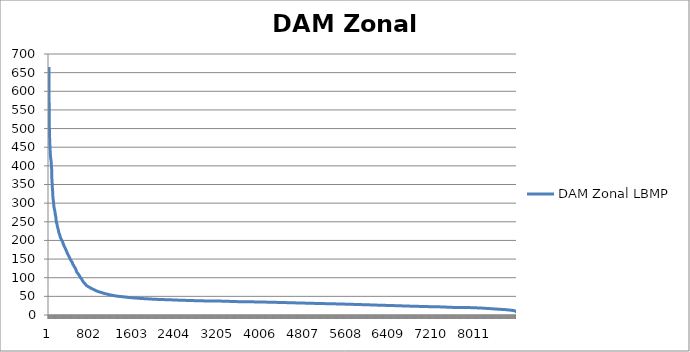
| Category | DAM Zonal LBMP |
|---|---|
| 0 | 665.35 |
| 1 | 580.62 |
| 2 | 568.12 |
| 3 | 553.7 |
| 4 | 545.89 |
| 5 | 512.96 |
| 6 | 510.96 |
| 7 | 499.26 |
| 8 | 496.6 |
| 9 | 488.15 |
| 10 | 484.15 |
| 11 | 476.56 |
| 12 | 470.48 |
| 13 | 469.7 |
| 14 | 469.51 |
| 15 | 469.26 |
| 16 | 456 |
| 17 | 455.35 |
| 18 | 454.32 |
| 19 | 451.83 |
| 20 | 444.58 |
| 21 | 442.92 |
| 22 | 436.74 |
| 23 | 436.43 |
| 24 | 432.55 |
| 25 | 429.77 |
| 26 | 428.51 |
| 27 | 428.31 |
| 28 | 427.46 |
| 29 | 424.09 |
| 30 | 424.05 |
| 31 | 420.36 |
| 32 | 419.94 |
| 33 | 419.63 |
| 34 | 418.89 |
| 35 | 417.69 |
| 36 | 415.25 |
| 37 | 415.15 |
| 38 | 412.58 |
| 39 | 411.76 |
| 40 | 410.02 |
| 41 | 408.96 |
| 42 | 407.86 |
| 43 | 403.65 |
| 44 | 403.42 |
| 45 | 400.76 |
| 46 | 400.01 |
| 47 | 399.33 |
| 48 | 395.94 |
| 49 | 395.76 |
| 50 | 385.12 |
| 51 | 379.65 |
| 52 | 378.15 |
| 53 | 366.16 |
| 54 | 363.54 |
| 55 | 362.32 |
| 56 | 360.92 |
| 57 | 357.07 |
| 58 | 354.54 |
| 59 | 351.6 |
| 60 | 349.87 |
| 61 | 347.77 |
| 62 | 343.25 |
| 63 | 339.69 |
| 64 | 339.37 |
| 65 | 337.61 |
| 66 | 334.68 |
| 67 | 333.67 |
| 68 | 331.34 |
| 69 | 330.41 |
| 70 | 329.14 |
| 71 | 326.86 |
| 72 | 318.92 |
| 73 | 316.81 |
| 74 | 311.57 |
| 75 | 311.02 |
| 76 | 311.01 |
| 77 | 310.96 |
| 78 | 310.32 |
| 79 | 309.67 |
| 80 | 308.73 |
| 81 | 306.71 |
| 82 | 304.13 |
| 83 | 302.86 |
| 84 | 301.21 |
| 85 | 300.62 |
| 86 | 298.93 |
| 87 | 298.48 |
| 88 | 298.3 |
| 89 | 297.45 |
| 90 | 293.29 |
| 91 | 292.78 |
| 92 | 291.14 |
| 93 | 289.45 |
| 94 | 289.05 |
| 95 | 287.3 |
| 96 | 287.07 |
| 97 | 286.2 |
| 98 | 285.13 |
| 99 | 284.58 |
| 100 | 283.75 |
| 101 | 283.4 |
| 102 | 283.07 |
| 103 | 282.37 |
| 104 | 282 |
| 105 | 281.5 |
| 106 | 281.09 |
| 107 | 279.94 |
| 108 | 278.68 |
| 109 | 278.52 |
| 110 | 277.72 |
| 111 | 277.33 |
| 112 | 275.64 |
| 113 | 275.32 |
| 114 | 274.28 |
| 115 | 272.55 |
| 116 | 272.09 |
| 117 | 271.33 |
| 118 | 271.12 |
| 119 | 268.73 |
| 120 | 268.51 |
| 121 | 268.48 |
| 122 | 266.72 |
| 123 | 266.6 |
| 124 | 266.44 |
| 125 | 264 |
| 126 | 262.85 |
| 127 | 262.77 |
| 128 | 262.18 |
| 129 | 261.53 |
| 130 | 260.36 |
| 131 | 258.55 |
| 132 | 258.51 |
| 133 | 253.5 |
| 134 | 251.85 |
| 135 | 249.62 |
| 136 | 249.53 |
| 137 | 249.08 |
| 138 | 248.22 |
| 139 | 248 |
| 140 | 247.15 |
| 141 | 247.06 |
| 142 | 247 |
| 143 | 246.88 |
| 144 | 246.64 |
| 145 | 245.53 |
| 146 | 245.09 |
| 147 | 244.69 |
| 148 | 244.17 |
| 149 | 242.4 |
| 150 | 242.17 |
| 151 | 241.96 |
| 152 | 241.79 |
| 153 | 240.59 |
| 154 | 239.48 |
| 155 | 239.36 |
| 156 | 238.17 |
| 157 | 237.41 |
| 158 | 236.95 |
| 159 | 236.7 |
| 160 | 236.33 |
| 161 | 235.99 |
| 162 | 234.31 |
| 163 | 234.3 |
| 164 | 232.98 |
| 165 | 232.9 |
| 166 | 232.33 |
| 167 | 231.44 |
| 168 | 231.11 |
| 169 | 230.97 |
| 170 | 230.01 |
| 171 | 229.63 |
| 172 | 229.58 |
| 173 | 229.51 |
| 174 | 228.38 |
| 175 | 226.42 |
| 176 | 226.26 |
| 177 | 226.19 |
| 178 | 225 |
| 179 | 224.56 |
| 180 | 223.85 |
| 181 | 222.18 |
| 182 | 221.73 |
| 183 | 220.83 |
| 184 | 220.6 |
| 185 | 220.38 |
| 186 | 220.2 |
| 187 | 219.83 |
| 188 | 219.8 |
| 189 | 219.76 |
| 190 | 218.7 |
| 191 | 218.39 |
| 192 | 218.16 |
| 193 | 217.97 |
| 194 | 217.66 |
| 195 | 217.36 |
| 196 | 215.95 |
| 197 | 215.92 |
| 198 | 215.72 |
| 199 | 215.2 |
| 200 | 214.83 |
| 201 | 214.58 |
| 202 | 214.32 |
| 203 | 213.27 |
| 204 | 213.25 |
| 205 | 213.02 |
| 206 | 210.9 |
| 207 | 210.83 |
| 208 | 209.74 |
| 209 | 209.39 |
| 210 | 209.34 |
| 211 | 209.13 |
| 212 | 208.88 |
| 213 | 208.8 |
| 214 | 208.64 |
| 215 | 208.41 |
| 216 | 207.47 |
| 217 | 206.36 |
| 218 | 206.25 |
| 219 | 206.23 |
| 220 | 206.17 |
| 221 | 206.06 |
| 222 | 205.9 |
| 223 | 205.64 |
| 224 | 205.37 |
| 225 | 205.34 |
| 226 | 205.17 |
| 227 | 204.56 |
| 228 | 204.25 |
| 229 | 203.61 |
| 230 | 203.3 |
| 231 | 203.11 |
| 232 | 202.7 |
| 233 | 202.28 |
| 234 | 201.8 |
| 235 | 201.67 |
| 236 | 201.57 |
| 237 | 201.26 |
| 238 | 200.04 |
| 239 | 199.91 |
| 240 | 199.86 |
| 241 | 199.64 |
| 242 | 198.75 |
| 243 | 198.73 |
| 244 | 198.48 |
| 245 | 198.35 |
| 246 | 198.17 |
| 247 | 198.08 |
| 248 | 197.7 |
| 249 | 197.55 |
| 250 | 197.24 |
| 251 | 197.11 |
| 252 | 197.1 |
| 253 | 196.43 |
| 254 | 195.7 |
| 255 | 195.61 |
| 256 | 195.61 |
| 257 | 195 |
| 258 | 194.77 |
| 259 | 194.41 |
| 260 | 194.3 |
| 261 | 193.99 |
| 262 | 192.54 |
| 263 | 192.19 |
| 264 | 191.29 |
| 265 | 191.2 |
| 266 | 191.03 |
| 267 | 190.75 |
| 268 | 189.97 |
| 269 | 189.88 |
| 270 | 189.79 |
| 271 | 189.69 |
| 272 | 189.2 |
| 273 | 188.55 |
| 274 | 188.21 |
| 275 | 188.09 |
| 276 | 187.88 |
| 277 | 187.34 |
| 278 | 187.3 |
| 279 | 186.15 |
| 280 | 185.68 |
| 281 | 185.16 |
| 282 | 185.12 |
| 283 | 184.86 |
| 284 | 184.83 |
| 285 | 184.71 |
| 286 | 184.16 |
| 287 | 183.75 |
| 288 | 183.39 |
| 289 | 183.26 |
| 290 | 182.99 |
| 291 | 182.4 |
| 292 | 181.33 |
| 293 | 181.15 |
| 294 | 181.03 |
| 295 | 180.87 |
| 296 | 180.72 |
| 297 | 180.6 |
| 298 | 180.54 |
| 299 | 180.34 |
| 300 | 180.1 |
| 301 | 179.39 |
| 302 | 178.2 |
| 303 | 178.04 |
| 304 | 178 |
| 305 | 177.98 |
| 306 | 177.89 |
| 307 | 177.51 |
| 308 | 177.29 |
| 309 | 177.07 |
| 310 | 176.97 |
| 311 | 176.56 |
| 312 | 176.44 |
| 313 | 175.9 |
| 314 | 175.14 |
| 315 | 175.12 |
| 316 | 174.78 |
| 317 | 174.33 |
| 318 | 174.24 |
| 319 | 174.12 |
| 320 | 174.12 |
| 321 | 173.89 |
| 322 | 173.33 |
| 323 | 173.11 |
| 324 | 172.91 |
| 325 | 172.42 |
| 326 | 172.3 |
| 327 | 171.95 |
| 328 | 171.3 |
| 329 | 171.13 |
| 330 | 170.32 |
| 331 | 170.21 |
| 332 | 169.04 |
| 333 | 168.88 |
| 334 | 168.88 |
| 335 | 168.62 |
| 336 | 168.45 |
| 337 | 168.21 |
| 338 | 167.56 |
| 339 | 167.48 |
| 340 | 167.22 |
| 341 | 166.13 |
| 342 | 165.25 |
| 343 | 165.18 |
| 344 | 165.15 |
| 345 | 164.66 |
| 346 | 164.41 |
| 347 | 163.8 |
| 348 | 163.72 |
| 349 | 163.53 |
| 350 | 163.06 |
| 351 | 163.03 |
| 352 | 162.88 |
| 353 | 162.79 |
| 354 | 162.58 |
| 355 | 162.32 |
| 356 | 162.31 |
| 357 | 162.05 |
| 358 | 161.85 |
| 359 | 161.33 |
| 360 | 160.7 |
| 361 | 160.52 |
| 362 | 160 |
| 363 | 159.7 |
| 364 | 159.58 |
| 365 | 159.52 |
| 366 | 159.35 |
| 367 | 159.33 |
| 368 | 158.91 |
| 369 | 158.45 |
| 370 | 158.35 |
| 371 | 158.24 |
| 372 | 158.12 |
| 373 | 157.7 |
| 374 | 157.22 |
| 375 | 157.19 |
| 376 | 156.4 |
| 377 | 156.28 |
| 378 | 156.25 |
| 379 | 155.78 |
| 380 | 155.19 |
| 381 | 154.25 |
| 382 | 154.21 |
| 383 | 154.15 |
| 384 | 154.09 |
| 385 | 153.25 |
| 386 | 152.77 |
| 387 | 152.76 |
| 388 | 152.76 |
| 389 | 152.44 |
| 390 | 152.38 |
| 391 | 152.01 |
| 392 | 151.75 |
| 393 | 151.58 |
| 394 | 150.44 |
| 395 | 150 |
| 396 | 149.78 |
| 397 | 149.4 |
| 398 | 149 |
| 399 | 148.92 |
| 400 | 148.72 |
| 401 | 148.15 |
| 402 | 148.07 |
| 403 | 147.92 |
| 404 | 147.73 |
| 405 | 147.62 |
| 406 | 147.54 |
| 407 | 147.51 |
| 408 | 147.47 |
| 409 | 147.03 |
| 410 | 145.99 |
| 411 | 145.72 |
| 412 | 145.68 |
| 413 | 145.63 |
| 414 | 145.32 |
| 415 | 145.25 |
| 416 | 144.98 |
| 417 | 144.88 |
| 418 | 144.76 |
| 419 | 144.45 |
| 420 | 143.89 |
| 421 | 143.77 |
| 422 | 143.63 |
| 423 | 143.58 |
| 424 | 143.44 |
| 425 | 143.31 |
| 426 | 143.07 |
| 427 | 142.99 |
| 428 | 142.78 |
| 429 | 142.43 |
| 430 | 142.21 |
| 431 | 141.75 |
| 432 | 141.67 |
| 433 | 141.34 |
| 434 | 140.16 |
| 435 | 140.04 |
| 436 | 139.99 |
| 437 | 139.88 |
| 438 | 139.49 |
| 439 | 139.31 |
| 440 | 138.92 |
| 441 | 138.32 |
| 442 | 137.85 |
| 443 | 137.58 |
| 444 | 136.36 |
| 445 | 136.06 |
| 446 | 135.91 |
| 447 | 135.74 |
| 448 | 135.68 |
| 449 | 135.68 |
| 450 | 135.33 |
| 451 | 135.18 |
| 452 | 135.01 |
| 453 | 134.7 |
| 454 | 134.54 |
| 455 | 134.53 |
| 456 | 134.3 |
| 457 | 134.2 |
| 458 | 133.73 |
| 459 | 133.59 |
| 460 | 133.53 |
| 461 | 133.49 |
| 462 | 133.1 |
| 463 | 132.77 |
| 464 | 132.47 |
| 465 | 132.32 |
| 466 | 131.88 |
| 467 | 131.49 |
| 468 | 131.14 |
| 469 | 131.12 |
| 470 | 131.04 |
| 471 | 130.96 |
| 472 | 129.62 |
| 473 | 129.61 |
| 474 | 129.58 |
| 475 | 128.76 |
| 476 | 128.59 |
| 477 | 128.53 |
| 478 | 128.26 |
| 479 | 127.99 |
| 480 | 127.9 |
| 481 | 127.7 |
| 482 | 127.64 |
| 483 | 127.08 |
| 484 | 127.03 |
| 485 | 126.86 |
| 486 | 126.59 |
| 487 | 126.53 |
| 488 | 126.48 |
| 489 | 126.2 |
| 490 | 126.13 |
| 491 | 125.93 |
| 492 | 125.63 |
| 493 | 125.17 |
| 494 | 124.48 |
| 495 | 124.34 |
| 496 | 124.14 |
| 497 | 123.43 |
| 498 | 122.81 |
| 499 | 122.57 |
| 500 | 122.54 |
| 501 | 122.52 |
| 502 | 122.48 |
| 503 | 122.24 |
| 504 | 122.07 |
| 505 | 120.87 |
| 506 | 120.2 |
| 507 | 119.87 |
| 508 | 119.44 |
| 509 | 119.28 |
| 510 | 118.93 |
| 511 | 118.09 |
| 512 | 117.88 |
| 513 | 117.83 |
| 514 | 117.48 |
| 515 | 117.36 |
| 516 | 116.48 |
| 517 | 116.1 |
| 518 | 115.67 |
| 519 | 115 |
| 520 | 114.56 |
| 521 | 114.55 |
| 522 | 114.27 |
| 523 | 114.21 |
| 524 | 113.76 |
| 525 | 113.7 |
| 526 | 113.65 |
| 527 | 113.52 |
| 528 | 113.5 |
| 529 | 113.45 |
| 530 | 113.35 |
| 531 | 113.07 |
| 532 | 112.94 |
| 533 | 112.71 |
| 534 | 112.56 |
| 535 | 112.2 |
| 536 | 111.62 |
| 537 | 111.35 |
| 538 | 111.22 |
| 539 | 111.18 |
| 540 | 111.14 |
| 541 | 110.91 |
| 542 | 110.68 |
| 543 | 110.65 |
| 544 | 110.54 |
| 545 | 110.51 |
| 546 | 110.23 |
| 547 | 109.87 |
| 548 | 109.63 |
| 549 | 109.51 |
| 550 | 109.06 |
| 551 | 108.71 |
| 552 | 108.36 |
| 553 | 108.11 |
| 554 | 108.08 |
| 555 | 107.83 |
| 556 | 107.69 |
| 557 | 107.58 |
| 558 | 107.58 |
| 559 | 107.55 |
| 560 | 107.45 |
| 561 | 107.31 |
| 562 | 106.95 |
| 563 | 106.7 |
| 564 | 106.55 |
| 565 | 106.38 |
| 566 | 106.25 |
| 567 | 105.48 |
| 568 | 105.22 |
| 569 | 105 |
| 570 | 104.88 |
| 571 | 104.86 |
| 572 | 104.76 |
| 573 | 104.37 |
| 574 | 103.98 |
| 575 | 103.9 |
| 576 | 103.77 |
| 577 | 103.68 |
| 578 | 103.26 |
| 579 | 103.02 |
| 580 | 102.55 |
| 581 | 102.04 |
| 582 | 101.7 |
| 583 | 101.45 |
| 584 | 101.2 |
| 585 | 100.79 |
| 586 | 100.76 |
| 587 | 100.59 |
| 588 | 100.45 |
| 589 | 100.26 |
| 590 | 99.94 |
| 591 | 99.86 |
| 592 | 99.71 |
| 593 | 99.68 |
| 594 | 99.51 |
| 595 | 99.2 |
| 596 | 99.1 |
| 597 | 98.97 |
| 598 | 98.9 |
| 599 | 98.75 |
| 600 | 98.43 |
| 601 | 98.41 |
| 602 | 98.37 |
| 603 | 97.71 |
| 604 | 97.5 |
| 605 | 97.14 |
| 606 | 96.63 |
| 607 | 96.6 |
| 608 | 96.42 |
| 609 | 96.14 |
| 610 | 96.13 |
| 611 | 95.84 |
| 612 | 95.81 |
| 613 | 95.8 |
| 614 | 95.7 |
| 615 | 95.23 |
| 616 | 94.61 |
| 617 | 94.55 |
| 618 | 94.4 |
| 619 | 94.23 |
| 620 | 93.51 |
| 621 | 93.2 |
| 622 | 93.2 |
| 623 | 92.85 |
| 624 | 92.83 |
| 625 | 92.79 |
| 626 | 91.94 |
| 627 | 91.83 |
| 628 | 91.81 |
| 629 | 91.63 |
| 630 | 91.57 |
| 631 | 90.82 |
| 632 | 90.31 |
| 633 | 90.29 |
| 634 | 90.29 |
| 635 | 90.25 |
| 636 | 90.14 |
| 637 | 90.04 |
| 638 | 89.94 |
| 639 | 89.77 |
| 640 | 89.7 |
| 641 | 89.15 |
| 642 | 89.04 |
| 643 | 88.73 |
| 644 | 88.17 |
| 645 | 88.13 |
| 646 | 88.09 |
| 647 | 88.07 |
| 648 | 87.81 |
| 649 | 87.8 |
| 650 | 87.34 |
| 651 | 87.03 |
| 652 | 86.94 |
| 653 | 86.93 |
| 654 | 86.92 |
| 655 | 86.8 |
| 656 | 86.43 |
| 657 | 86.04 |
| 658 | 85.95 |
| 659 | 85.72 |
| 660 | 85.67 |
| 661 | 85.56 |
| 662 | 85.38 |
| 663 | 85.29 |
| 664 | 85.16 |
| 665 | 85.14 |
| 666 | 85.01 |
| 667 | 85.01 |
| 668 | 84.54 |
| 669 | 84.32 |
| 670 | 84.13 |
| 671 | 84.11 |
| 672 | 83.93 |
| 673 | 83.88 |
| 674 | 83.67 |
| 675 | 83.64 |
| 676 | 83.45 |
| 677 | 83.29 |
| 678 | 83.04 |
| 679 | 82.97 |
| 680 | 82.73 |
| 681 | 82.51 |
| 682 | 82.32 |
| 683 | 82.25 |
| 684 | 82.12 |
| 685 | 81.81 |
| 686 | 81.7 |
| 687 | 81.66 |
| 688 | 81.66 |
| 689 | 81.48 |
| 690 | 81.43 |
| 691 | 81.36 |
| 692 | 81.21 |
| 693 | 80.64 |
| 694 | 80.5 |
| 695 | 80.26 |
| 696 | 79.79 |
| 697 | 79.48 |
| 698 | 79.34 |
| 699 | 79.31 |
| 700 | 79.28 |
| 701 | 79.08 |
| 702 | 79.04 |
| 703 | 78.95 |
| 704 | 78.87 |
| 705 | 78.69 |
| 706 | 78.59 |
| 707 | 78.48 |
| 708 | 78.47 |
| 709 | 78.47 |
| 710 | 78.32 |
| 711 | 78.3 |
| 712 | 78.27 |
| 713 | 78.18 |
| 714 | 78.1 |
| 715 | 78.08 |
| 716 | 77.54 |
| 717 | 77.52 |
| 718 | 77.34 |
| 719 | 77.32 |
| 720 | 77.27 |
| 721 | 77.24 |
| 722 | 77.21 |
| 723 | 77.19 |
| 724 | 77.15 |
| 725 | 77.06 |
| 726 | 77.04 |
| 727 | 76.99 |
| 728 | 76.93 |
| 729 | 76.78 |
| 730 | 76.68 |
| 731 | 76.6 |
| 732 | 76.58 |
| 733 | 76.35 |
| 734 | 76.24 |
| 735 | 76.19 |
| 736 | 76.1 |
| 737 | 76.02 |
| 738 | 75.97 |
| 739 | 75.55 |
| 740 | 75.46 |
| 741 | 75.26 |
| 742 | 75.24 |
| 743 | 75.18 |
| 744 | 75.18 |
| 745 | 75.16 |
| 746 | 75.12 |
| 747 | 75.11 |
| 748 | 75.09 |
| 749 | 74.97 |
| 750 | 74.88 |
| 751 | 74.86 |
| 752 | 74.69 |
| 753 | 74.64 |
| 754 | 74.62 |
| 755 | 74.49 |
| 756 | 74.47 |
| 757 | 74.47 |
| 758 | 74.41 |
| 759 | 74.29 |
| 760 | 74.28 |
| 761 | 73.94 |
| 762 | 73.9 |
| 763 | 73.88 |
| 764 | 73.86 |
| 765 | 73.86 |
| 766 | 73.77 |
| 767 | 73.59 |
| 768 | 73.44 |
| 769 | 73.17 |
| 770 | 72.88 |
| 771 | 72.74 |
| 772 | 72.73 |
| 773 | 72.68 |
| 774 | 72.63 |
| 775 | 72.63 |
| 776 | 72.6 |
| 777 | 72.49 |
| 778 | 72.41 |
| 779 | 72.36 |
| 780 | 72.35 |
| 781 | 72.28 |
| 782 | 72.28 |
| 783 | 72.15 |
| 784 | 72.1 |
| 785 | 71.96 |
| 786 | 71.8 |
| 787 | 71.79 |
| 788 | 71.75 |
| 789 | 71.46 |
| 790 | 71.44 |
| 791 | 71.17 |
| 792 | 71.15 |
| 793 | 71.09 |
| 794 | 71.08 |
| 795 | 71.08 |
| 796 | 70.89 |
| 797 | 70.87 |
| 798 | 70.71 |
| 799 | 70.68 |
| 800 | 70.68 |
| 801 | 70.67 |
| 802 | 70.63 |
| 803 | 70.55 |
| 804 | 70.5 |
| 805 | 70.46 |
| 806 | 70.33 |
| 807 | 70.33 |
| 808 | 70.31 |
| 809 | 70.07 |
| 810 | 69.97 |
| 811 | 69.97 |
| 812 | 69.93 |
| 813 | 69.92 |
| 814 | 69.91 |
| 815 | 69.84 |
| 816 | 69.84 |
| 817 | 69.72 |
| 818 | 69.71 |
| 819 | 69.51 |
| 820 | 69.51 |
| 821 | 69.51 |
| 822 | 69.49 |
| 823 | 69.46 |
| 824 | 69.46 |
| 825 | 69.17 |
| 826 | 69.14 |
| 827 | 69 |
| 828 | 68.98 |
| 829 | 68.79 |
| 830 | 68.78 |
| 831 | 68.61 |
| 832 | 68.47 |
| 833 | 68.39 |
| 834 | 68.35 |
| 835 | 68.32 |
| 836 | 68.29 |
| 837 | 68.19 |
| 838 | 68.07 |
| 839 | 68.04 |
| 840 | 68.02 |
| 841 | 67.93 |
| 842 | 67.9 |
| 843 | 67.73 |
| 844 | 67.64 |
| 845 | 67.43 |
| 846 | 67.41 |
| 847 | 67.27 |
| 848 | 67.26 |
| 849 | 67.25 |
| 850 | 67.16 |
| 851 | 67.11 |
| 852 | 67.1 |
| 853 | 67.1 |
| 854 | 67.09 |
| 855 | 67.04 |
| 856 | 66.91 |
| 857 | 66.85 |
| 858 | 66.78 |
| 859 | 66.63 |
| 860 | 66.45 |
| 861 | 66.38 |
| 862 | 66.32 |
| 863 | 66.27 |
| 864 | 66.09 |
| 865 | 66.03 |
| 866 | 66.02 |
| 867 | 65.82 |
| 868 | 65.81 |
| 869 | 65.72 |
| 870 | 65.71 |
| 871 | 65.56 |
| 872 | 65.55 |
| 873 | 65.49 |
| 874 | 65.48 |
| 875 | 65.39 |
| 876 | 65.25 |
| 877 | 65.24 |
| 878 | 65.23 |
| 879 | 65.09 |
| 880 | 64.99 |
| 881 | 64.93 |
| 882 | 64.91 |
| 883 | 64.91 |
| 884 | 64.87 |
| 885 | 64.87 |
| 886 | 64.79 |
| 887 | 64.74 |
| 888 | 64.66 |
| 889 | 64.65 |
| 890 | 64.64 |
| 891 | 64.6 |
| 892 | 64.52 |
| 893 | 64.52 |
| 894 | 64.48 |
| 895 | 64.48 |
| 896 | 64.48 |
| 897 | 64.34 |
| 898 | 64.22 |
| 899 | 64.22 |
| 900 | 64.17 |
| 901 | 64.11 |
| 902 | 63.97 |
| 903 | 63.96 |
| 904 | 63.81 |
| 905 | 63.8 |
| 906 | 63.69 |
| 907 | 63.45 |
| 908 | 63.45 |
| 909 | 63.45 |
| 910 | 63.42 |
| 911 | 63.4 |
| 912 | 63.37 |
| 913 | 63.24 |
| 914 | 63.22 |
| 915 | 63.2 |
| 916 | 63.17 |
| 917 | 63.14 |
| 918 | 63.11 |
| 919 | 63.1 |
| 920 | 63.07 |
| 921 | 63.03 |
| 922 | 62.95 |
| 923 | 62.94 |
| 924 | 62.81 |
| 925 | 62.8 |
| 926 | 62.72 |
| 927 | 62.71 |
| 928 | 62.49 |
| 929 | 62.43 |
| 930 | 62.33 |
| 931 | 62.3 |
| 932 | 62.28 |
| 933 | 62.25 |
| 934 | 62.24 |
| 935 | 62.2 |
| 936 | 62.18 |
| 937 | 62.11 |
| 938 | 62.08 |
| 939 | 62.05 |
| 940 | 61.97 |
| 941 | 61.96 |
| 942 | 61.76 |
| 943 | 61.75 |
| 944 | 61.71 |
| 945 | 61.7 |
| 946 | 61.64 |
| 947 | 61.56 |
| 948 | 61.56 |
| 949 | 61.56 |
| 950 | 61.48 |
| 951 | 61.48 |
| 952 | 61.48 |
| 953 | 61.46 |
| 954 | 61.37 |
| 955 | 61.32 |
| 956 | 61.18 |
| 957 | 61.17 |
| 958 | 61.11 |
| 959 | 61.1 |
| 960 | 61.07 |
| 961 | 61.05 |
| 962 | 61.04 |
| 963 | 61.03 |
| 964 | 60.94 |
| 965 | 60.93 |
| 966 | 60.92 |
| 967 | 60.91 |
| 968 | 60.82 |
| 969 | 60.79 |
| 970 | 60.78 |
| 971 | 60.78 |
| 972 | 60.76 |
| 973 | 60.76 |
| 974 | 60.75 |
| 975 | 60.72 |
| 976 | 60.72 |
| 977 | 60.5 |
| 978 | 60.49 |
| 979 | 60.46 |
| 980 | 60.42 |
| 981 | 60.27 |
| 982 | 60.22 |
| 983 | 60.07 |
| 984 | 60.07 |
| 985 | 60.07 |
| 986 | 60.04 |
| 987 | 60.04 |
| 988 | 59.95 |
| 989 | 59.93 |
| 990 | 59.92 |
| 991 | 59.91 |
| 992 | 59.86 |
| 993 | 59.69 |
| 994 | 59.68 |
| 995 | 59.67 |
| 996 | 59.64 |
| 997 | 59.53 |
| 998 | 59.43 |
| 999 | 59.43 |
| 1000 | 59.26 |
| 1001 | 59.22 |
| 1002 | 59.2 |
| 1003 | 59.19 |
| 1004 | 59.17 |
| 1005 | 59.11 |
| 1006 | 59.08 |
| 1007 | 59.08 |
| 1008 | 59.06 |
| 1009 | 59 |
| 1010 | 58.97 |
| 1011 | 58.93 |
| 1012 | 58.85 |
| 1013 | 58.78 |
| 1014 | 58.78 |
| 1015 | 58.76 |
| 1016 | 58.63 |
| 1017 | 58.59 |
| 1018 | 58.55 |
| 1019 | 58.49 |
| 1020 | 58.48 |
| 1021 | 58.36 |
| 1022 | 58.29 |
| 1023 | 58.28 |
| 1024 | 58.28 |
| 1025 | 58.19 |
| 1026 | 58.17 |
| 1027 | 58.1 |
| 1028 | 58.05 |
| 1029 | 58.04 |
| 1030 | 57.92 |
| 1031 | 57.92 |
| 1032 | 57.92 |
| 1033 | 57.91 |
| 1034 | 57.89 |
| 1035 | 57.82 |
| 1036 | 57.81 |
| 1037 | 57.58 |
| 1038 | 57.55 |
| 1039 | 57.54 |
| 1040 | 57.53 |
| 1041 | 57.52 |
| 1042 | 57.51 |
| 1043 | 57.44 |
| 1044 | 57.44 |
| 1045 | 57.37 |
| 1046 | 57.36 |
| 1047 | 57.32 |
| 1048 | 57.31 |
| 1049 | 57.29 |
| 1050 | 57.25 |
| 1051 | 57.1 |
| 1052 | 57.1 |
| 1053 | 57.09 |
| 1054 | 57.07 |
| 1055 | 57.06 |
| 1056 | 57.04 |
| 1057 | 57.03 |
| 1058 | 57 |
| 1059 | 56.96 |
| 1060 | 56.89 |
| 1061 | 56.86 |
| 1062 | 56.78 |
| 1063 | 56.73 |
| 1064 | 56.7 |
| 1065 | 56.63 |
| 1066 | 56.61 |
| 1067 | 56.59 |
| 1068 | 56.57 |
| 1069 | 56.55 |
| 1070 | 56.54 |
| 1071 | 56.48 |
| 1072 | 56.47 |
| 1073 | 56.47 |
| 1074 | 56.45 |
| 1075 | 56.44 |
| 1076 | 56.43 |
| 1077 | 56.41 |
| 1078 | 56.4 |
| 1079 | 56.4 |
| 1080 | 56.37 |
| 1081 | 56.36 |
| 1082 | 56.35 |
| 1083 | 56.34 |
| 1084 | 56.27 |
| 1085 | 56.19 |
| 1086 | 56.18 |
| 1087 | 56.15 |
| 1088 | 56.12 |
| 1089 | 55.99 |
| 1090 | 55.91 |
| 1091 | 55.85 |
| 1092 | 55.83 |
| 1093 | 55.81 |
| 1094 | 55.73 |
| 1095 | 55.71 |
| 1096 | 55.69 |
| 1097 | 55.68 |
| 1098 | 55.64 |
| 1099 | 55.62 |
| 1100 | 55.52 |
| 1101 | 55.48 |
| 1102 | 55.47 |
| 1103 | 55.43 |
| 1104 | 55.38 |
| 1105 | 55.34 |
| 1106 | 55.34 |
| 1107 | 55.3 |
| 1108 | 55.19 |
| 1109 | 55.18 |
| 1110 | 55.16 |
| 1111 | 55.15 |
| 1112 | 55.13 |
| 1113 | 55.04 |
| 1114 | 54.98 |
| 1115 | 54.97 |
| 1116 | 54.95 |
| 1117 | 54.79 |
| 1118 | 54.73 |
| 1119 | 54.72 |
| 1120 | 54.66 |
| 1121 | 54.64 |
| 1122 | 54.62 |
| 1123 | 54.54 |
| 1124 | 54.52 |
| 1125 | 54.47 |
| 1126 | 54.44 |
| 1127 | 54.43 |
| 1128 | 54.42 |
| 1129 | 54.4 |
| 1130 | 54.39 |
| 1131 | 54.35 |
| 1132 | 54.34 |
| 1133 | 54.33 |
| 1134 | 54.33 |
| 1135 | 54.31 |
| 1136 | 54.29 |
| 1137 | 54.26 |
| 1138 | 54.21 |
| 1139 | 54.18 |
| 1140 | 54.18 |
| 1141 | 54.14 |
| 1142 | 54.07 |
| 1143 | 53.98 |
| 1144 | 53.98 |
| 1145 | 53.97 |
| 1146 | 53.9 |
| 1147 | 53.88 |
| 1148 | 53.86 |
| 1149 | 53.84 |
| 1150 | 53.81 |
| 1151 | 53.7 |
| 1152 | 53.66 |
| 1153 | 53.66 |
| 1154 | 53.64 |
| 1155 | 53.63 |
| 1156 | 53.62 |
| 1157 | 53.6 |
| 1158 | 53.59 |
| 1159 | 53.55 |
| 1160 | 53.52 |
| 1161 | 53.5 |
| 1162 | 53.47 |
| 1163 | 53.45 |
| 1164 | 53.45 |
| 1165 | 53.45 |
| 1166 | 53.42 |
| 1167 | 53.4 |
| 1168 | 53.36 |
| 1169 | 53.34 |
| 1170 | 53.32 |
| 1171 | 53.22 |
| 1172 | 53.2 |
| 1173 | 53.2 |
| 1174 | 53.11 |
| 1175 | 53.1 |
| 1176 | 53.07 |
| 1177 | 53.03 |
| 1178 | 53.01 |
| 1179 | 52.99 |
| 1180 | 52.9 |
| 1181 | 52.89 |
| 1182 | 52.87 |
| 1183 | 52.84 |
| 1184 | 52.8 |
| 1185 | 52.79 |
| 1186 | 52.78 |
| 1187 | 52.67 |
| 1188 | 52.65 |
| 1189 | 52.64 |
| 1190 | 52.57 |
| 1191 | 52.55 |
| 1192 | 52.54 |
| 1193 | 52.53 |
| 1194 | 52.49 |
| 1195 | 52.44 |
| 1196 | 52.44 |
| 1197 | 52.43 |
| 1198 | 52.41 |
| 1199 | 52.36 |
| 1200 | 52.36 |
| 1201 | 52.35 |
| 1202 | 52.33 |
| 1203 | 52.33 |
| 1204 | 52.3 |
| 1205 | 52.27 |
| 1206 | 52.26 |
| 1207 | 52.25 |
| 1208 | 52.22 |
| 1209 | 52.21 |
| 1210 | 52.2 |
| 1211 | 52.19 |
| 1212 | 52.13 |
| 1213 | 52.13 |
| 1214 | 52.12 |
| 1215 | 52.1 |
| 1216 | 52.07 |
| 1217 | 52.07 |
| 1218 | 52.02 |
| 1219 | 52.01 |
| 1220 | 51.99 |
| 1221 | 51.97 |
| 1222 | 51.94 |
| 1223 | 51.94 |
| 1224 | 51.81 |
| 1225 | 51.78 |
| 1226 | 51.77 |
| 1227 | 51.71 |
| 1228 | 51.63 |
| 1229 | 51.6 |
| 1230 | 51.47 |
| 1231 | 51.43 |
| 1232 | 51.42 |
| 1233 | 51.42 |
| 1234 | 51.39 |
| 1235 | 51.39 |
| 1236 | 51.39 |
| 1237 | 51.39 |
| 1238 | 51.39 |
| 1239 | 51.36 |
| 1240 | 51.34 |
| 1241 | 51.31 |
| 1242 | 51.27 |
| 1243 | 51.25 |
| 1244 | 51.23 |
| 1245 | 51.2 |
| 1246 | 51.18 |
| 1247 | 51.15 |
| 1248 | 51.12 |
| 1249 | 51.12 |
| 1250 | 51.07 |
| 1251 | 51.07 |
| 1252 | 51.05 |
| 1253 | 51.02 |
| 1254 | 50.99 |
| 1255 | 50.99 |
| 1256 | 50.98 |
| 1257 | 50.93 |
| 1258 | 50.92 |
| 1259 | 50.92 |
| 1260 | 50.91 |
| 1261 | 50.87 |
| 1262 | 50.81 |
| 1263 | 50.79 |
| 1264 | 50.77 |
| 1265 | 50.75 |
| 1266 | 50.72 |
| 1267 | 50.71 |
| 1268 | 50.69 |
| 1269 | 50.67 |
| 1270 | 50.66 |
| 1271 | 50.62 |
| 1272 | 50.62 |
| 1273 | 50.62 |
| 1274 | 50.54 |
| 1275 | 50.53 |
| 1276 | 50.51 |
| 1277 | 50.5 |
| 1278 | 50.5 |
| 1279 | 50.48 |
| 1280 | 50.44 |
| 1281 | 50.43 |
| 1282 | 50.42 |
| 1283 | 50.41 |
| 1284 | 50.4 |
| 1285 | 50.39 |
| 1286 | 50.35 |
| 1287 | 50.34 |
| 1288 | 50.3 |
| 1289 | 50.26 |
| 1290 | 50.26 |
| 1291 | 50.25 |
| 1292 | 50.18 |
| 1293 | 50.18 |
| 1294 | 50.18 |
| 1295 | 50.12 |
| 1296 | 50.12 |
| 1297 | 50.11 |
| 1298 | 50.09 |
| 1299 | 50.08 |
| 1300 | 50.05 |
| 1301 | 50.04 |
| 1302 | 50.03 |
| 1303 | 50.03 |
| 1304 | 50 |
| 1305 | 49.99 |
| 1306 | 49.95 |
| 1307 | 49.94 |
| 1308 | 49.94 |
| 1309 | 49.94 |
| 1310 | 49.89 |
| 1311 | 49.88 |
| 1312 | 49.87 |
| 1313 | 49.87 |
| 1314 | 49.86 |
| 1315 | 49.83 |
| 1316 | 49.83 |
| 1317 | 49.82 |
| 1318 | 49.78 |
| 1319 | 49.74 |
| 1320 | 49.73 |
| 1321 | 49.72 |
| 1322 | 49.71 |
| 1323 | 49.71 |
| 1324 | 49.69 |
| 1325 | 49.69 |
| 1326 | 49.64 |
| 1327 | 49.61 |
| 1328 | 49.61 |
| 1329 | 49.6 |
| 1330 | 49.59 |
| 1331 | 49.59 |
| 1332 | 49.58 |
| 1333 | 49.56 |
| 1334 | 49.56 |
| 1335 | 49.55 |
| 1336 | 49.54 |
| 1337 | 49.54 |
| 1338 | 49.53 |
| 1339 | 49.52 |
| 1340 | 49.51 |
| 1341 | 49.51 |
| 1342 | 49.51 |
| 1343 | 49.49 |
| 1344 | 49.48 |
| 1345 | 49.47 |
| 1346 | 49.46 |
| 1347 | 49.46 |
| 1348 | 49.45 |
| 1349 | 49.45 |
| 1350 | 49.42 |
| 1351 | 49.4 |
| 1352 | 49.39 |
| 1353 | 49.38 |
| 1354 | 49.36 |
| 1355 | 49.36 |
| 1356 | 49.35 |
| 1357 | 49.34 |
| 1358 | 49.31 |
| 1359 | 49.3 |
| 1360 | 49.28 |
| 1361 | 49.26 |
| 1362 | 49.25 |
| 1363 | 49.24 |
| 1364 | 49.23 |
| 1365 | 49.21 |
| 1366 | 49.19 |
| 1367 | 49.16 |
| 1368 | 49.15 |
| 1369 | 49.15 |
| 1370 | 49.13 |
| 1371 | 49.13 |
| 1372 | 49.08 |
| 1373 | 49.06 |
| 1374 | 49.04 |
| 1375 | 48.99 |
| 1376 | 48.99 |
| 1377 | 48.98 |
| 1378 | 48.97 |
| 1379 | 48.96 |
| 1380 | 48.96 |
| 1381 | 48.96 |
| 1382 | 48.92 |
| 1383 | 48.91 |
| 1384 | 48.81 |
| 1385 | 48.81 |
| 1386 | 48.8 |
| 1387 | 48.77 |
| 1388 | 48.76 |
| 1389 | 48.76 |
| 1390 | 48.72 |
| 1391 | 48.72 |
| 1392 | 48.71 |
| 1393 | 48.71 |
| 1394 | 48.69 |
| 1395 | 48.69 |
| 1396 | 48.65 |
| 1397 | 48.64 |
| 1398 | 48.62 |
| 1399 | 48.58 |
| 1400 | 48.57 |
| 1401 | 48.56 |
| 1402 | 48.53 |
| 1403 | 48.48 |
| 1404 | 48.48 |
| 1405 | 48.47 |
| 1406 | 48.4 |
| 1407 | 48.39 |
| 1408 | 48.38 |
| 1409 | 48.36 |
| 1410 | 48.35 |
| 1411 | 48.35 |
| 1412 | 48.34 |
| 1413 | 48.33 |
| 1414 | 48.31 |
| 1415 | 48.3 |
| 1416 | 48.29 |
| 1417 | 48.27 |
| 1418 | 48.23 |
| 1419 | 48.2 |
| 1420 | 48.2 |
| 1421 | 48.17 |
| 1422 | 48.15 |
| 1423 | 48.15 |
| 1424 | 48.15 |
| 1425 | 48.13 |
| 1426 | 48.13 |
| 1427 | 48.1 |
| 1428 | 48.06 |
| 1429 | 48.05 |
| 1430 | 48.05 |
| 1431 | 48.03 |
| 1432 | 48.01 |
| 1433 | 48.01 |
| 1434 | 48.01 |
| 1435 | 47.99 |
| 1436 | 47.99 |
| 1437 | 47.99 |
| 1438 | 47.98 |
| 1439 | 47.97 |
| 1440 | 47.97 |
| 1441 | 47.96 |
| 1442 | 47.89 |
| 1443 | 47.87 |
| 1444 | 47.86 |
| 1445 | 47.81 |
| 1446 | 47.8 |
| 1447 | 47.76 |
| 1448 | 47.74 |
| 1449 | 47.72 |
| 1450 | 47.67 |
| 1451 | 47.64 |
| 1452 | 47.63 |
| 1453 | 47.62 |
| 1454 | 47.6 |
| 1455 | 47.53 |
| 1456 | 47.53 |
| 1457 | 47.52 |
| 1458 | 47.51 |
| 1459 | 47.48 |
| 1460 | 47.48 |
| 1461 | 47.47 |
| 1462 | 47.47 |
| 1463 | 47.46 |
| 1464 | 47.46 |
| 1465 | 47.45 |
| 1466 | 47.42 |
| 1467 | 47.4 |
| 1468 | 47.38 |
| 1469 | 47.38 |
| 1470 | 47.37 |
| 1471 | 47.36 |
| 1472 | 47.33 |
| 1473 | 47.29 |
| 1474 | 47.28 |
| 1475 | 47.27 |
| 1476 | 47.23 |
| 1477 | 47.22 |
| 1478 | 47.22 |
| 1479 | 47.21 |
| 1480 | 47.21 |
| 1481 | 47.2 |
| 1482 | 47.16 |
| 1483 | 47.16 |
| 1484 | 47.15 |
| 1485 | 47.14 |
| 1486 | 47.13 |
| 1487 | 47.13 |
| 1488 | 47.11 |
| 1489 | 47.1 |
| 1490 | 47.1 |
| 1491 | 47.08 |
| 1492 | 47.03 |
| 1493 | 47.02 |
| 1494 | 47.01 |
| 1495 | 47 |
| 1496 | 47 |
| 1497 | 46.99 |
| 1498 | 46.99 |
| 1499 | 46.97 |
| 1500 | 46.97 |
| 1501 | 46.97 |
| 1502 | 46.96 |
| 1503 | 46.92 |
| 1504 | 46.91 |
| 1505 | 46.9 |
| 1506 | 46.87 |
| 1507 | 46.87 |
| 1508 | 46.86 |
| 1509 | 46.85 |
| 1510 | 46.85 |
| 1511 | 46.83 |
| 1512 | 46.8 |
| 1513 | 46.79 |
| 1514 | 46.78 |
| 1515 | 46.78 |
| 1516 | 46.75 |
| 1517 | 46.7 |
| 1518 | 46.7 |
| 1519 | 46.68 |
| 1520 | 46.68 |
| 1521 | 46.67 |
| 1522 | 46.65 |
| 1523 | 46.63 |
| 1524 | 46.63 |
| 1525 | 46.62 |
| 1526 | 46.6 |
| 1527 | 46.58 |
| 1528 | 46.57 |
| 1529 | 46.56 |
| 1530 | 46.56 |
| 1531 | 46.55 |
| 1532 | 46.54 |
| 1533 | 46.52 |
| 1534 | 46.52 |
| 1535 | 46.51 |
| 1536 | 46.5 |
| 1537 | 46.48 |
| 1538 | 46.48 |
| 1539 | 46.47 |
| 1540 | 46.46 |
| 1541 | 46.46 |
| 1542 | 46.45 |
| 1543 | 46.45 |
| 1544 | 46.44 |
| 1545 | 46.41 |
| 1546 | 46.39 |
| 1547 | 46.38 |
| 1548 | 46.38 |
| 1549 | 46.37 |
| 1550 | 46.36 |
| 1551 | 46.33 |
| 1552 | 46.33 |
| 1553 | 46.31 |
| 1554 | 46.23 |
| 1555 | 46.23 |
| 1556 | 46.21 |
| 1557 | 46.21 |
| 1558 | 46.19 |
| 1559 | 46.18 |
| 1560 | 46.18 |
| 1561 | 46.16 |
| 1562 | 46.15 |
| 1563 | 46.12 |
| 1564 | 46.1 |
| 1565 | 46.1 |
| 1566 | 46.07 |
| 1567 | 46.07 |
| 1568 | 46.05 |
| 1569 | 46.01 |
| 1570 | 45.99 |
| 1571 | 45.98 |
| 1572 | 45.98 |
| 1573 | 45.97 |
| 1574 | 45.96 |
| 1575 | 45.95 |
| 1576 | 45.95 |
| 1577 | 45.91 |
| 1578 | 45.91 |
| 1579 | 45.9 |
| 1580 | 45.88 |
| 1581 | 45.88 |
| 1582 | 45.84 |
| 1583 | 45.83 |
| 1584 | 45.82 |
| 1585 | 45.82 |
| 1586 | 45.81 |
| 1587 | 45.81 |
| 1588 | 45.79 |
| 1589 | 45.78 |
| 1590 | 45.76 |
| 1591 | 45.75 |
| 1592 | 45.75 |
| 1593 | 45.75 |
| 1594 | 45.75 |
| 1595 | 45.72 |
| 1596 | 45.7 |
| 1597 | 45.69 |
| 1598 | 45.65 |
| 1599 | 45.65 |
| 1600 | 45.65 |
| 1601 | 45.64 |
| 1602 | 45.63 |
| 1603 | 45.61 |
| 1604 | 45.61 |
| 1605 | 45.59 |
| 1606 | 45.57 |
| 1607 | 45.56 |
| 1608 | 45.56 |
| 1609 | 45.56 |
| 1610 | 45.56 |
| 1611 | 45.55 |
| 1612 | 45.55 |
| 1613 | 45.55 |
| 1614 | 45.55 |
| 1615 | 45.55 |
| 1616 | 45.55 |
| 1617 | 45.55 |
| 1618 | 45.55 |
| 1619 | 45.55 |
| 1620 | 45.53 |
| 1621 | 45.52 |
| 1622 | 45.51 |
| 1623 | 45.5 |
| 1624 | 45.49 |
| 1625 | 45.48 |
| 1626 | 45.48 |
| 1627 | 45.48 |
| 1628 | 45.46 |
| 1629 | 45.46 |
| 1630 | 45.4 |
| 1631 | 45.39 |
| 1632 | 45.38 |
| 1633 | 45.36 |
| 1634 | 45.36 |
| 1635 | 45.35 |
| 1636 | 45.33 |
| 1637 | 45.32 |
| 1638 | 45.32 |
| 1639 | 45.32 |
| 1640 | 45.31 |
| 1641 | 45.3 |
| 1642 | 45.3 |
| 1643 | 45.29 |
| 1644 | 45.28 |
| 1645 | 45.27 |
| 1646 | 45.27 |
| 1647 | 45.26 |
| 1648 | 45.26 |
| 1649 | 45.24 |
| 1650 | 45.24 |
| 1651 | 45.24 |
| 1652 | 45.24 |
| 1653 | 45.23 |
| 1654 | 45.22 |
| 1655 | 45.2 |
| 1656 | 45.2 |
| 1657 | 45.2 |
| 1658 | 45.18 |
| 1659 | 45.18 |
| 1660 | 45.16 |
| 1661 | 45.14 |
| 1662 | 45.14 |
| 1663 | 45.13 |
| 1664 | 45.13 |
| 1665 | 45.1 |
| 1666 | 45.07 |
| 1667 | 45.07 |
| 1668 | 45.07 |
| 1669 | 45.06 |
| 1670 | 45.05 |
| 1671 | 45.04 |
| 1672 | 45.04 |
| 1673 | 45.03 |
| 1674 | 45.03 |
| 1675 | 45.02 |
| 1676 | 44.98 |
| 1677 | 44.98 |
| 1678 | 44.97 |
| 1679 | 44.97 |
| 1680 | 44.94 |
| 1681 | 44.94 |
| 1682 | 44.92 |
| 1683 | 44.89 |
| 1684 | 44.86 |
| 1685 | 44.81 |
| 1686 | 44.81 |
| 1687 | 44.8 |
| 1688 | 44.8 |
| 1689 | 44.75 |
| 1690 | 44.74 |
| 1691 | 44.73 |
| 1692 | 44.72 |
| 1693 | 44.72 |
| 1694 | 44.69 |
| 1695 | 44.67 |
| 1696 | 44.66 |
| 1697 | 44.65 |
| 1698 | 44.65 |
| 1699 | 44.65 |
| 1700 | 44.64 |
| 1701 | 44.64 |
| 1702 | 44.63 |
| 1703 | 44.61 |
| 1704 | 44.55 |
| 1705 | 44.55 |
| 1706 | 44.55 |
| 1707 | 44.54 |
| 1708 | 44.52 |
| 1709 | 44.52 |
| 1710 | 44.5 |
| 1711 | 44.5 |
| 1712 | 44.49 |
| 1713 | 44.48 |
| 1714 | 44.44 |
| 1715 | 44.42 |
| 1716 | 44.41 |
| 1717 | 44.41 |
| 1718 | 44.4 |
| 1719 | 44.39 |
| 1720 | 44.37 |
| 1721 | 44.36 |
| 1722 | 44.34 |
| 1723 | 44.32 |
| 1724 | 44.31 |
| 1725 | 44.29 |
| 1726 | 44.29 |
| 1727 | 44.29 |
| 1728 | 44.27 |
| 1729 | 44.27 |
| 1730 | 44.26 |
| 1731 | 44.26 |
| 1732 | 44.26 |
| 1733 | 44.23 |
| 1734 | 44.23 |
| 1735 | 44.22 |
| 1736 | 44.19 |
| 1737 | 44.16 |
| 1738 | 44.14 |
| 1739 | 44.14 |
| 1740 | 44.14 |
| 1741 | 44.14 |
| 1742 | 44.14 |
| 1743 | 44.12 |
| 1744 | 44.11 |
| 1745 | 44.1 |
| 1746 | 44.1 |
| 1747 | 44.08 |
| 1748 | 44.08 |
| 1749 | 44.07 |
| 1750 | 44.07 |
| 1751 | 44.07 |
| 1752 | 44.06 |
| 1753 | 44.06 |
| 1754 | 44.06 |
| 1755 | 44.05 |
| 1756 | 44.05 |
| 1757 | 44.03 |
| 1758 | 44.01 |
| 1759 | 44 |
| 1760 | 44 |
| 1761 | 44 |
| 1762 | 44 |
| 1763 | 44 |
| 1764 | 43.99 |
| 1765 | 43.98 |
| 1766 | 43.96 |
| 1767 | 43.95 |
| 1768 | 43.94 |
| 1769 | 43.94 |
| 1770 | 43.94 |
| 1771 | 43.93 |
| 1772 | 43.93 |
| 1773 | 43.91 |
| 1774 | 43.91 |
| 1775 | 43.89 |
| 1776 | 43.89 |
| 1777 | 43.89 |
| 1778 | 43.86 |
| 1779 | 43.85 |
| 1780 | 43.82 |
| 1781 | 43.82 |
| 1782 | 43.81 |
| 1783 | 43.8 |
| 1784 | 43.76 |
| 1785 | 43.75 |
| 1786 | 43.74 |
| 1787 | 43.72 |
| 1788 | 43.71 |
| 1789 | 43.7 |
| 1790 | 43.7 |
| 1791 | 43.68 |
| 1792 | 43.68 |
| 1793 | 43.68 |
| 1794 | 43.67 |
| 1795 | 43.66 |
| 1796 | 43.66 |
| 1797 | 43.65 |
| 1798 | 43.65 |
| 1799 | 43.63 |
| 1800 | 43.61 |
| 1801 | 43.61 |
| 1802 | 43.6 |
| 1803 | 43.6 |
| 1804 | 43.59 |
| 1805 | 43.59 |
| 1806 | 43.58 |
| 1807 | 43.58 |
| 1808 | 43.57 |
| 1809 | 43.57 |
| 1810 | 43.56 |
| 1811 | 43.56 |
| 1812 | 43.56 |
| 1813 | 43.55 |
| 1814 | 43.55 |
| 1815 | 43.55 |
| 1816 | 43.54 |
| 1817 | 43.53 |
| 1818 | 43.53 |
| 1819 | 43.53 |
| 1820 | 43.53 |
| 1821 | 43.53 |
| 1822 | 43.5 |
| 1823 | 43.5 |
| 1824 | 43.5 |
| 1825 | 43.5 |
| 1826 | 43.5 |
| 1827 | 43.5 |
| 1828 | 43.5 |
| 1829 | 43.5 |
| 1830 | 43.5 |
| 1831 | 43.49 |
| 1832 | 43.49 |
| 1833 | 43.49 |
| 1834 | 43.49 |
| 1835 | 43.48 |
| 1836 | 43.48 |
| 1837 | 43.46 |
| 1838 | 43.46 |
| 1839 | 43.44 |
| 1840 | 43.44 |
| 1841 | 43.42 |
| 1842 | 43.42 |
| 1843 | 43.42 |
| 1844 | 43.39 |
| 1845 | 43.38 |
| 1846 | 43.36 |
| 1847 | 43.36 |
| 1848 | 43.36 |
| 1849 | 43.34 |
| 1850 | 43.34 |
| 1851 | 43.33 |
| 1852 | 43.33 |
| 1853 | 43.32 |
| 1854 | 43.3 |
| 1855 | 43.3 |
| 1856 | 43.29 |
| 1857 | 43.28 |
| 1858 | 43.26 |
| 1859 | 43.26 |
| 1860 | 43.24 |
| 1861 | 43.23 |
| 1862 | 43.22 |
| 1863 | 43.21 |
| 1864 | 43.21 |
| 1865 | 43.2 |
| 1866 | 43.19 |
| 1867 | 43.19 |
| 1868 | 43.18 |
| 1869 | 43.17 |
| 1870 | 43.16 |
| 1871 | 43.16 |
| 1872 | 43.15 |
| 1873 | 43.12 |
| 1874 | 43.12 |
| 1875 | 43.12 |
| 1876 | 43.1 |
| 1877 | 43.09 |
| 1878 | 43.09 |
| 1879 | 43.08 |
| 1880 | 43.08 |
| 1881 | 43.04 |
| 1882 | 43.03 |
| 1883 | 43.01 |
| 1884 | 43 |
| 1885 | 42.99 |
| 1886 | 42.99 |
| 1887 | 42.98 |
| 1888 | 42.95 |
| 1889 | 42.95 |
| 1890 | 42.94 |
| 1891 | 42.94 |
| 1892 | 42.94 |
| 1893 | 42.93 |
| 1894 | 42.92 |
| 1895 | 42.9 |
| 1896 | 42.9 |
| 1897 | 42.89 |
| 1898 | 42.87 |
| 1899 | 42.87 |
| 1900 | 42.87 |
| 1901 | 42.86 |
| 1902 | 42.86 |
| 1903 | 42.84 |
| 1904 | 42.83 |
| 1905 | 42.8 |
| 1906 | 42.77 |
| 1907 | 42.75 |
| 1908 | 42.75 |
| 1909 | 42.75 |
| 1910 | 42.74 |
| 1911 | 42.72 |
| 1912 | 42.71 |
| 1913 | 42.71 |
| 1914 | 42.7 |
| 1915 | 42.7 |
| 1916 | 42.69 |
| 1917 | 42.68 |
| 1918 | 42.67 |
| 1919 | 42.66 |
| 1920 | 42.65 |
| 1921 | 42.64 |
| 1922 | 42.64 |
| 1923 | 42.63 |
| 1924 | 42.62 |
| 1925 | 42.62 |
| 1926 | 42.62 |
| 1927 | 42.62 |
| 1928 | 42.62 |
| 1929 | 42.61 |
| 1930 | 42.6 |
| 1931 | 42.58 |
| 1932 | 42.56 |
| 1933 | 42.56 |
| 1934 | 42.56 |
| 1935 | 42.55 |
| 1936 | 42.55 |
| 1937 | 42.55 |
| 1938 | 42.55 |
| 1939 | 42.55 |
| 1940 | 42.54 |
| 1941 | 42.52 |
| 1942 | 42.52 |
| 1943 | 42.51 |
| 1944 | 42.51 |
| 1945 | 42.5 |
| 1946 | 42.5 |
| 1947 | 42.48 |
| 1948 | 42.48 |
| 1949 | 42.48 |
| 1950 | 42.47 |
| 1951 | 42.46 |
| 1952 | 42.45 |
| 1953 | 42.44 |
| 1954 | 42.41 |
| 1955 | 42.41 |
| 1956 | 42.4 |
| 1957 | 42.4 |
| 1958 | 42.4 |
| 1959 | 42.4 |
| 1960 | 42.36 |
| 1961 | 42.36 |
| 1962 | 42.33 |
| 1963 | 42.33 |
| 1964 | 42.33 |
| 1965 | 42.32 |
| 1966 | 42.32 |
| 1967 | 42.32 |
| 1968 | 42.31 |
| 1969 | 42.31 |
| 1970 | 42.3 |
| 1971 | 42.3 |
| 1972 | 42.29 |
| 1973 | 42.29 |
| 1974 | 42.28 |
| 1975 | 42.28 |
| 1976 | 42.27 |
| 1977 | 42.27 |
| 1978 | 42.24 |
| 1979 | 42.23 |
| 1980 | 42.23 |
| 1981 | 42.23 |
| 1982 | 42.23 |
| 1983 | 42.22 |
| 1984 | 42.22 |
| 1985 | 42.21 |
| 1986 | 42.2 |
| 1987 | 42.19 |
| 1988 | 42.19 |
| 1989 | 42.18 |
| 1990 | 42.18 |
| 1991 | 42.18 |
| 1992 | 42.16 |
| 1993 | 42.15 |
| 1994 | 42.14 |
| 1995 | 42.14 |
| 1996 | 42.11 |
| 1997 | 42.09 |
| 1998 | 42.08 |
| 1999 | 42.08 |
| 2000 | 42.07 |
| 2001 | 42.07 |
| 2002 | 42.07 |
| 2003 | 42.05 |
| 2004 | 42.04 |
| 2005 | 42.03 |
| 2006 | 42.03 |
| 2007 | 42.02 |
| 2008 | 42.02 |
| 2009 | 42.01 |
| 2010 | 42 |
| 2011 | 42 |
| 2012 | 42 |
| 2013 | 41.99 |
| 2014 | 41.98 |
| 2015 | 41.98 |
| 2016 | 41.98 |
| 2017 | 41.97 |
| 2018 | 41.97 |
| 2019 | 41.96 |
| 2020 | 41.96 |
| 2021 | 41.96 |
| 2022 | 41.94 |
| 2023 | 41.94 |
| 2024 | 41.94 |
| 2025 | 41.93 |
| 2026 | 41.92 |
| 2027 | 41.91 |
| 2028 | 41.91 |
| 2029 | 41.9 |
| 2030 | 41.9 |
| 2031 | 41.88 |
| 2032 | 41.87 |
| 2033 | 41.86 |
| 2034 | 41.85 |
| 2035 | 41.85 |
| 2036 | 41.84 |
| 2037 | 41.83 |
| 2038 | 41.83 |
| 2039 | 41.83 |
| 2040 | 41.82 |
| 2041 | 41.82 |
| 2042 | 41.81 |
| 2043 | 41.81 |
| 2044 | 41.8 |
| 2045 | 41.8 |
| 2046 | 41.79 |
| 2047 | 41.77 |
| 2048 | 41.77 |
| 2049 | 41.77 |
| 2050 | 41.77 |
| 2051 | 41.77 |
| 2052 | 41.76 |
| 2053 | 41.76 |
| 2054 | 41.76 |
| 2055 | 41.75 |
| 2056 | 41.75 |
| 2057 | 41.75 |
| 2058 | 41.74 |
| 2059 | 41.74 |
| 2060 | 41.74 |
| 2061 | 41.73 |
| 2062 | 41.73 |
| 2063 | 41.73 |
| 2064 | 41.72 |
| 2065 | 41.71 |
| 2066 | 41.69 |
| 2067 | 41.68 |
| 2068 | 41.68 |
| 2069 | 41.68 |
| 2070 | 41.67 |
| 2071 | 41.67 |
| 2072 | 41.66 |
| 2073 | 41.66 |
| 2074 | 41.65 |
| 2075 | 41.65 |
| 2076 | 41.64 |
| 2077 | 41.64 |
| 2078 | 41.64 |
| 2079 | 41.63 |
| 2080 | 41.63 |
| 2081 | 41.62 |
| 2082 | 41.61 |
| 2083 | 41.61 |
| 2084 | 41.61 |
| 2085 | 41.6 |
| 2086 | 41.6 |
| 2087 | 41.58 |
| 2088 | 41.57 |
| 2089 | 41.57 |
| 2090 | 41.56 |
| 2091 | 41.55 |
| 2092 | 41.55 |
| 2093 | 41.54 |
| 2094 | 41.54 |
| 2095 | 41.53 |
| 2096 | 41.53 |
| 2097 | 41.53 |
| 2098 | 41.52 |
| 2099 | 41.52 |
| 2100 | 41.52 |
| 2101 | 41.52 |
| 2102 | 41.5 |
| 2103 | 41.49 |
| 2104 | 41.48 |
| 2105 | 41.48 |
| 2106 | 41.48 |
| 2107 | 41.47 |
| 2108 | 41.46 |
| 2109 | 41.46 |
| 2110 | 41.46 |
| 2111 | 41.45 |
| 2112 | 41.45 |
| 2113 | 41.44 |
| 2114 | 41.44 |
| 2115 | 41.44 |
| 2116 | 41.44 |
| 2117 | 41.43 |
| 2118 | 41.43 |
| 2119 | 41.42 |
| 2120 | 41.42 |
| 2121 | 41.41 |
| 2122 | 41.41 |
| 2123 | 41.4 |
| 2124 | 41.39 |
| 2125 | 41.38 |
| 2126 | 41.38 |
| 2127 | 41.37 |
| 2128 | 41.37 |
| 2129 | 41.37 |
| 2130 | 41.36 |
| 2131 | 41.36 |
| 2132 | 41.36 |
| 2133 | 41.36 |
| 2134 | 41.35 |
| 2135 | 41.35 |
| 2136 | 41.34 |
| 2137 | 41.34 |
| 2138 | 41.34 |
| 2139 | 41.33 |
| 2140 | 41.32 |
| 2141 | 41.31 |
| 2142 | 41.31 |
| 2143 | 41.31 |
| 2144 | 41.3 |
| 2145 | 41.3 |
| 2146 | 41.29 |
| 2147 | 41.29 |
| 2148 | 41.29 |
| 2149 | 41.29 |
| 2150 | 41.29 |
| 2151 | 41.28 |
| 2152 | 41.28 |
| 2153 | 41.27 |
| 2154 | 41.27 |
| 2155 | 41.26 |
| 2156 | 41.25 |
| 2157 | 41.25 |
| 2158 | 41.25 |
| 2159 | 41.25 |
| 2160 | 41.24 |
| 2161 | 41.23 |
| 2162 | 41.23 |
| 2163 | 41.23 |
| 2164 | 41.22 |
| 2165 | 41.22 |
| 2166 | 41.22 |
| 2167 | 41.21 |
| 2168 | 41.21 |
| 2169 | 41.2 |
| 2170 | 41.2 |
| 2171 | 41.19 |
| 2172 | 41.18 |
| 2173 | 41.18 |
| 2174 | 41.17 |
| 2175 | 41.17 |
| 2176 | 41.17 |
| 2177 | 41.17 |
| 2178 | 41.15 |
| 2179 | 41.15 |
| 2180 | 41.15 |
| 2181 | 41.14 |
| 2182 | 41.14 |
| 2183 | 41.14 |
| 2184 | 41.11 |
| 2185 | 41.11 |
| 2186 | 41.1 |
| 2187 | 41.09 |
| 2188 | 41.09 |
| 2189 | 41.09 |
| 2190 | 41.08 |
| 2191 | 41.08 |
| 2192 | 41.08 |
| 2193 | 41.07 |
| 2194 | 41.07 |
| 2195 | 41.06 |
| 2196 | 41.06 |
| 2197 | 41.06 |
| 2198 | 41.06 |
| 2199 | 41.03 |
| 2200 | 41.03 |
| 2201 | 41.03 |
| 2202 | 41.02 |
| 2203 | 41.02 |
| 2204 | 41.02 |
| 2205 | 41.02 |
| 2206 | 41.02 |
| 2207 | 41.01 |
| 2208 | 41.01 |
| 2209 | 41 |
| 2210 | 41 |
| 2211 | 40.99 |
| 2212 | 40.99 |
| 2213 | 40.99 |
| 2214 | 40.98 |
| 2215 | 40.98 |
| 2216 | 40.98 |
| 2217 | 40.98 |
| 2218 | 40.97 |
| 2219 | 40.97 |
| 2220 | 40.96 |
| 2221 | 40.96 |
| 2222 | 40.95 |
| 2223 | 40.95 |
| 2224 | 40.93 |
| 2225 | 40.93 |
| 2226 | 40.93 |
| 2227 | 40.93 |
| 2228 | 40.93 |
| 2229 | 40.91 |
| 2230 | 40.91 |
| 2231 | 40.9 |
| 2232 | 40.9 |
| 2233 | 40.9 |
| 2234 | 40.89 |
| 2235 | 40.89 |
| 2236 | 40.89 |
| 2237 | 40.89 |
| 2238 | 40.88 |
| 2239 | 40.88 |
| 2240 | 40.88 |
| 2241 | 40.87 |
| 2242 | 40.86 |
| 2243 | 40.84 |
| 2244 | 40.84 |
| 2245 | 40.84 |
| 2246 | 40.83 |
| 2247 | 40.83 |
| 2248 | 40.83 |
| 2249 | 40.83 |
| 2250 | 40.82 |
| 2251 | 40.82 |
| 2252 | 40.82 |
| 2253 | 40.81 |
| 2254 | 40.81 |
| 2255 | 40.81 |
| 2256 | 40.8 |
| 2257 | 40.79 |
| 2258 | 40.78 |
| 2259 | 40.78 |
| 2260 | 40.77 |
| 2261 | 40.77 |
| 2262 | 40.76 |
| 2263 | 40.76 |
| 2264 | 40.76 |
| 2265 | 40.75 |
| 2266 | 40.75 |
| 2267 | 40.75 |
| 2268 | 40.73 |
| 2269 | 40.73 |
| 2270 | 40.73 |
| 2271 | 40.72 |
| 2272 | 40.71 |
| 2273 | 40.7 |
| 2274 | 40.7 |
| 2275 | 40.69 |
| 2276 | 40.69 |
| 2277 | 40.68 |
| 2278 | 40.68 |
| 2279 | 40.67 |
| 2280 | 40.65 |
| 2281 | 40.64 |
| 2282 | 40.64 |
| 2283 | 40.64 |
| 2284 | 40.64 |
| 2285 | 40.63 |
| 2286 | 40.63 |
| 2287 | 40.62 |
| 2288 | 40.61 |
| 2289 | 40.6 |
| 2290 | 40.6 |
| 2291 | 40.6 |
| 2292 | 40.6 |
| 2293 | 40.59 |
| 2294 | 40.59 |
| 2295 | 40.58 |
| 2296 | 40.58 |
| 2297 | 40.57 |
| 2298 | 40.56 |
| 2299 | 40.55 |
| 2300 | 40.55 |
| 2301 | 40.54 |
| 2302 | 40.54 |
| 2303 | 40.54 |
| 2304 | 40.54 |
| 2305 | 40.53 |
| 2306 | 40.53 |
| 2307 | 40.52 |
| 2308 | 40.52 |
| 2309 | 40.52 |
| 2310 | 40.51 |
| 2311 | 40.5 |
| 2312 | 40.5 |
| 2313 | 40.49 |
| 2314 | 40.49 |
| 2315 | 40.49 |
| 2316 | 40.48 |
| 2317 | 40.47 |
| 2318 | 40.47 |
| 2319 | 40.47 |
| 2320 | 40.46 |
| 2321 | 40.46 |
| 2322 | 40.45 |
| 2323 | 40.43 |
| 2324 | 40.42 |
| 2325 | 40.42 |
| 2326 | 40.42 |
| 2327 | 40.41 |
| 2328 | 40.41 |
| 2329 | 40.41 |
| 2330 | 40.4 |
| 2331 | 40.38 |
| 2332 | 40.38 |
| 2333 | 40.38 |
| 2334 | 40.36 |
| 2335 | 40.36 |
| 2336 | 40.35 |
| 2337 | 40.33 |
| 2338 | 40.32 |
| 2339 | 40.32 |
| 2340 | 40.31 |
| 2341 | 40.31 |
| 2342 | 40.31 |
| 2343 | 40.31 |
| 2344 | 40.29 |
| 2345 | 40.29 |
| 2346 | 40.29 |
| 2347 | 40.29 |
| 2348 | 40.28 |
| 2349 | 40.26 |
| 2350 | 40.26 |
| 2351 | 40.26 |
| 2352 | 40.25 |
| 2353 | 40.25 |
| 2354 | 40.25 |
| 2355 | 40.25 |
| 2356 | 40.25 |
| 2357 | 40.25 |
| 2358 | 40.25 |
| 2359 | 40.25 |
| 2360 | 40.23 |
| 2361 | 40.2 |
| 2362 | 40.17 |
| 2363 | 40.17 |
| 2364 | 40.15 |
| 2365 | 40.15 |
| 2366 | 40.14 |
| 2367 | 40.14 |
| 2368 | 40.13 |
| 2369 | 40.13 |
| 2370 | 40.13 |
| 2371 | 40.12 |
| 2372 | 40.12 |
| 2373 | 40.12 |
| 2374 | 40.12 |
| 2375 | 40.11 |
| 2376 | 40.09 |
| 2377 | 40.09 |
| 2378 | 40.09 |
| 2379 | 40.09 |
| 2380 | 40.08 |
| 2381 | 40.08 |
| 2382 | 40.07 |
| 2383 | 40.07 |
| 2384 | 40.07 |
| 2385 | 40.06 |
| 2386 | 40.05 |
| 2387 | 40.04 |
| 2388 | 40.04 |
| 2389 | 40.03 |
| 2390 | 40.02 |
| 2391 | 40.01 |
| 2392 | 40 |
| 2393 | 40 |
| 2394 | 39.99 |
| 2395 | 39.99 |
| 2396 | 39.98 |
| 2397 | 39.98 |
| 2398 | 39.96 |
| 2399 | 39.96 |
| 2400 | 39.95 |
| 2401 | 39.95 |
| 2402 | 39.95 |
| 2403 | 39.93 |
| 2404 | 39.92 |
| 2405 | 39.92 |
| 2406 | 39.92 |
| 2407 | 39.91 |
| 2408 | 39.91 |
| 2409 | 39.91 |
| 2410 | 39.91 |
| 2411 | 39.9 |
| 2412 | 39.9 |
| 2413 | 39.9 |
| 2414 | 39.89 |
| 2415 | 39.89 |
| 2416 | 39.88 |
| 2417 | 39.88 |
| 2418 | 39.87 |
| 2419 | 39.87 |
| 2420 | 39.86 |
| 2421 | 39.86 |
| 2422 | 39.86 |
| 2423 | 39.86 |
| 2424 | 39.86 |
| 2425 | 39.85 |
| 2426 | 39.85 |
| 2427 | 39.84 |
| 2428 | 39.84 |
| 2429 | 39.84 |
| 2430 | 39.84 |
| 2431 | 39.83 |
| 2432 | 39.82 |
| 2433 | 39.82 |
| 2434 | 39.82 |
| 2435 | 39.82 |
| 2436 | 39.82 |
| 2437 | 39.82 |
| 2438 | 39.81 |
| 2439 | 39.81 |
| 2440 | 39.8 |
| 2441 | 39.8 |
| 2442 | 39.79 |
| 2443 | 39.78 |
| 2444 | 39.78 |
| 2445 | 39.78 |
| 2446 | 39.78 |
| 2447 | 39.78 |
| 2448 | 39.77 |
| 2449 | 39.75 |
| 2450 | 39.75 |
| 2451 | 39.75 |
| 2452 | 39.75 |
| 2453 | 39.75 |
| 2454 | 39.74 |
| 2455 | 39.73 |
| 2456 | 39.73 |
| 2457 | 39.72 |
| 2458 | 39.72 |
| 2459 | 39.72 |
| 2460 | 39.72 |
| 2461 | 39.71 |
| 2462 | 39.71 |
| 2463 | 39.71 |
| 2464 | 39.7 |
| 2465 | 39.7 |
| 2466 | 39.68 |
| 2467 | 39.68 |
| 2468 | 39.67 |
| 2469 | 39.67 |
| 2470 | 39.66 |
| 2471 | 39.66 |
| 2472 | 39.65 |
| 2473 | 39.65 |
| 2474 | 39.64 |
| 2475 | 39.64 |
| 2476 | 39.63 |
| 2477 | 39.63 |
| 2478 | 39.63 |
| 2479 | 39.63 |
| 2480 | 39.61 |
| 2481 | 39.6 |
| 2482 | 39.59 |
| 2483 | 39.59 |
| 2484 | 39.58 |
| 2485 | 39.58 |
| 2486 | 39.58 |
| 2487 | 39.58 |
| 2488 | 39.57 |
| 2489 | 39.57 |
| 2490 | 39.55 |
| 2491 | 39.54 |
| 2492 | 39.53 |
| 2493 | 39.52 |
| 2494 | 39.52 |
| 2495 | 39.51 |
| 2496 | 39.5 |
| 2497 | 39.5 |
| 2498 | 39.5 |
| 2499 | 39.5 |
| 2500 | 39.5 |
| 2501 | 39.5 |
| 2502 | 39.5 |
| 2503 | 39.5 |
| 2504 | 39.5 |
| 2505 | 39.5 |
| 2506 | 39.5 |
| 2507 | 39.5 |
| 2508 | 39.5 |
| 2509 | 39.5 |
| 2510 | 39.5 |
| 2511 | 39.5 |
| 2512 | 39.5 |
| 2513 | 39.5 |
| 2514 | 39.5 |
| 2515 | 39.5 |
| 2516 | 39.49 |
| 2517 | 39.49 |
| 2518 | 39.49 |
| 2519 | 39.49 |
| 2520 | 39.48 |
| 2521 | 39.47 |
| 2522 | 39.46 |
| 2523 | 39.46 |
| 2524 | 39.45 |
| 2525 | 39.45 |
| 2526 | 39.45 |
| 2527 | 39.44 |
| 2528 | 39.44 |
| 2529 | 39.43 |
| 2530 | 39.42 |
| 2531 | 39.42 |
| 2532 | 39.41 |
| 2533 | 39.4 |
| 2534 | 39.4 |
| 2535 | 39.39 |
| 2536 | 39.35 |
| 2537 | 39.34 |
| 2538 | 39.34 |
| 2539 | 39.33 |
| 2540 | 39.33 |
| 2541 | 39.32 |
| 2542 | 39.3 |
| 2543 | 39.3 |
| 2544 | 39.3 |
| 2545 | 39.29 |
| 2546 | 39.28 |
| 2547 | 39.27 |
| 2548 | 39.27 |
| 2549 | 39.27 |
| 2550 | 39.25 |
| 2551 | 39.25 |
| 2552 | 39.25 |
| 2553 | 39.25 |
| 2554 | 39.25 |
| 2555 | 39.25 |
| 2556 | 39.25 |
| 2557 | 39.25 |
| 2558 | 39.25 |
| 2559 | 39.24 |
| 2560 | 39.24 |
| 2561 | 39.24 |
| 2562 | 39.23 |
| 2563 | 39.23 |
| 2564 | 39.23 |
| 2565 | 39.22 |
| 2566 | 39.22 |
| 2567 | 39.22 |
| 2568 | 39.21 |
| 2569 | 39.2 |
| 2570 | 39.2 |
| 2571 | 39.2 |
| 2572 | 39.2 |
| 2573 | 39.2 |
| 2574 | 39.19 |
| 2575 | 39.18 |
| 2576 | 39.18 |
| 2577 | 39.17 |
| 2578 | 39.17 |
| 2579 | 39.16 |
| 2580 | 39.16 |
| 2581 | 39.16 |
| 2582 | 39.15 |
| 2583 | 39.15 |
| 2584 | 39.14 |
| 2585 | 39.13 |
| 2586 | 39.12 |
| 2587 | 39.12 |
| 2588 | 39.12 |
| 2589 | 39.11 |
| 2590 | 39.11 |
| 2591 | 39.11 |
| 2592 | 39.11 |
| 2593 | 39.1 |
| 2594 | 39.1 |
| 2595 | 39.1 |
| 2596 | 39.1 |
| 2597 | 39.09 |
| 2598 | 39.09 |
| 2599 | 39.08 |
| 2600 | 39.07 |
| 2601 | 39.06 |
| 2602 | 39.06 |
| 2603 | 39.04 |
| 2604 | 39.03 |
| 2605 | 39.03 |
| 2606 | 39.03 |
| 2607 | 39.03 |
| 2608 | 39.01 |
| 2609 | 39.01 |
| 2610 | 39.01 |
| 2611 | 39.01 |
| 2612 | 39 |
| 2613 | 39 |
| 2614 | 39 |
| 2615 | 39 |
| 2616 | 39 |
| 2617 | 38.99 |
| 2618 | 38.99 |
| 2619 | 38.98 |
| 2620 | 38.98 |
| 2621 | 38.97 |
| 2622 | 38.97 |
| 2623 | 38.96 |
| 2624 | 38.96 |
| 2625 | 38.94 |
| 2626 | 38.94 |
| 2627 | 38.94 |
| 2628 | 38.94 |
| 2629 | 38.93 |
| 2630 | 38.92 |
| 2631 | 38.92 |
| 2632 | 38.9 |
| 2633 | 38.9 |
| 2634 | 38.88 |
| 2635 | 38.88 |
| 2636 | 38.87 |
| 2637 | 38.87 |
| 2638 | 38.86 |
| 2639 | 38.86 |
| 2640 | 38.86 |
| 2641 | 38.85 |
| 2642 | 38.84 |
| 2643 | 38.84 |
| 2644 | 38.84 |
| 2645 | 38.84 |
| 2646 | 38.83 |
| 2647 | 38.82 |
| 2648 | 38.81 |
| 2649 | 38.8 |
| 2650 | 38.79 |
| 2651 | 38.78 |
| 2652 | 38.77 |
| 2653 | 38.77 |
| 2654 | 38.76 |
| 2655 | 38.76 |
| 2656 | 38.76 |
| 2657 | 38.75 |
| 2658 | 38.75 |
| 2659 | 38.75 |
| 2660 | 38.75 |
| 2661 | 38.75 |
| 2662 | 38.75 |
| 2663 | 38.75 |
| 2664 | 38.75 |
| 2665 | 38.75 |
| 2666 | 38.74 |
| 2667 | 38.73 |
| 2668 | 38.73 |
| 2669 | 38.72 |
| 2670 | 38.71 |
| 2671 | 38.71 |
| 2672 | 38.71 |
| 2673 | 38.7 |
| 2674 | 38.7 |
| 2675 | 38.7 |
| 2676 | 38.69 |
| 2677 | 38.68 |
| 2678 | 38.68 |
| 2679 | 38.68 |
| 2680 | 38.68 |
| 2681 | 38.67 |
| 2682 | 38.66 |
| 2683 | 38.66 |
| 2684 | 38.65 |
| 2685 | 38.65 |
| 2686 | 38.64 |
| 2687 | 38.64 |
| 2688 | 38.64 |
| 2689 | 38.64 |
| 2690 | 38.63 |
| 2691 | 38.63 |
| 2692 | 38.63 |
| 2693 | 38.63 |
| 2694 | 38.62 |
| 2695 | 38.62 |
| 2696 | 38.61 |
| 2697 | 38.6 |
| 2698 | 38.6 |
| 2699 | 38.6 |
| 2700 | 38.6 |
| 2701 | 38.59 |
| 2702 | 38.59 |
| 2703 | 38.58 |
| 2704 | 38.58 |
| 2705 | 38.58 |
| 2706 | 38.58 |
| 2707 | 38.58 |
| 2708 | 38.57 |
| 2709 | 38.57 |
| 2710 | 38.56 |
| 2711 | 38.55 |
| 2712 | 38.55 |
| 2713 | 38.55 |
| 2714 | 38.54 |
| 2715 | 38.54 |
| 2716 | 38.54 |
| 2717 | 38.52 |
| 2718 | 38.52 |
| 2719 | 38.52 |
| 2720 | 38.51 |
| 2721 | 38.51 |
| 2722 | 38.51 |
| 2723 | 38.51 |
| 2724 | 38.51 |
| 2725 | 38.51 |
| 2726 | 38.5 |
| 2727 | 38.5 |
| 2728 | 38.5 |
| 2729 | 38.5 |
| 2730 | 38.5 |
| 2731 | 38.5 |
| 2732 | 38.5 |
| 2733 | 38.5 |
| 2734 | 38.5 |
| 2735 | 38.5 |
| 2736 | 38.5 |
| 2737 | 38.5 |
| 2738 | 38.49 |
| 2739 | 38.48 |
| 2740 | 38.48 |
| 2741 | 38.46 |
| 2742 | 38.46 |
| 2743 | 38.45 |
| 2744 | 38.45 |
| 2745 | 38.44 |
| 2746 | 38.43 |
| 2747 | 38.43 |
| 2748 | 38.42 |
| 2749 | 38.41 |
| 2750 | 38.4 |
| 2751 | 38.39 |
| 2752 | 38.39 |
| 2753 | 38.39 |
| 2754 | 38.38 |
| 2755 | 38.38 |
| 2756 | 38.38 |
| 2757 | 38.38 |
| 2758 | 38.37 |
| 2759 | 38.37 |
| 2760 | 38.36 |
| 2761 | 38.36 |
| 2762 | 38.35 |
| 2763 | 38.35 |
| 2764 | 38.34 |
| 2765 | 38.34 |
| 2766 | 38.34 |
| 2767 | 38.34 |
| 2768 | 38.34 |
| 2769 | 38.33 |
| 2770 | 38.33 |
| 2771 | 38.32 |
| 2772 | 38.31 |
| 2773 | 38.31 |
| 2774 | 38.3 |
| 2775 | 38.28 |
| 2776 | 38.27 |
| 2777 | 38.27 |
| 2778 | 38.26 |
| 2779 | 38.26 |
| 2780 | 38.26 |
| 2781 | 38.26 |
| 2782 | 38.26 |
| 2783 | 38.25 |
| 2784 | 38.25 |
| 2785 | 38.25 |
| 2786 | 38.25 |
| 2787 | 38.25 |
| 2788 | 38.25 |
| 2789 | 38.25 |
| 2790 | 38.25 |
| 2791 | 38.25 |
| 2792 | 38.25 |
| 2793 | 38.25 |
| 2794 | 38.25 |
| 2795 | 38.25 |
| 2796 | 38.25 |
| 2797 | 38.25 |
| 2798 | 38.25 |
| 2799 | 38.25 |
| 2800 | 38.25 |
| 2801 | 38.25 |
| 2802 | 38.25 |
| 2803 | 38.25 |
| 2804 | 38.25 |
| 2805 | 38.25 |
| 2806 | 38.25 |
| 2807 | 38.25 |
| 2808 | 38.25 |
| 2809 | 38.25 |
| 2810 | 38.25 |
| 2811 | 38.25 |
| 2812 | 38.25 |
| 2813 | 38.25 |
| 2814 | 38.25 |
| 2815 | 38.25 |
| 2816 | 38.24 |
| 2817 | 38.24 |
| 2818 | 38.24 |
| 2819 | 38.23 |
| 2820 | 38.23 |
| 2821 | 38.23 |
| 2822 | 38.23 |
| 2823 | 38.23 |
| 2824 | 38.21 |
| 2825 | 38.21 |
| 2826 | 38.2 |
| 2827 | 38.2 |
| 2828 | 38.2 |
| 2829 | 38.2 |
| 2830 | 38.2 |
| 2831 | 38.2 |
| 2832 | 38.2 |
| 2833 | 38.19 |
| 2834 | 38.19 |
| 2835 | 38.19 |
| 2836 | 38.18 |
| 2837 | 38.17 |
| 2838 | 38.17 |
| 2839 | 38.16 |
| 2840 | 38.14 |
| 2841 | 38.13 |
| 2842 | 38.12 |
| 2843 | 38.12 |
| 2844 | 38.12 |
| 2845 | 38.11 |
| 2846 | 38.11 |
| 2847 | 38.11 |
| 2848 | 38.1 |
| 2849 | 38.1 |
| 2850 | 38.1 |
| 2851 | 38.09 |
| 2852 | 38.09 |
| 2853 | 38.09 |
| 2854 | 38.07 |
| 2855 | 38.07 |
| 2856 | 38.07 |
| 2857 | 38.07 |
| 2858 | 38.05 |
| 2859 | 38.05 |
| 2860 | 38.05 |
| 2861 | 38.05 |
| 2862 | 38.05 |
| 2863 | 38.05 |
| 2864 | 38.05 |
| 2865 | 38.05 |
| 2866 | 38.05 |
| 2867 | 38.03 |
| 2868 | 38.03 |
| 2869 | 38.02 |
| 2870 | 38.01 |
| 2871 | 38.01 |
| 2872 | 38.01 |
| 2873 | 38 |
| 2874 | 38 |
| 2875 | 37.99 |
| 2876 | 37.99 |
| 2877 | 37.99 |
| 2878 | 37.98 |
| 2879 | 37.98 |
| 2880 | 37.96 |
| 2881 | 37.95 |
| 2882 | 37.94 |
| 2883 | 37.94 |
| 2884 | 37.93 |
| 2885 | 37.92 |
| 2886 | 37.92 |
| 2887 | 37.91 |
| 2888 | 37.91 |
| 2889 | 37.9 |
| 2890 | 37.89 |
| 2891 | 37.89 |
| 2892 | 37.89 |
| 2893 | 37.88 |
| 2894 | 37.88 |
| 2895 | 37.87 |
| 2896 | 37.87 |
| 2897 | 37.86 |
| 2898 | 37.86 |
| 2899 | 37.86 |
| 2900 | 37.85 |
| 2901 | 37.85 |
| 2902 | 37.84 |
| 2903 | 37.84 |
| 2904 | 37.84 |
| 2905 | 37.82 |
| 2906 | 37.81 |
| 2907 | 37.81 |
| 2908 | 37.81 |
| 2909 | 37.81 |
| 2910 | 37.8 |
| 2911 | 37.79 |
| 2912 | 37.79 |
| 2913 | 37.79 |
| 2914 | 37.79 |
| 2915 | 37.78 |
| 2916 | 37.77 |
| 2917 | 37.76 |
| 2918 | 37.76 |
| 2919 | 37.76 |
| 2920 | 37.75 |
| 2921 | 37.75 |
| 2922 | 37.75 |
| 2923 | 37.75 |
| 2924 | 37.75 |
| 2925 | 37.75 |
| 2926 | 37.75 |
| 2927 | 37.74 |
| 2928 | 37.74 |
| 2929 | 37.73 |
| 2930 | 37.73 |
| 2931 | 37.73 |
| 2932 | 37.72 |
| 2933 | 37.72 |
| 2934 | 37.72 |
| 2935 | 37.71 |
| 2936 | 37.7 |
| 2937 | 37.7 |
| 2938 | 37.7 |
| 2939 | 37.7 |
| 2940 | 37.69 |
| 2941 | 37.69 |
| 2942 | 37.69 |
| 2943 | 37.69 |
| 2944 | 37.69 |
| 2945 | 37.68 |
| 2946 | 37.68 |
| 2947 | 37.67 |
| 2948 | 37.67 |
| 2949 | 37.67 |
| 2950 | 37.66 |
| 2951 | 37.65 |
| 2952 | 37.65 |
| 2953 | 37.65 |
| 2954 | 37.64 |
| 2955 | 37.64 |
| 2956 | 37.64 |
| 2957 | 37.63 |
| 2958 | 37.63 |
| 2959 | 37.63 |
| 2960 | 37.63 |
| 2961 | 37.62 |
| 2962 | 37.62 |
| 2963 | 37.62 |
| 2964 | 37.61 |
| 2965 | 37.61 |
| 2966 | 37.61 |
| 2967 | 37.61 |
| 2968 | 37.6 |
| 2969 | 37.6 |
| 2970 | 37.6 |
| 2971 | 37.59 |
| 2972 | 37.59 |
| 2973 | 37.59 |
| 2974 | 37.59 |
| 2975 | 37.59 |
| 2976 | 37.57 |
| 2977 | 37.56 |
| 2978 | 37.56 |
| 2979 | 37.56 |
| 2980 | 37.55 |
| 2981 | 37.55 |
| 2982 | 37.54 |
| 2983 | 37.54 |
| 2984 | 37.54 |
| 2985 | 37.54 |
| 2986 | 37.53 |
| 2987 | 37.53 |
| 2988 | 37.53 |
| 2989 | 37.52 |
| 2990 | 37.52 |
| 2991 | 37.51 |
| 2992 | 37.51 |
| 2993 | 37.5 |
| 2994 | 37.5 |
| 2995 | 37.49 |
| 2996 | 37.49 |
| 2997 | 37.48 |
| 2998 | 37.48 |
| 2999 | 37.48 |
| 3000 | 37.48 |
| 3001 | 37.47 |
| 3002 | 37.47 |
| 3003 | 37.46 |
| 3004 | 37.46 |
| 3005 | 37.46 |
| 3006 | 37.46 |
| 3007 | 37.45 |
| 3008 | 37.45 |
| 3009 | 37.44 |
| 3010 | 37.44 |
| 3011 | 37.43 |
| 3012 | 37.43 |
| 3013 | 37.43 |
| 3014 | 37.43 |
| 3015 | 37.42 |
| 3016 | 37.42 |
| 3017 | 37.42 |
| 3018 | 37.41 |
| 3019 | 37.41 |
| 3020 | 37.4 |
| 3021 | 37.4 |
| 3022 | 37.4 |
| 3023 | 37.4 |
| 3024 | 37.39 |
| 3025 | 37.38 |
| 3026 | 37.38 |
| 3027 | 37.37 |
| 3028 | 37.37 |
| 3029 | 37.36 |
| 3030 | 37.35 |
| 3031 | 37.35 |
| 3032 | 37.34 |
| 3033 | 37.34 |
| 3034 | 37.34 |
| 3035 | 37.34 |
| 3036 | 37.32 |
| 3037 | 37.32 |
| 3038 | 37.32 |
| 3039 | 37.31 |
| 3040 | 37.31 |
| 3041 | 37.3 |
| 3042 | 37.3 |
| 3043 | 37.29 |
| 3044 | 37.29 |
| 3045 | 37.29 |
| 3046 | 37.29 |
| 3047 | 37.29 |
| 3048 | 37.29 |
| 3049 | 37.29 |
| 3050 | 37.28 |
| 3051 | 37.28 |
| 3052 | 37.28 |
| 3053 | 37.28 |
| 3054 | 37.28 |
| 3055 | 37.28 |
| 3056 | 37.28 |
| 3057 | 37.28 |
| 3058 | 37.28 |
| 3059 | 37.28 |
| 3060 | 37.28 |
| 3061 | 37.28 |
| 3062 | 37.28 |
| 3063 | 37.28 |
| 3064 | 37.28 |
| 3065 | 37.28 |
| 3066 | 37.28 |
| 3067 | 37.28 |
| 3068 | 37.28 |
| 3069 | 37.28 |
| 3070 | 37.28 |
| 3071 | 37.28 |
| 3072 | 37.28 |
| 3073 | 37.28 |
| 3074 | 37.28 |
| 3075 | 37.28 |
| 3076 | 37.28 |
| 3077 | 37.27 |
| 3078 | 37.27 |
| 3079 | 37.27 |
| 3080 | 37.27 |
| 3081 | 37.26 |
| 3082 | 37.26 |
| 3083 | 37.26 |
| 3084 | 37.26 |
| 3085 | 37.26 |
| 3086 | 37.26 |
| 3087 | 37.26 |
| 3088 | 37.26 |
| 3089 | 37.26 |
| 3090 | 37.26 |
| 3091 | 37.26 |
| 3092 | 37.26 |
| 3093 | 37.26 |
| 3094 | 37.26 |
| 3095 | 37.26 |
| 3096 | 37.26 |
| 3097 | 37.26 |
| 3098 | 37.26 |
| 3099 | 37.26 |
| 3100 | 37.26 |
| 3101 | 37.26 |
| 3102 | 37.26 |
| 3103 | 37.26 |
| 3104 | 37.26 |
| 3105 | 37.26 |
| 3106 | 37.26 |
| 3107 | 37.26 |
| 3108 | 37.26 |
| 3109 | 37.26 |
| 3110 | 37.26 |
| 3111 | 37.26 |
| 3112 | 37.26 |
| 3113 | 37.26 |
| 3114 | 37.26 |
| 3115 | 37.26 |
| 3116 | 37.26 |
| 3117 | 37.26 |
| 3118 | 37.26 |
| 3119 | 37.26 |
| 3120 | 37.26 |
| 3121 | 37.26 |
| 3122 | 37.26 |
| 3123 | 37.26 |
| 3124 | 37.26 |
| 3125 | 37.26 |
| 3126 | 37.26 |
| 3127 | 37.26 |
| 3128 | 37.26 |
| 3129 | 37.26 |
| 3130 | 37.26 |
| 3131 | 37.26 |
| 3132 | 37.26 |
| 3133 | 37.26 |
| 3134 | 37.26 |
| 3135 | 37.26 |
| 3136 | 37.26 |
| 3137 | 37.26 |
| 3138 | 37.26 |
| 3139 | 37.26 |
| 3140 | 37.26 |
| 3141 | 37.26 |
| 3142 | 37.26 |
| 3143 | 37.26 |
| 3144 | 37.26 |
| 3145 | 37.26 |
| 3146 | 37.26 |
| 3147 | 37.26 |
| 3148 | 37.26 |
| 3149 | 37.26 |
| 3150 | 37.26 |
| 3151 | 37.26 |
| 3152 | 37.26 |
| 3153 | 37.26 |
| 3154 | 37.26 |
| 3155 | 37.26 |
| 3156 | 37.26 |
| 3157 | 37.26 |
| 3158 | 37.26 |
| 3159 | 37.26 |
| 3160 | 37.26 |
| 3161 | 37.25 |
| 3162 | 37.25 |
| 3163 | 37.25 |
| 3164 | 37.25 |
| 3165 | 37.25 |
| 3166 | 37.25 |
| 3167 | 37.25 |
| 3168 | 37.25 |
| 3169 | 37.25 |
| 3170 | 37.25 |
| 3171 | 37.25 |
| 3172 | 37.25 |
| 3173 | 37.25 |
| 3174 | 37.25 |
| 3175 | 37.25 |
| 3176 | 37.25 |
| 3177 | 37.25 |
| 3178 | 37.25 |
| 3179 | 37.25 |
| 3180 | 37.25 |
| 3181 | 37.25 |
| 3182 | 37.25 |
| 3183 | 37.25 |
| 3184 | 37.25 |
| 3185 | 37.25 |
| 3186 | 37.25 |
| 3187 | 37.25 |
| 3188 | 37.25 |
| 3189 | 37.25 |
| 3190 | 37.25 |
| 3191 | 37.25 |
| 3192 | 37.25 |
| 3193 | 37.25 |
| 3194 | 37.25 |
| 3195 | 37.25 |
| 3196 | 37.25 |
| 3197 | 37.25 |
| 3198 | 37.25 |
| 3199 | 37.25 |
| 3200 | 37.25 |
| 3201 | 37.25 |
| 3202 | 37.25 |
| 3203 | 37.25 |
| 3204 | 37.25 |
| 3205 | 37.25 |
| 3206 | 37.25 |
| 3207 | 37.25 |
| 3208 | 37.25 |
| 3209 | 37.25 |
| 3210 | 37.25 |
| 3211 | 37.25 |
| 3212 | 37.25 |
| 3213 | 37.25 |
| 3214 | 37.25 |
| 3215 | 37.25 |
| 3216 | 37.25 |
| 3217 | 37.25 |
| 3218 | 37.25 |
| 3219 | 37.24 |
| 3220 | 37.24 |
| 3221 | 37.24 |
| 3222 | 37.24 |
| 3223 | 37.24 |
| 3224 | 37.23 |
| 3225 | 37.23 |
| 3226 | 37.23 |
| 3227 | 37.23 |
| 3228 | 37.21 |
| 3229 | 37.21 |
| 3230 | 37.21 |
| 3231 | 37.21 |
| 3232 | 37.21 |
| 3233 | 37.21 |
| 3234 | 37.2 |
| 3235 | 37.17 |
| 3236 | 37.16 |
| 3237 | 37.16 |
| 3238 | 37.15 |
| 3239 | 37.15 |
| 3240 | 37.15 |
| 3241 | 37.14 |
| 3242 | 37.14 |
| 3243 | 37.12 |
| 3244 | 37.11 |
| 3245 | 37.1 |
| 3246 | 37.1 |
| 3247 | 37.09 |
| 3248 | 37.09 |
| 3249 | 37.09 |
| 3250 | 37.08 |
| 3251 | 37.08 |
| 3252 | 37.08 |
| 3253 | 37.07 |
| 3254 | 37.06 |
| 3255 | 37.05 |
| 3256 | 37.05 |
| 3257 | 37.05 |
| 3258 | 37.04 |
| 3259 | 37.04 |
| 3260 | 37.03 |
| 3261 | 37.03 |
| 3262 | 37.03 |
| 3263 | 37.03 |
| 3264 | 37.03 |
| 3265 | 37.02 |
| 3266 | 37.01 |
| 3267 | 37 |
| 3268 | 37 |
| 3269 | 37 |
| 3270 | 36.99 |
| 3271 | 36.98 |
| 3272 | 36.98 |
| 3273 | 36.98 |
| 3274 | 36.98 |
| 3275 | 36.98 |
| 3276 | 36.96 |
| 3277 | 36.96 |
| 3278 | 36.96 |
| 3279 | 36.96 |
| 3280 | 36.95 |
| 3281 | 36.95 |
| 3282 | 36.95 |
| 3283 | 36.95 |
| 3284 | 36.94 |
| 3285 | 36.94 |
| 3286 | 36.94 |
| 3287 | 36.93 |
| 3288 | 36.93 |
| 3289 | 36.93 |
| 3290 | 36.92 |
| 3291 | 36.92 |
| 3292 | 36.92 |
| 3293 | 36.91 |
| 3294 | 36.91 |
| 3295 | 36.9 |
| 3296 | 36.89 |
| 3297 | 36.89 |
| 3298 | 36.89 |
| 3299 | 36.89 |
| 3300 | 36.88 |
| 3301 | 36.88 |
| 3302 | 36.88 |
| 3303 | 36.88 |
| 3304 | 36.87 |
| 3305 | 36.87 |
| 3306 | 36.87 |
| 3307 | 36.86 |
| 3308 | 36.85 |
| 3309 | 36.85 |
| 3310 | 36.85 |
| 3311 | 36.85 |
| 3312 | 36.84 |
| 3313 | 36.82 |
| 3314 | 36.82 |
| 3315 | 36.82 |
| 3316 | 36.81 |
| 3317 | 36.81 |
| 3318 | 36.81 |
| 3319 | 36.8 |
| 3320 | 36.8 |
| 3321 | 36.8 |
| 3322 | 36.8 |
| 3323 | 36.8 |
| 3324 | 36.8 |
| 3325 | 36.79 |
| 3326 | 36.79 |
| 3327 | 36.79 |
| 3328 | 36.79 |
| 3329 | 36.79 |
| 3330 | 36.79 |
| 3331 | 36.78 |
| 3332 | 36.78 |
| 3333 | 36.77 |
| 3334 | 36.77 |
| 3335 | 36.77 |
| 3336 | 36.77 |
| 3337 | 36.77 |
| 3338 | 36.76 |
| 3339 | 36.76 |
| 3340 | 36.76 |
| 3341 | 36.75 |
| 3342 | 36.75 |
| 3343 | 36.74 |
| 3344 | 36.74 |
| 3345 | 36.74 |
| 3346 | 36.74 |
| 3347 | 36.74 |
| 3348 | 36.73 |
| 3349 | 36.73 |
| 3350 | 36.73 |
| 3351 | 36.72 |
| 3352 | 36.72 |
| 3353 | 36.72 |
| 3354 | 36.71 |
| 3355 | 36.7 |
| 3356 | 36.7 |
| 3357 | 36.69 |
| 3358 | 36.69 |
| 3359 | 36.68 |
| 3360 | 36.68 |
| 3361 | 36.67 |
| 3362 | 36.64 |
| 3363 | 36.64 |
| 3364 | 36.63 |
| 3365 | 36.62 |
| 3366 | 36.62 |
| 3367 | 36.61 |
| 3368 | 36.61 |
| 3369 | 36.61 |
| 3370 | 36.61 |
| 3371 | 36.61 |
| 3372 | 36.6 |
| 3373 | 36.6 |
| 3374 | 36.59 |
| 3375 | 36.59 |
| 3376 | 36.59 |
| 3377 | 36.57 |
| 3378 | 36.56 |
| 3379 | 36.56 |
| 3380 | 36.56 |
| 3381 | 36.55 |
| 3382 | 36.55 |
| 3383 | 36.54 |
| 3384 | 36.54 |
| 3385 | 36.52 |
| 3386 | 36.52 |
| 3387 | 36.51 |
| 3388 | 36.5 |
| 3389 | 36.5 |
| 3390 | 36.5 |
| 3391 | 36.5 |
| 3392 | 36.48 |
| 3393 | 36.47 |
| 3394 | 36.47 |
| 3395 | 36.47 |
| 3396 | 36.47 |
| 3397 | 36.46 |
| 3398 | 36.46 |
| 3399 | 36.46 |
| 3400 | 36.46 |
| 3401 | 36.46 |
| 3402 | 36.46 |
| 3403 | 36.45 |
| 3404 | 36.45 |
| 3405 | 36.45 |
| 3406 | 36.45 |
| 3407 | 36.44 |
| 3408 | 36.44 |
| 3409 | 36.44 |
| 3410 | 36.42 |
| 3411 | 36.42 |
| 3412 | 36.41 |
| 3413 | 36.41 |
| 3414 | 36.41 |
| 3415 | 36.4 |
| 3416 | 36.4 |
| 3417 | 36.4 |
| 3418 | 36.38 |
| 3419 | 36.38 |
| 3420 | 36.37 |
| 3421 | 36.37 |
| 3422 | 36.37 |
| 3423 | 36.36 |
| 3424 | 36.36 |
| 3425 | 36.36 |
| 3426 | 36.36 |
| 3427 | 36.35 |
| 3428 | 36.35 |
| 3429 | 36.35 |
| 3430 | 36.35 |
| 3431 | 36.35 |
| 3432 | 36.35 |
| 3433 | 36.34 |
| 3434 | 36.34 |
| 3435 | 36.34 |
| 3436 | 36.34 |
| 3437 | 36.34 |
| 3438 | 36.33 |
| 3439 | 36.33 |
| 3440 | 36.32 |
| 3441 | 36.32 |
| 3442 | 36.32 |
| 3443 | 36.32 |
| 3444 | 36.31 |
| 3445 | 36.31 |
| 3446 | 36.3 |
| 3447 | 36.29 |
| 3448 | 36.28 |
| 3449 | 36.28 |
| 3450 | 36.27 |
| 3451 | 36.26 |
| 3452 | 36.26 |
| 3453 | 36.25 |
| 3454 | 36.25 |
| 3455 | 36.23 |
| 3456 | 36.23 |
| 3457 | 36.23 |
| 3458 | 36.23 |
| 3459 | 36.22 |
| 3460 | 36.22 |
| 3461 | 36.21 |
| 3462 | 36.21 |
| 3463 | 36.2 |
| 3464 | 36.2 |
| 3465 | 36.2 |
| 3466 | 36.19 |
| 3467 | 36.19 |
| 3468 | 36.18 |
| 3469 | 36.18 |
| 3470 | 36.17 |
| 3471 | 36.16 |
| 3472 | 36.16 |
| 3473 | 36.16 |
| 3474 | 36.15 |
| 3475 | 36.15 |
| 3476 | 36.15 |
| 3477 | 36.14 |
| 3478 | 36.14 |
| 3479 | 36.13 |
| 3480 | 36.13 |
| 3481 | 36.13 |
| 3482 | 36.12 |
| 3483 | 36.11 |
| 3484 | 36.1 |
| 3485 | 36.09 |
| 3486 | 36.08 |
| 3487 | 36.08 |
| 3488 | 36.08 |
| 3489 | 36.07 |
| 3490 | 36.06 |
| 3491 | 36.06 |
| 3492 | 36.05 |
| 3493 | 36.05 |
| 3494 | 36.05 |
| 3495 | 36.04 |
| 3496 | 36.03 |
| 3497 | 36.02 |
| 3498 | 36.02 |
| 3499 | 36.01 |
| 3500 | 36.01 |
| 3501 | 36 |
| 3502 | 36 |
| 3503 | 36 |
| 3504 | 36 |
| 3505 | 36 |
| 3506 | 35.99 |
| 3507 | 35.96 |
| 3508 | 35.96 |
| 3509 | 35.96 |
| 3510 | 35.96 |
| 3511 | 35.96 |
| 3512 | 35.95 |
| 3513 | 35.93 |
| 3514 | 35.92 |
| 3515 | 35.92 |
| 3516 | 35.91 |
| 3517 | 35.91 |
| 3518 | 35.91 |
| 3519 | 35.9 |
| 3520 | 35.9 |
| 3521 | 35.9 |
| 3522 | 35.9 |
| 3523 | 35.88 |
| 3524 | 35.87 |
| 3525 | 35.86 |
| 3526 | 35.86 |
| 3527 | 35.84 |
| 3528 | 35.84 |
| 3529 | 35.84 |
| 3530 | 35.83 |
| 3531 | 35.82 |
| 3532 | 35.81 |
| 3533 | 35.81 |
| 3534 | 35.78 |
| 3535 | 35.78 |
| 3536 | 35.77 |
| 3537 | 35.77 |
| 3538 | 35.77 |
| 3539 | 35.77 |
| 3540 | 35.76 |
| 3541 | 35.75 |
| 3542 | 35.75 |
| 3543 | 35.75 |
| 3544 | 35.74 |
| 3545 | 35.74 |
| 3546 | 35.73 |
| 3547 | 35.73 |
| 3548 | 35.73 |
| 3549 | 35.72 |
| 3550 | 35.71 |
| 3551 | 35.71 |
| 3552 | 35.71 |
| 3553 | 35.71 |
| 3554 | 35.71 |
| 3555 | 35.7 |
| 3556 | 35.7 |
| 3557 | 35.7 |
| 3558 | 35.7 |
| 3559 | 35.7 |
| 3560 | 35.69 |
| 3561 | 35.69 |
| 3562 | 35.69 |
| 3563 | 35.68 |
| 3564 | 35.68 |
| 3565 | 35.67 |
| 3566 | 35.66 |
| 3567 | 35.65 |
| 3568 | 35.65 |
| 3569 | 35.64 |
| 3570 | 35.64 |
| 3571 | 35.64 |
| 3572 | 35.64 |
| 3573 | 35.63 |
| 3574 | 35.63 |
| 3575 | 35.63 |
| 3576 | 35.63 |
| 3577 | 35.62 |
| 3578 | 35.62 |
| 3579 | 35.62 |
| 3580 | 35.61 |
| 3581 | 35.61 |
| 3582 | 35.6 |
| 3583 | 35.59 |
| 3584 | 35.59 |
| 3585 | 35.59 |
| 3586 | 35.59 |
| 3587 | 35.58 |
| 3588 | 35.58 |
| 3589 | 35.58 |
| 3590 | 35.58 |
| 3591 | 35.57 |
| 3592 | 35.57 |
| 3593 | 35.57 |
| 3594 | 35.57 |
| 3595 | 35.57 |
| 3596 | 35.56 |
| 3597 | 35.55 |
| 3598 | 35.54 |
| 3599 | 35.54 |
| 3600 | 35.53 |
| 3601 | 35.52 |
| 3602 | 35.52 |
| 3603 | 35.51 |
| 3604 | 35.51 |
| 3605 | 35.51 |
| 3606 | 35.51 |
| 3607 | 35.5 |
| 3608 | 35.5 |
| 3609 | 35.5 |
| 3610 | 35.49 |
| 3611 | 35.47 |
| 3612 | 35.47 |
| 3613 | 35.47 |
| 3614 | 35.47 |
| 3615 | 35.46 |
| 3616 | 35.46 |
| 3617 | 35.46 |
| 3618 | 35.46 |
| 3619 | 35.46 |
| 3620 | 35.45 |
| 3621 | 35.45 |
| 3622 | 35.44 |
| 3623 | 35.43 |
| 3624 | 35.43 |
| 3625 | 35.42 |
| 3626 | 35.42 |
| 3627 | 35.41 |
| 3628 | 35.41 |
| 3629 | 35.41 |
| 3630 | 35.4 |
| 3631 | 35.4 |
| 3632 | 35.4 |
| 3633 | 35.4 |
| 3634 | 35.4 |
| 3635 | 35.4 |
| 3636 | 35.39 |
| 3637 | 35.39 |
| 3638 | 35.39 |
| 3639 | 35.39 |
| 3640 | 35.38 |
| 3641 | 35.38 |
| 3642 | 35.37 |
| 3643 | 35.36 |
| 3644 | 35.36 |
| 3645 | 35.36 |
| 3646 | 35.35 |
| 3647 | 35.34 |
| 3648 | 35.34 |
| 3649 | 35.33 |
| 3650 | 35.33 |
| 3651 | 35.32 |
| 3652 | 35.32 |
| 3653 | 35.32 |
| 3654 | 35.32 |
| 3655 | 35.3 |
| 3656 | 35.3 |
| 3657 | 35.3 |
| 3658 | 35.29 |
| 3659 | 35.29 |
| 3660 | 35.29 |
| 3661 | 35.29 |
| 3662 | 35.29 |
| 3663 | 35.28 |
| 3664 | 35.28 |
| 3665 | 35.28 |
| 3666 | 35.28 |
| 3667 | 35.28 |
| 3668 | 35.28 |
| 3669 | 35.28 |
| 3670 | 35.28 |
| 3671 | 35.28 |
| 3672 | 35.28 |
| 3673 | 35.28 |
| 3674 | 35.28 |
| 3675 | 35.28 |
| 3676 | 35.27 |
| 3677 | 35.27 |
| 3678 | 35.27 |
| 3679 | 35.27 |
| 3680 | 35.26 |
| 3681 | 35.26 |
| 3682 | 35.26 |
| 3683 | 35.26 |
| 3684 | 35.26 |
| 3685 | 35.26 |
| 3686 | 35.26 |
| 3687 | 35.26 |
| 3688 | 35.26 |
| 3689 | 35.26 |
| 3690 | 35.26 |
| 3691 | 35.26 |
| 3692 | 35.26 |
| 3693 | 35.26 |
| 3694 | 35.26 |
| 3695 | 35.26 |
| 3696 | 35.26 |
| 3697 | 35.26 |
| 3698 | 35.26 |
| 3699 | 35.26 |
| 3700 | 35.26 |
| 3701 | 35.26 |
| 3702 | 35.26 |
| 3703 | 35.26 |
| 3704 | 35.26 |
| 3705 | 35.26 |
| 3706 | 35.26 |
| 3707 | 35.26 |
| 3708 | 35.26 |
| 3709 | 35.26 |
| 3710 | 35.26 |
| 3711 | 35.26 |
| 3712 | 35.26 |
| 3713 | 35.26 |
| 3714 | 35.26 |
| 3715 | 35.26 |
| 3716 | 35.26 |
| 3717 | 35.26 |
| 3718 | 35.26 |
| 3719 | 35.26 |
| 3720 | 35.26 |
| 3721 | 35.26 |
| 3722 | 35.26 |
| 3723 | 35.26 |
| 3724 | 35.26 |
| 3725 | 35.26 |
| 3726 | 35.26 |
| 3727 | 35.26 |
| 3728 | 35.26 |
| 3729 | 35.26 |
| 3730 | 35.26 |
| 3731 | 35.26 |
| 3732 | 35.26 |
| 3733 | 35.26 |
| 3734 | 35.26 |
| 3735 | 35.26 |
| 3736 | 35.26 |
| 3737 | 35.26 |
| 3738 | 35.26 |
| 3739 | 35.26 |
| 3740 | 35.26 |
| 3741 | 35.26 |
| 3742 | 35.25 |
| 3743 | 35.25 |
| 3744 | 35.25 |
| 3745 | 35.25 |
| 3746 | 35.25 |
| 3747 | 35.25 |
| 3748 | 35.25 |
| 3749 | 35.25 |
| 3750 | 35.25 |
| 3751 | 35.25 |
| 3752 | 35.25 |
| 3753 | 35.25 |
| 3754 | 35.25 |
| 3755 | 35.25 |
| 3756 | 35.25 |
| 3757 | 35.25 |
| 3758 | 35.25 |
| 3759 | 35.25 |
| 3760 | 35.25 |
| 3761 | 35.25 |
| 3762 | 35.25 |
| 3763 | 35.25 |
| 3764 | 35.25 |
| 3765 | 35.25 |
| 3766 | 35.25 |
| 3767 | 35.25 |
| 3768 | 35.25 |
| 3769 | 35.25 |
| 3770 | 35.25 |
| 3771 | 35.25 |
| 3772 | 35.25 |
| 3773 | 35.25 |
| 3774 | 35.25 |
| 3775 | 35.25 |
| 3776 | 35.25 |
| 3777 | 35.25 |
| 3778 | 35.25 |
| 3779 | 35.25 |
| 3780 | 35.25 |
| 3781 | 35.25 |
| 3782 | 35.25 |
| 3783 | 35.25 |
| 3784 | 35.25 |
| 3785 | 35.25 |
| 3786 | 35.25 |
| 3787 | 35.25 |
| 3788 | 35.25 |
| 3789 | 35.25 |
| 3790 | 35.25 |
| 3791 | 35.25 |
| 3792 | 35.25 |
| 3793 | 35.25 |
| 3794 | 35.25 |
| 3795 | 35.25 |
| 3796 | 35.25 |
| 3797 | 35.25 |
| 3798 | 35.25 |
| 3799 | 35.25 |
| 3800 | 35.25 |
| 3801 | 35.25 |
| 3802 | 35.25 |
| 3803 | 35.25 |
| 3804 | 35.25 |
| 3805 | 35.25 |
| 3806 | 35.25 |
| 3807 | 35.25 |
| 3808 | 35.25 |
| 3809 | 35.25 |
| 3810 | 35.25 |
| 3811 | 35.25 |
| 3812 | 35.25 |
| 3813 | 35.25 |
| 3814 | 35.25 |
| 3815 | 35.25 |
| 3816 | 35.25 |
| 3817 | 35.25 |
| 3818 | 35.25 |
| 3819 | 35.25 |
| 3820 | 35.25 |
| 3821 | 35.24 |
| 3822 | 35.24 |
| 3823 | 35.23 |
| 3824 | 35.23 |
| 3825 | 35.23 |
| 3826 | 35.23 |
| 3827 | 35.23 |
| 3828 | 35.22 |
| 3829 | 35.22 |
| 3830 | 35.22 |
| 3831 | 35.21 |
| 3832 | 35.21 |
| 3833 | 35.21 |
| 3834 | 35.21 |
| 3835 | 35.2 |
| 3836 | 35.2 |
| 3837 | 35.19 |
| 3838 | 35.19 |
| 3839 | 35.18 |
| 3840 | 35.18 |
| 3841 | 35.17 |
| 3842 | 35.17 |
| 3843 | 35.17 |
| 3844 | 35.17 |
| 3845 | 35.16 |
| 3846 | 35.16 |
| 3847 | 35.16 |
| 3848 | 35.15 |
| 3849 | 35.15 |
| 3850 | 35.15 |
| 3851 | 35.14 |
| 3852 | 35.14 |
| 3853 | 35.14 |
| 3854 | 35.13 |
| 3855 | 35.13 |
| 3856 | 35.12 |
| 3857 | 35.12 |
| 3858 | 35.12 |
| 3859 | 35.11 |
| 3860 | 35.11 |
| 3861 | 35.11 |
| 3862 | 35.1 |
| 3863 | 35.1 |
| 3864 | 35.09 |
| 3865 | 35.09 |
| 3866 | 35.08 |
| 3867 | 35.08 |
| 3868 | 35.08 |
| 3869 | 35.08 |
| 3870 | 35.08 |
| 3871 | 35.08 |
| 3872 | 35.08 |
| 3873 | 35.08 |
| 3874 | 35.08 |
| 3875 | 35.07 |
| 3876 | 35.07 |
| 3877 | 35.07 |
| 3878 | 35.07 |
| 3879 | 35.07 |
| 3880 | 35.07 |
| 3881 | 35.07 |
| 3882 | 35.06 |
| 3883 | 35.06 |
| 3884 | 35.06 |
| 3885 | 35.05 |
| 3886 | 35.05 |
| 3887 | 35.04 |
| 3888 | 35.04 |
| 3889 | 35.04 |
| 3890 | 35.04 |
| 3891 | 35.04 |
| 3892 | 35.03 |
| 3893 | 35.03 |
| 3894 | 35.03 |
| 3895 | 35.02 |
| 3896 | 35.02 |
| 3897 | 35.02 |
| 3898 | 35.01 |
| 3899 | 35.01 |
| 3900 | 35.01 |
| 3901 | 35.01 |
| 3902 | 35.01 |
| 3903 | 35.01 |
| 3904 | 35.01 |
| 3905 | 35.01 |
| 3906 | 35.01 |
| 3907 | 35.01 |
| 3908 | 35.01 |
| 3909 | 35.01 |
| 3910 | 35.01 |
| 3911 | 35.01 |
| 3912 | 35.01 |
| 3913 | 35.01 |
| 3914 | 35.01 |
| 3915 | 35.01 |
| 3916 | 35.01 |
| 3917 | 35.01 |
| 3918 | 35.01 |
| 3919 | 35 |
| 3920 | 35 |
| 3921 | 35 |
| 3922 | 35 |
| 3923 | 35 |
| 3924 | 35 |
| 3925 | 35 |
| 3926 | 35 |
| 3927 | 35 |
| 3928 | 35 |
| 3929 | 35 |
| 3930 | 35 |
| 3931 | 35 |
| 3932 | 35 |
| 3933 | 34.99 |
| 3934 | 34.99 |
| 3935 | 34.99 |
| 3936 | 34.99 |
| 3937 | 34.99 |
| 3938 | 34.98 |
| 3939 | 34.98 |
| 3940 | 34.98 |
| 3941 | 34.98 |
| 3942 | 34.96 |
| 3943 | 34.96 |
| 3944 | 34.96 |
| 3945 | 34.95 |
| 3946 | 34.95 |
| 3947 | 34.95 |
| 3948 | 34.95 |
| 3949 | 34.95 |
| 3950 | 34.94 |
| 3951 | 34.94 |
| 3952 | 34.94 |
| 3953 | 34.93 |
| 3954 | 34.93 |
| 3955 | 34.93 |
| 3956 | 34.93 |
| 3957 | 34.93 |
| 3958 | 34.92 |
| 3959 | 34.92 |
| 3960 | 34.92 |
| 3961 | 34.91 |
| 3962 | 34.9 |
| 3963 | 34.9 |
| 3964 | 34.89 |
| 3965 | 34.89 |
| 3966 | 34.88 |
| 3967 | 34.88 |
| 3968 | 34.87 |
| 3969 | 34.87 |
| 3970 | 34.87 |
| 3971 | 34.87 |
| 3972 | 34.86 |
| 3973 | 34.86 |
| 3974 | 34.86 |
| 3975 | 34.85 |
| 3976 | 34.85 |
| 3977 | 34.85 |
| 3978 | 34.84 |
| 3979 | 34.84 |
| 3980 | 34.84 |
| 3981 | 34.84 |
| 3982 | 34.84 |
| 3983 | 34.83 |
| 3984 | 34.83 |
| 3985 | 34.82 |
| 3986 | 34.82 |
| 3987 | 34.82 |
| 3988 | 34.82 |
| 3989 | 34.82 |
| 3990 | 34.82 |
| 3991 | 34.81 |
| 3992 | 34.81 |
| 3993 | 34.8 |
| 3994 | 34.8 |
| 3995 | 34.79 |
| 3996 | 34.79 |
| 3997 | 34.78 |
| 3998 | 34.78 |
| 3999 | 34.77 |
| 4000 | 34.77 |
| 4001 | 34.77 |
| 4002 | 34.77 |
| 4003 | 34.77 |
| 4004 | 34.76 |
| 4005 | 34.76 |
| 4006 | 34.76 |
| 4007 | 34.75 |
| 4008 | 34.75 |
| 4009 | 34.75 |
| 4010 | 34.75 |
| 4011 | 34.75 |
| 4012 | 34.73 |
| 4013 | 34.73 |
| 4014 | 34.72 |
| 4015 | 34.72 |
| 4016 | 34.72 |
| 4017 | 34.71 |
| 4018 | 34.71 |
| 4019 | 34.71 |
| 4020 | 34.7 |
| 4021 | 34.7 |
| 4022 | 34.7 |
| 4023 | 34.7 |
| 4024 | 34.7 |
| 4025 | 34.7 |
| 4026 | 34.68 |
| 4027 | 34.68 |
| 4028 | 34.68 |
| 4029 | 34.67 |
| 4030 | 34.67 |
| 4031 | 34.67 |
| 4032 | 34.66 |
| 4033 | 34.66 |
| 4034 | 34.66 |
| 4035 | 34.65 |
| 4036 | 34.64 |
| 4037 | 34.64 |
| 4038 | 34.64 |
| 4039 | 34.63 |
| 4040 | 34.63 |
| 4041 | 34.63 |
| 4042 | 34.62 |
| 4043 | 34.62 |
| 4044 | 34.62 |
| 4045 | 34.62 |
| 4046 | 34.61 |
| 4047 | 34.61 |
| 4048 | 34.61 |
| 4049 | 34.61 |
| 4050 | 34.6 |
| 4051 | 34.6 |
| 4052 | 34.59 |
| 4053 | 34.59 |
| 4054 | 34.59 |
| 4055 | 34.58 |
| 4056 | 34.58 |
| 4057 | 34.57 |
| 4058 | 34.57 |
| 4059 | 34.57 |
| 4060 | 34.57 |
| 4061 | 34.57 |
| 4062 | 34.56 |
| 4063 | 34.56 |
| 4064 | 34.56 |
| 4065 | 34.56 |
| 4066 | 34.56 |
| 4067 | 34.56 |
| 4068 | 34.56 |
| 4069 | 34.55 |
| 4070 | 34.55 |
| 4071 | 34.55 |
| 4072 | 34.55 |
| 4073 | 34.55 |
| 4074 | 34.54 |
| 4075 | 34.54 |
| 4076 | 34.54 |
| 4077 | 34.54 |
| 4078 | 34.52 |
| 4079 | 34.51 |
| 4080 | 34.49 |
| 4081 | 34.49 |
| 4082 | 34.48 |
| 4083 | 34.48 |
| 4084 | 34.47 |
| 4085 | 34.47 |
| 4086 | 34.47 |
| 4087 | 34.47 |
| 4088 | 34.46 |
| 4089 | 34.46 |
| 4090 | 34.45 |
| 4091 | 34.45 |
| 4092 | 34.45 |
| 4093 | 34.45 |
| 4094 | 34.44 |
| 4095 | 34.43 |
| 4096 | 34.43 |
| 4097 | 34.42 |
| 4098 | 34.42 |
| 4099 | 34.42 |
| 4100 | 34.41 |
| 4101 | 34.41 |
| 4102 | 34.41 |
| 4103 | 34.4 |
| 4104 | 34.4 |
| 4105 | 34.4 |
| 4106 | 34.4 |
| 4107 | 34.4 |
| 4108 | 34.39 |
| 4109 | 34.39 |
| 4110 | 34.39 |
| 4111 | 34.38 |
| 4112 | 34.38 |
| 4113 | 34.38 |
| 4114 | 34.37 |
| 4115 | 34.37 |
| 4116 | 34.36 |
| 4117 | 34.36 |
| 4118 | 34.36 |
| 4119 | 34.35 |
| 4120 | 34.35 |
| 4121 | 34.35 |
| 4122 | 34.35 |
| 4123 | 34.35 |
| 4124 | 34.34 |
| 4125 | 34.34 |
| 4126 | 34.34 |
| 4127 | 34.33 |
| 4128 | 34.32 |
| 4129 | 34.32 |
| 4130 | 34.32 |
| 4131 | 34.32 |
| 4132 | 34.32 |
| 4133 | 34.32 |
| 4134 | 34.31 |
| 4135 | 34.31 |
| 4136 | 34.31 |
| 4137 | 34.3 |
| 4138 | 34.29 |
| 4139 | 34.29 |
| 4140 | 34.29 |
| 4141 | 34.29 |
| 4142 | 34.28 |
| 4143 | 34.28 |
| 4144 | 34.28 |
| 4145 | 34.28 |
| 4146 | 34.27 |
| 4147 | 34.27 |
| 4148 | 34.27 |
| 4149 | 34.27 |
| 4150 | 34.27 |
| 4151 | 34.26 |
| 4152 | 34.25 |
| 4153 | 34.25 |
| 4154 | 34.25 |
| 4155 | 34.23 |
| 4156 | 34.23 |
| 4157 | 34.23 |
| 4158 | 34.23 |
| 4159 | 34.23 |
| 4160 | 34.22 |
| 4161 | 34.21 |
| 4162 | 34.21 |
| 4163 | 34.21 |
| 4164 | 34.2 |
| 4165 | 34.2 |
| 4166 | 34.19 |
| 4167 | 34.19 |
| 4168 | 34.19 |
| 4169 | 34.19 |
| 4170 | 34.18 |
| 4171 | 34.17 |
| 4172 | 34.17 |
| 4173 | 34.17 |
| 4174 | 34.17 |
| 4175 | 34.16 |
| 4176 | 34.15 |
| 4177 | 34.15 |
| 4178 | 34.14 |
| 4179 | 34.14 |
| 4180 | 34.12 |
| 4181 | 34.12 |
| 4182 | 34.12 |
| 4183 | 34.12 |
| 4184 | 34.12 |
| 4185 | 34.11 |
| 4186 | 34.11 |
| 4187 | 34.11 |
| 4188 | 34.1 |
| 4189 | 34.1 |
| 4190 | 34.08 |
| 4191 | 34.08 |
| 4192 | 34.08 |
| 4193 | 34.07 |
| 4194 | 34.07 |
| 4195 | 34.07 |
| 4196 | 34.06 |
| 4197 | 34.05 |
| 4198 | 34.04 |
| 4199 | 34.04 |
| 4200 | 34.04 |
| 4201 | 34.04 |
| 4202 | 34.04 |
| 4203 | 34.03 |
| 4204 | 34.03 |
| 4205 | 34.03 |
| 4206 | 34.02 |
| 4207 | 34.02 |
| 4208 | 34.01 |
| 4209 | 34.01 |
| 4210 | 34.01 |
| 4211 | 34.01 |
| 4212 | 34.01 |
| 4213 | 34.01 |
| 4214 | 34 |
| 4215 | 34 |
| 4216 | 34 |
| 4217 | 34 |
| 4218 | 34 |
| 4219 | 34 |
| 4220 | 34 |
| 4221 | 33.99 |
| 4222 | 33.99 |
| 4223 | 33.99 |
| 4224 | 33.98 |
| 4225 | 33.98 |
| 4226 | 33.98 |
| 4227 | 33.98 |
| 4228 | 33.97 |
| 4229 | 33.97 |
| 4230 | 33.96 |
| 4231 | 33.96 |
| 4232 | 33.96 |
| 4233 | 33.96 |
| 4234 | 33.95 |
| 4235 | 33.94 |
| 4236 | 33.94 |
| 4237 | 33.94 |
| 4238 | 33.94 |
| 4239 | 33.94 |
| 4240 | 33.93 |
| 4241 | 33.93 |
| 4242 | 33.92 |
| 4243 | 33.92 |
| 4244 | 33.91 |
| 4245 | 33.91 |
| 4246 | 33.91 |
| 4247 | 33.9 |
| 4248 | 33.9 |
| 4249 | 33.9 |
| 4250 | 33.9 |
| 4251 | 33.89 |
| 4252 | 33.89 |
| 4253 | 33.89 |
| 4254 | 33.88 |
| 4255 | 33.88 |
| 4256 | 33.87 |
| 4257 | 33.87 |
| 4258 | 33.87 |
| 4259 | 33.86 |
| 4260 | 33.85 |
| 4261 | 33.85 |
| 4262 | 33.85 |
| 4263 | 33.84 |
| 4264 | 33.84 |
| 4265 | 33.84 |
| 4266 | 33.84 |
| 4267 | 33.84 |
| 4268 | 33.84 |
| 4269 | 33.83 |
| 4270 | 33.83 |
| 4271 | 33.83 |
| 4272 | 33.83 |
| 4273 | 33.82 |
| 4274 | 33.82 |
| 4275 | 33.81 |
| 4276 | 33.81 |
| 4277 | 33.81 |
| 4278 | 33.81 |
| 4279 | 33.8 |
| 4280 | 33.8 |
| 4281 | 33.8 |
| 4282 | 33.8 |
| 4283 | 33.8 |
| 4284 | 33.8 |
| 4285 | 33.79 |
| 4286 | 33.79 |
| 4287 | 33.78 |
| 4288 | 33.78 |
| 4289 | 33.78 |
| 4290 | 33.78 |
| 4291 | 33.77 |
| 4292 | 33.77 |
| 4293 | 33.77 |
| 4294 | 33.77 |
| 4295 | 33.77 |
| 4296 | 33.76 |
| 4297 | 33.76 |
| 4298 | 33.76 |
| 4299 | 33.76 |
| 4300 | 33.75 |
| 4301 | 33.75 |
| 4302 | 33.74 |
| 4303 | 33.74 |
| 4304 | 33.74 |
| 4305 | 33.74 |
| 4306 | 33.74 |
| 4307 | 33.74 |
| 4308 | 33.73 |
| 4309 | 33.73 |
| 4310 | 33.72 |
| 4311 | 33.72 |
| 4312 | 33.72 |
| 4313 | 33.71 |
| 4314 | 33.71 |
| 4315 | 33.71 |
| 4316 | 33.71 |
| 4317 | 33.7 |
| 4318 | 33.7 |
| 4319 | 33.7 |
| 4320 | 33.69 |
| 4321 | 33.69 |
| 4322 | 33.69 |
| 4323 | 33.67 |
| 4324 | 33.66 |
| 4325 | 33.66 |
| 4326 | 33.66 |
| 4327 | 33.66 |
| 4328 | 33.66 |
| 4329 | 33.65 |
| 4330 | 33.65 |
| 4331 | 33.65 |
| 4332 | 33.64 |
| 4333 | 33.64 |
| 4334 | 33.63 |
| 4335 | 33.63 |
| 4336 | 33.63 |
| 4337 | 33.62 |
| 4338 | 33.62 |
| 4339 | 33.6 |
| 4340 | 33.6 |
| 4341 | 33.6 |
| 4342 | 33.59 |
| 4343 | 33.59 |
| 4344 | 33.59 |
| 4345 | 33.58 |
| 4346 | 33.58 |
| 4347 | 33.58 |
| 4348 | 33.57 |
| 4349 | 33.57 |
| 4350 | 33.57 |
| 4351 | 33.57 |
| 4352 | 33.55 |
| 4353 | 33.55 |
| 4354 | 33.54 |
| 4355 | 33.53 |
| 4356 | 33.53 |
| 4357 | 33.53 |
| 4358 | 33.51 |
| 4359 | 33.51 |
| 4360 | 33.5 |
| 4361 | 33.5 |
| 4362 | 33.5 |
| 4363 | 33.49 |
| 4364 | 33.49 |
| 4365 | 33.49 |
| 4366 | 33.49 |
| 4367 | 33.48 |
| 4368 | 33.48 |
| 4369 | 33.48 |
| 4370 | 33.47 |
| 4371 | 33.47 |
| 4372 | 33.47 |
| 4373 | 33.46 |
| 4374 | 33.46 |
| 4375 | 33.46 |
| 4376 | 33.45 |
| 4377 | 33.45 |
| 4378 | 33.45 |
| 4379 | 33.45 |
| 4380 | 33.45 |
| 4381 | 33.45 |
| 4382 | 33.44 |
| 4383 | 33.44 |
| 4384 | 33.43 |
| 4385 | 33.43 |
| 4386 | 33.43 |
| 4387 | 33.43 |
| 4388 | 33.43 |
| 4389 | 33.43 |
| 4390 | 33.43 |
| 4391 | 33.42 |
| 4392 | 33.41 |
| 4393 | 33.41 |
| 4394 | 33.41 |
| 4395 | 33.4 |
| 4396 | 33.39 |
| 4397 | 33.39 |
| 4398 | 33.39 |
| 4399 | 33.39 |
| 4400 | 33.37 |
| 4401 | 33.37 |
| 4402 | 33.37 |
| 4403 | 33.37 |
| 4404 | 33.37 |
| 4405 | 33.37 |
| 4406 | 33.37 |
| 4407 | 33.36 |
| 4408 | 33.36 |
| 4409 | 33.36 |
| 4410 | 33.36 |
| 4411 | 33.35 |
| 4412 | 33.34 |
| 4413 | 33.34 |
| 4414 | 33.32 |
| 4415 | 33.32 |
| 4416 | 33.31 |
| 4417 | 33.31 |
| 4418 | 33.31 |
| 4419 | 33.3 |
| 4420 | 33.3 |
| 4421 | 33.3 |
| 4422 | 33.3 |
| 4423 | 33.3 |
| 4424 | 33.3 |
| 4425 | 33.29 |
| 4426 | 33.29 |
| 4427 | 33.28 |
| 4428 | 33.28 |
| 4429 | 33.28 |
| 4430 | 33.28 |
| 4431 | 33.28 |
| 4432 | 33.27 |
| 4433 | 33.27 |
| 4434 | 33.26 |
| 4435 | 33.25 |
| 4436 | 33.25 |
| 4437 | 33.24 |
| 4438 | 33.24 |
| 4439 | 33.24 |
| 4440 | 33.22 |
| 4441 | 33.21 |
| 4442 | 33.21 |
| 4443 | 33.21 |
| 4444 | 33.2 |
| 4445 | 33.2 |
| 4446 | 33.17 |
| 4447 | 33.17 |
| 4448 | 33.15 |
| 4449 | 33.14 |
| 4450 | 33.14 |
| 4451 | 33.14 |
| 4452 | 33.13 |
| 4453 | 33.13 |
| 4454 | 33.13 |
| 4455 | 33.12 |
| 4456 | 33.12 |
| 4457 | 33.12 |
| 4458 | 33.12 |
| 4459 | 33.12 |
| 4460 | 33.11 |
| 4461 | 33.11 |
| 4462 | 33.11 |
| 4463 | 33.09 |
| 4464 | 33.08 |
| 4465 | 33.08 |
| 4466 | 33.08 |
| 4467 | 33.07 |
| 4468 | 33.07 |
| 4469 | 33.07 |
| 4470 | 33.06 |
| 4471 | 33.06 |
| 4472 | 33.05 |
| 4473 | 33.04 |
| 4474 | 33.03 |
| 4475 | 33.03 |
| 4476 | 33.03 |
| 4477 | 33.03 |
| 4478 | 33.03 |
| 4479 | 33.02 |
| 4480 | 33 |
| 4481 | 33 |
| 4482 | 33 |
| 4483 | 33 |
| 4484 | 33 |
| 4485 | 33 |
| 4486 | 32.99 |
| 4487 | 32.99 |
| 4488 | 32.99 |
| 4489 | 32.98 |
| 4490 | 32.98 |
| 4491 | 32.98 |
| 4492 | 32.98 |
| 4493 | 32.97 |
| 4494 | 32.97 |
| 4495 | 32.97 |
| 4496 | 32.96 |
| 4497 | 32.96 |
| 4498 | 32.95 |
| 4499 | 32.95 |
| 4500 | 32.95 |
| 4501 | 32.95 |
| 4502 | 32.95 |
| 4503 | 32.94 |
| 4504 | 32.94 |
| 4505 | 32.94 |
| 4506 | 32.94 |
| 4507 | 32.94 |
| 4508 | 32.94 |
| 4509 | 32.94 |
| 4510 | 32.94 |
| 4511 | 32.93 |
| 4512 | 32.93 |
| 4513 | 32.93 |
| 4514 | 32.93 |
| 4515 | 32.92 |
| 4516 | 32.92 |
| 4517 | 32.91 |
| 4518 | 32.91 |
| 4519 | 32.91 |
| 4520 | 32.9 |
| 4521 | 32.9 |
| 4522 | 32.9 |
| 4523 | 32.89 |
| 4524 | 32.88 |
| 4525 | 32.88 |
| 4526 | 32.88 |
| 4527 | 32.88 |
| 4528 | 32.88 |
| 4529 | 32.87 |
| 4530 | 32.87 |
| 4531 | 32.87 |
| 4532 | 32.87 |
| 4533 | 32.87 |
| 4534 | 32.86 |
| 4535 | 32.86 |
| 4536 | 32.85 |
| 4537 | 32.85 |
| 4538 | 32.84 |
| 4539 | 32.84 |
| 4540 | 32.84 |
| 4541 | 32.84 |
| 4542 | 32.83 |
| 4543 | 32.83 |
| 4544 | 32.82 |
| 4545 | 32.82 |
| 4546 | 32.82 |
| 4547 | 32.81 |
| 4548 | 32.81 |
| 4549 | 32.81 |
| 4550 | 32.81 |
| 4551 | 32.81 |
| 4552 | 32.8 |
| 4553 | 32.8 |
| 4554 | 32.79 |
| 4555 | 32.79 |
| 4556 | 32.79 |
| 4557 | 32.79 |
| 4558 | 32.77 |
| 4559 | 32.76 |
| 4560 | 32.76 |
| 4561 | 32.76 |
| 4562 | 32.76 |
| 4563 | 32.75 |
| 4564 | 32.75 |
| 4565 | 32.75 |
| 4566 | 32.74 |
| 4567 | 32.74 |
| 4568 | 32.73 |
| 4569 | 32.73 |
| 4570 | 32.72 |
| 4571 | 32.72 |
| 4572 | 32.72 |
| 4573 | 32.7 |
| 4574 | 32.7 |
| 4575 | 32.68 |
| 4576 | 32.68 |
| 4577 | 32.68 |
| 4578 | 32.67 |
| 4579 | 32.67 |
| 4580 | 32.67 |
| 4581 | 32.66 |
| 4582 | 32.66 |
| 4583 | 32.66 |
| 4584 | 32.65 |
| 4585 | 32.64 |
| 4586 | 32.63 |
| 4587 | 32.63 |
| 4588 | 32.63 |
| 4589 | 32.63 |
| 4590 | 32.63 |
| 4591 | 32.62 |
| 4592 | 32.61 |
| 4593 | 32.61 |
| 4594 | 32.61 |
| 4595 | 32.6 |
| 4596 | 32.6 |
| 4597 | 32.6 |
| 4598 | 32.58 |
| 4599 | 32.58 |
| 4600 | 32.58 |
| 4601 | 32.58 |
| 4602 | 32.58 |
| 4603 | 32.58 |
| 4604 | 32.57 |
| 4605 | 32.56 |
| 4606 | 32.56 |
| 4607 | 32.55 |
| 4608 | 32.55 |
| 4609 | 32.54 |
| 4610 | 32.54 |
| 4611 | 32.53 |
| 4612 | 32.52 |
| 4613 | 32.52 |
| 4614 | 32.51 |
| 4615 | 32.51 |
| 4616 | 32.51 |
| 4617 | 32.51 |
| 4618 | 32.51 |
| 4619 | 32.51 |
| 4620 | 32.51 |
| 4621 | 32.51 |
| 4622 | 32.51 |
| 4623 | 32.5 |
| 4624 | 32.5 |
| 4625 | 32.5 |
| 4626 | 32.49 |
| 4627 | 32.49 |
| 4628 | 32.48 |
| 4629 | 32.47 |
| 4630 | 32.47 |
| 4631 | 32.47 |
| 4632 | 32.47 |
| 4633 | 32.47 |
| 4634 | 32.47 |
| 4635 | 32.47 |
| 4636 | 32.47 |
| 4637 | 32.46 |
| 4638 | 32.46 |
| 4639 | 32.46 |
| 4640 | 32.45 |
| 4641 | 32.45 |
| 4642 | 32.44 |
| 4643 | 32.43 |
| 4644 | 32.42 |
| 4645 | 32.42 |
| 4646 | 32.41 |
| 4647 | 32.4 |
| 4648 | 32.39 |
| 4649 | 32.39 |
| 4650 | 32.39 |
| 4651 | 32.38 |
| 4652 | 32.38 |
| 4653 | 32.38 |
| 4654 | 32.37 |
| 4655 | 32.37 |
| 4656 | 32.37 |
| 4657 | 32.37 |
| 4658 | 32.36 |
| 4659 | 32.36 |
| 4660 | 32.36 |
| 4661 | 32.36 |
| 4662 | 32.35 |
| 4663 | 32.35 |
| 4664 | 32.34 |
| 4665 | 32.34 |
| 4666 | 32.34 |
| 4667 | 32.33 |
| 4668 | 32.33 |
| 4669 | 32.32 |
| 4670 | 32.32 |
| 4671 | 32.3 |
| 4672 | 32.3 |
| 4673 | 32.3 |
| 4674 | 32.3 |
| 4675 | 32.3 |
| 4676 | 32.29 |
| 4677 | 32.29 |
| 4678 | 32.28 |
| 4679 | 32.28 |
| 4680 | 32.28 |
| 4681 | 32.27 |
| 4682 | 32.27 |
| 4683 | 32.27 |
| 4684 | 32.27 |
| 4685 | 32.27 |
| 4686 | 32.26 |
| 4687 | 32.26 |
| 4688 | 32.26 |
| 4689 | 32.25 |
| 4690 | 32.25 |
| 4691 | 32.25 |
| 4692 | 32.25 |
| 4693 | 32.25 |
| 4694 | 32.24 |
| 4695 | 32.24 |
| 4696 | 32.24 |
| 4697 | 32.24 |
| 4698 | 32.23 |
| 4699 | 32.23 |
| 4700 | 32.23 |
| 4701 | 32.22 |
| 4702 | 32.21 |
| 4703 | 32.21 |
| 4704 | 32.21 |
| 4705 | 32.21 |
| 4706 | 32.2 |
| 4707 | 32.2 |
| 4708 | 32.2 |
| 4709 | 32.2 |
| 4710 | 32.19 |
| 4711 | 32.19 |
| 4712 | 32.18 |
| 4713 | 32.17 |
| 4714 | 32.17 |
| 4715 | 32.16 |
| 4716 | 32.16 |
| 4717 | 32.16 |
| 4718 | 32.16 |
| 4719 | 32.16 |
| 4720 | 32.15 |
| 4721 | 32.14 |
| 4722 | 32.14 |
| 4723 | 32.14 |
| 4724 | 32.13 |
| 4725 | 32.13 |
| 4726 | 32.13 |
| 4727 | 32.13 |
| 4728 | 32.12 |
| 4729 | 32.12 |
| 4730 | 32.12 |
| 4731 | 32.11 |
| 4732 | 32.1 |
| 4733 | 32.1 |
| 4734 | 32.09 |
| 4735 | 32.09 |
| 4736 | 32.09 |
| 4737 | 32.07 |
| 4738 | 32.05 |
| 4739 | 32.05 |
| 4740 | 32.05 |
| 4741 | 32.05 |
| 4742 | 32.05 |
| 4743 | 32.05 |
| 4744 | 32.03 |
| 4745 | 32.03 |
| 4746 | 32.02 |
| 4747 | 32.02 |
| 4748 | 32.02 |
| 4749 | 32.01 |
| 4750 | 32.01 |
| 4751 | 32.01 |
| 4752 | 32 |
| 4753 | 32 |
| 4754 | 32 |
| 4755 | 31.99 |
| 4756 | 31.99 |
| 4757 | 31.99 |
| 4758 | 31.98 |
| 4759 | 31.98 |
| 4760 | 31.96 |
| 4761 | 31.96 |
| 4762 | 31.95 |
| 4763 | 31.95 |
| 4764 | 31.95 |
| 4765 | 31.95 |
| 4766 | 31.94 |
| 4767 | 31.93 |
| 4768 | 31.93 |
| 4769 | 31.92 |
| 4770 | 31.92 |
| 4771 | 31.92 |
| 4772 | 31.91 |
| 4773 | 31.91 |
| 4774 | 31.91 |
| 4775 | 31.91 |
| 4776 | 31.9 |
| 4777 | 31.9 |
| 4778 | 31.9 |
| 4779 | 31.9 |
| 4780 | 31.89 |
| 4781 | 31.89 |
| 4782 | 31.89 |
| 4783 | 31.88 |
| 4784 | 31.88 |
| 4785 | 31.88 |
| 4786 | 31.87 |
| 4787 | 31.87 |
| 4788 | 31.87 |
| 4789 | 31.87 |
| 4790 | 31.87 |
| 4791 | 31.86 |
| 4792 | 31.86 |
| 4793 | 31.85 |
| 4794 | 31.85 |
| 4795 | 31.85 |
| 4796 | 31.84 |
| 4797 | 31.83 |
| 4798 | 31.83 |
| 4799 | 31.83 |
| 4800 | 31.83 |
| 4801 | 31.82 |
| 4802 | 31.82 |
| 4803 | 31.82 |
| 4804 | 31.82 |
| 4805 | 31.82 |
| 4806 | 31.81 |
| 4807 | 31.8 |
| 4808 | 31.79 |
| 4809 | 31.79 |
| 4810 | 31.79 |
| 4811 | 31.78 |
| 4812 | 31.78 |
| 4813 | 31.78 |
| 4814 | 31.77 |
| 4815 | 31.77 |
| 4816 | 31.76 |
| 4817 | 31.76 |
| 4818 | 31.75 |
| 4819 | 31.74 |
| 4820 | 31.74 |
| 4821 | 31.74 |
| 4822 | 31.73 |
| 4823 | 31.72 |
| 4824 | 31.72 |
| 4825 | 31.72 |
| 4826 | 31.71 |
| 4827 | 31.71 |
| 4828 | 31.71 |
| 4829 | 31.71 |
| 4830 | 31.7 |
| 4831 | 31.7 |
| 4832 | 31.69 |
| 4833 | 31.69 |
| 4834 | 31.69 |
| 4835 | 31.69 |
| 4836 | 31.69 |
| 4837 | 31.68 |
| 4838 | 31.68 |
| 4839 | 31.68 |
| 4840 | 31.67 |
| 4841 | 31.66 |
| 4842 | 31.66 |
| 4843 | 31.64 |
| 4844 | 31.62 |
| 4845 | 31.61 |
| 4846 | 31.61 |
| 4847 | 31.61 |
| 4848 | 31.6 |
| 4849 | 31.6 |
| 4850 | 31.59 |
| 4851 | 31.59 |
| 4852 | 31.59 |
| 4853 | 31.58 |
| 4854 | 31.58 |
| 4855 | 31.57 |
| 4856 | 31.57 |
| 4857 | 31.56 |
| 4858 | 31.55 |
| 4859 | 31.55 |
| 4860 | 31.54 |
| 4861 | 31.54 |
| 4862 | 31.54 |
| 4863 | 31.53 |
| 4864 | 31.53 |
| 4865 | 31.53 |
| 4866 | 31.52 |
| 4867 | 31.52 |
| 4868 | 31.52 |
| 4869 | 31.51 |
| 4870 | 31.51 |
| 4871 | 31.5 |
| 4872 | 31.5 |
| 4873 | 31.49 |
| 4874 | 31.49 |
| 4875 | 31.49 |
| 4876 | 31.48 |
| 4877 | 31.48 |
| 4878 | 31.48 |
| 4879 | 31.47 |
| 4880 | 31.46 |
| 4881 | 31.45 |
| 4882 | 31.45 |
| 4883 | 31.44 |
| 4884 | 31.44 |
| 4885 | 31.44 |
| 4886 | 31.44 |
| 4887 | 31.43 |
| 4888 | 31.43 |
| 4889 | 31.42 |
| 4890 | 31.41 |
| 4891 | 31.41 |
| 4892 | 31.4 |
| 4893 | 31.4 |
| 4894 | 31.39 |
| 4895 | 31.39 |
| 4896 | 31.38 |
| 4897 | 31.38 |
| 4898 | 31.38 |
| 4899 | 31.36 |
| 4900 | 31.36 |
| 4901 | 31.35 |
| 4902 | 31.35 |
| 4903 | 31.35 |
| 4904 | 31.35 |
| 4905 | 31.34 |
| 4906 | 31.34 |
| 4907 | 31.34 |
| 4908 | 31.33 |
| 4909 | 31.33 |
| 4910 | 31.33 |
| 4911 | 31.33 |
| 4912 | 31.32 |
| 4913 | 31.32 |
| 4914 | 31.32 |
| 4915 | 31.32 |
| 4916 | 31.32 |
| 4917 | 31.32 |
| 4918 | 31.3 |
| 4919 | 31.3 |
| 4920 | 31.3 |
| 4921 | 31.3 |
| 4922 | 31.3 |
| 4923 | 31.3 |
| 4924 | 31.3 |
| 4925 | 31.3 |
| 4926 | 31.3 |
| 4927 | 31.29 |
| 4928 | 31.29 |
| 4929 | 31.29 |
| 4930 | 31.29 |
| 4931 | 31.29 |
| 4932 | 31.29 |
| 4933 | 31.28 |
| 4934 | 31.28 |
| 4935 | 31.28 |
| 4936 | 31.28 |
| 4937 | 31.28 |
| 4938 | 31.27 |
| 4939 | 31.27 |
| 4940 | 31.27 |
| 4941 | 31.27 |
| 4942 | 31.27 |
| 4943 | 31.27 |
| 4944 | 31.26 |
| 4945 | 31.26 |
| 4946 | 31.25 |
| 4947 | 31.25 |
| 4948 | 31.25 |
| 4949 | 31.25 |
| 4950 | 31.25 |
| 4951 | 31.25 |
| 4952 | 31.23 |
| 4953 | 31.23 |
| 4954 | 31.22 |
| 4955 | 31.22 |
| 4956 | 31.21 |
| 4957 | 31.2 |
| 4958 | 31.2 |
| 4959 | 31.19 |
| 4960 | 31.19 |
| 4961 | 31.18 |
| 4962 | 31.18 |
| 4963 | 31.18 |
| 4964 | 31.18 |
| 4965 | 31.18 |
| 4966 | 31.17 |
| 4967 | 31.16 |
| 4968 | 31.16 |
| 4969 | 31.15 |
| 4970 | 31.15 |
| 4971 | 31.15 |
| 4972 | 31.15 |
| 4973 | 31.15 |
| 4974 | 31.14 |
| 4975 | 31.14 |
| 4976 | 31.13 |
| 4977 | 31.13 |
| 4978 | 31.13 |
| 4979 | 31.13 |
| 4980 | 31.12 |
| 4981 | 31.12 |
| 4982 | 31.12 |
| 4983 | 31.11 |
| 4984 | 31.11 |
| 4985 | 31.11 |
| 4986 | 31.11 |
| 4987 | 31.11 |
| 4988 | 31.11 |
| 4989 | 31.1 |
| 4990 | 31.1 |
| 4991 | 31.1 |
| 4992 | 31.09 |
| 4993 | 31.09 |
| 4994 | 31.09 |
| 4995 | 31.09 |
| 4996 | 31.09 |
| 4997 | 31.09 |
| 4998 | 31.09 |
| 4999 | 31.08 |
| 5000 | 31.06 |
| 5001 | 31.06 |
| 5002 | 31.06 |
| 5003 | 31.05 |
| 5004 | 31.05 |
| 5005 | 31.05 |
| 5006 | 31.05 |
| 5007 | 31.04 |
| 5008 | 31.03 |
| 5009 | 31.03 |
| 5010 | 31.03 |
| 5011 | 31.03 |
| 5012 | 31.03 |
| 5013 | 31.02 |
| 5014 | 31.02 |
| 5015 | 31.02 |
| 5016 | 31.02 |
| 5017 | 31.02 |
| 5018 | 31.01 |
| 5019 | 30.99 |
| 5020 | 30.98 |
| 5021 | 30.98 |
| 5022 | 30.98 |
| 5023 | 30.97 |
| 5024 | 30.97 |
| 5025 | 30.97 |
| 5026 | 30.96 |
| 5027 | 30.96 |
| 5028 | 30.95 |
| 5029 | 30.95 |
| 5030 | 30.95 |
| 5031 | 30.95 |
| 5032 | 30.95 |
| 5033 | 30.95 |
| 5034 | 30.94 |
| 5035 | 30.93 |
| 5036 | 30.93 |
| 5037 | 30.93 |
| 5038 | 30.93 |
| 5039 | 30.93 |
| 5040 | 30.93 |
| 5041 | 30.92 |
| 5042 | 30.92 |
| 5043 | 30.92 |
| 5044 | 30.92 |
| 5045 | 30.91 |
| 5046 | 30.91 |
| 5047 | 30.91 |
| 5048 | 30.9 |
| 5049 | 30.9 |
| 5050 | 30.89 |
| 5051 | 30.89 |
| 5052 | 30.89 |
| 5053 | 30.88 |
| 5054 | 30.88 |
| 5055 | 30.86 |
| 5056 | 30.86 |
| 5057 | 30.85 |
| 5058 | 30.84 |
| 5059 | 30.84 |
| 5060 | 30.83 |
| 5061 | 30.83 |
| 5062 | 30.82 |
| 5063 | 30.82 |
| 5064 | 30.82 |
| 5065 | 30.82 |
| 5066 | 30.82 |
| 5067 | 30.81 |
| 5068 | 30.81 |
| 5069 | 30.8 |
| 5070 | 30.8 |
| 5071 | 30.8 |
| 5072 | 30.8 |
| 5073 | 30.8 |
| 5074 | 30.8 |
| 5075 | 30.79 |
| 5076 | 30.78 |
| 5077 | 30.78 |
| 5078 | 30.78 |
| 5079 | 30.77 |
| 5080 | 30.77 |
| 5081 | 30.77 |
| 5082 | 30.76 |
| 5083 | 30.75 |
| 5084 | 30.75 |
| 5085 | 30.75 |
| 5086 | 30.75 |
| 5087 | 30.75 |
| 5088 | 30.74 |
| 5089 | 30.73 |
| 5090 | 30.72 |
| 5091 | 30.72 |
| 5092 | 30.72 |
| 5093 | 30.72 |
| 5094 | 30.72 |
| 5095 | 30.71 |
| 5096 | 30.7 |
| 5097 | 30.7 |
| 5098 | 30.7 |
| 5099 | 30.69 |
| 5100 | 30.69 |
| 5101 | 30.68 |
| 5102 | 30.68 |
| 5103 | 30.68 |
| 5104 | 30.68 |
| 5105 | 30.67 |
| 5106 | 30.67 |
| 5107 | 30.66 |
| 5108 | 30.66 |
| 5109 | 30.66 |
| 5110 | 30.66 |
| 5111 | 30.66 |
| 5112 | 30.65 |
| 5113 | 30.65 |
| 5114 | 30.65 |
| 5115 | 30.64 |
| 5116 | 30.64 |
| 5117 | 30.64 |
| 5118 | 30.63 |
| 5119 | 30.63 |
| 5120 | 30.63 |
| 5121 | 30.63 |
| 5122 | 30.63 |
| 5123 | 30.63 |
| 5124 | 30.63 |
| 5125 | 30.63 |
| 5126 | 30.62 |
| 5127 | 30.61 |
| 5128 | 30.61 |
| 5129 | 30.6 |
| 5130 | 30.6 |
| 5131 | 30.6 |
| 5132 | 30.59 |
| 5133 | 30.59 |
| 5134 | 30.59 |
| 5135 | 30.59 |
| 5136 | 30.59 |
| 5137 | 30.58 |
| 5138 | 30.58 |
| 5139 | 30.58 |
| 5140 | 30.57 |
| 5141 | 30.57 |
| 5142 | 30.57 |
| 5143 | 30.57 |
| 5144 | 30.56 |
| 5145 | 30.55 |
| 5146 | 30.55 |
| 5147 | 30.55 |
| 5148 | 30.55 |
| 5149 | 30.55 |
| 5150 | 30.54 |
| 5151 | 30.54 |
| 5152 | 30.53 |
| 5153 | 30.53 |
| 5154 | 30.53 |
| 5155 | 30.53 |
| 5156 | 30.52 |
| 5157 | 30.52 |
| 5158 | 30.52 |
| 5159 | 30.52 |
| 5160 | 30.51 |
| 5161 | 30.51 |
| 5162 | 30.51 |
| 5163 | 30.5 |
| 5164 | 30.5 |
| 5165 | 30.49 |
| 5166 | 30.49 |
| 5167 | 30.49 |
| 5168 | 30.49 |
| 5169 | 30.49 |
| 5170 | 30.49 |
| 5171 | 30.48 |
| 5172 | 30.48 |
| 5173 | 30.48 |
| 5174 | 30.48 |
| 5175 | 30.47 |
| 5176 | 30.47 |
| 5177 | 30.47 |
| 5178 | 30.47 |
| 5179 | 30.47 |
| 5180 | 30.46 |
| 5181 | 30.46 |
| 5182 | 30.45 |
| 5183 | 30.45 |
| 5184 | 30.45 |
| 5185 | 30.44 |
| 5186 | 30.44 |
| 5187 | 30.44 |
| 5188 | 30.44 |
| 5189 | 30.44 |
| 5190 | 30.44 |
| 5191 | 30.44 |
| 5192 | 30.43 |
| 5193 | 30.43 |
| 5194 | 30.43 |
| 5195 | 30.42 |
| 5196 | 30.42 |
| 5197 | 30.41 |
| 5198 | 30.41 |
| 5199 | 30.41 |
| 5200 | 30.41 |
| 5201 | 30.41 |
| 5202 | 30.41 |
| 5203 | 30.41 |
| 5204 | 30.4 |
| 5205 | 30.4 |
| 5206 | 30.4 |
| 5207 | 30.4 |
| 5208 | 30.4 |
| 5209 | 30.4 |
| 5210 | 30.39 |
| 5211 | 30.38 |
| 5212 | 30.38 |
| 5213 | 30.38 |
| 5214 | 30.37 |
| 5215 | 30.37 |
| 5216 | 30.37 |
| 5217 | 30.36 |
| 5218 | 30.36 |
| 5219 | 30.35 |
| 5220 | 30.35 |
| 5221 | 30.35 |
| 5222 | 30.35 |
| 5223 | 30.35 |
| 5224 | 30.35 |
| 5225 | 30.34 |
| 5226 | 30.34 |
| 5227 | 30.34 |
| 5228 | 30.33 |
| 5229 | 30.31 |
| 5230 | 30.31 |
| 5231 | 30.31 |
| 5232 | 30.29 |
| 5233 | 30.29 |
| 5234 | 30.29 |
| 5235 | 30.28 |
| 5236 | 30.28 |
| 5237 | 30.28 |
| 5238 | 30.28 |
| 5239 | 30.28 |
| 5240 | 30.27 |
| 5241 | 30.26 |
| 5242 | 30.26 |
| 5243 | 30.26 |
| 5244 | 30.25 |
| 5245 | 30.25 |
| 5246 | 30.25 |
| 5247 | 30.25 |
| 5248 | 30.25 |
| 5249 | 30.25 |
| 5250 | 30.25 |
| 5251 | 30.25 |
| 5252 | 30.25 |
| 5253 | 30.24 |
| 5254 | 30.24 |
| 5255 | 30.24 |
| 5256 | 30.24 |
| 5257 | 30.23 |
| 5258 | 30.23 |
| 5259 | 30.23 |
| 5260 | 30.22 |
| 5261 | 30.22 |
| 5262 | 30.21 |
| 5263 | 30.21 |
| 5264 | 30.2 |
| 5265 | 30.2 |
| 5266 | 30.2 |
| 5267 | 30.19 |
| 5268 | 30.19 |
| 5269 | 30.19 |
| 5270 | 30.19 |
| 5271 | 30.19 |
| 5272 | 30.19 |
| 5273 | 30.17 |
| 5274 | 30.17 |
| 5275 | 30.17 |
| 5276 | 30.17 |
| 5277 | 30.16 |
| 5278 | 30.16 |
| 5279 | 30.16 |
| 5280 | 30.16 |
| 5281 | 30.16 |
| 5282 | 30.15 |
| 5283 | 30.15 |
| 5284 | 30.15 |
| 5285 | 30.14 |
| 5286 | 30.13 |
| 5287 | 30.13 |
| 5288 | 30.13 |
| 5289 | 30.12 |
| 5290 | 30.12 |
| 5291 | 30.12 |
| 5292 | 30.11 |
| 5293 | 30.11 |
| 5294 | 30.1 |
| 5295 | 30.1 |
| 5296 | 30.09 |
| 5297 | 30.09 |
| 5298 | 30.07 |
| 5299 | 30.07 |
| 5300 | 30.06 |
| 5301 | 30.05 |
| 5302 | 30.05 |
| 5303 | 30.05 |
| 5304 | 30.05 |
| 5305 | 30.04 |
| 5306 | 30.04 |
| 5307 | 30.04 |
| 5308 | 30.03 |
| 5309 | 30.03 |
| 5310 | 30.03 |
| 5311 | 30.02 |
| 5312 | 30.02 |
| 5313 | 30.01 |
| 5314 | 30.01 |
| 5315 | 30.01 |
| 5316 | 30 |
| 5317 | 30 |
| 5318 | 30 |
| 5319 | 30 |
| 5320 | 30 |
| 5321 | 30 |
| 5322 | 30 |
| 5323 | 30 |
| 5324 | 30 |
| 5325 | 30 |
| 5326 | 30 |
| 5327 | 30 |
| 5328 | 30 |
| 5329 | 30 |
| 5330 | 29.99 |
| 5331 | 29.99 |
| 5332 | 29.98 |
| 5333 | 29.98 |
| 5334 | 29.98 |
| 5335 | 29.98 |
| 5336 | 29.97 |
| 5337 | 29.97 |
| 5338 | 29.97 |
| 5339 | 29.97 |
| 5340 | 29.96 |
| 5341 | 29.95 |
| 5342 | 29.94 |
| 5343 | 29.94 |
| 5344 | 29.93 |
| 5345 | 29.92 |
| 5346 | 29.92 |
| 5347 | 29.91 |
| 5348 | 29.91 |
| 5349 | 29.91 |
| 5350 | 29.9 |
| 5351 | 29.9 |
| 5352 | 29.89 |
| 5353 | 29.89 |
| 5354 | 29.89 |
| 5355 | 29.89 |
| 5356 | 29.88 |
| 5357 | 29.88 |
| 5358 | 29.87 |
| 5359 | 29.87 |
| 5360 | 29.87 |
| 5361 | 29.86 |
| 5362 | 29.86 |
| 5363 | 29.86 |
| 5364 | 29.86 |
| 5365 | 29.85 |
| 5366 | 29.85 |
| 5367 | 29.85 |
| 5368 | 29.84 |
| 5369 | 29.84 |
| 5370 | 29.84 |
| 5371 | 29.83 |
| 5372 | 29.82 |
| 5373 | 29.81 |
| 5374 | 29.81 |
| 5375 | 29.81 |
| 5376 | 29.81 |
| 5377 | 29.8 |
| 5378 | 29.79 |
| 5379 | 29.79 |
| 5380 | 29.78 |
| 5381 | 29.78 |
| 5382 | 29.78 |
| 5383 | 29.77 |
| 5384 | 29.76 |
| 5385 | 29.76 |
| 5386 | 29.76 |
| 5387 | 29.76 |
| 5388 | 29.76 |
| 5389 | 29.76 |
| 5390 | 29.76 |
| 5391 | 29.75 |
| 5392 | 29.75 |
| 5393 | 29.75 |
| 5394 | 29.74 |
| 5395 | 29.73 |
| 5396 | 29.73 |
| 5397 | 29.72 |
| 5398 | 29.72 |
| 5399 | 29.72 |
| 5400 | 29.72 |
| 5401 | 29.72 |
| 5402 | 29.72 |
| 5403 | 29.71 |
| 5404 | 29.71 |
| 5405 | 29.7 |
| 5406 | 29.7 |
| 5407 | 29.69 |
| 5408 | 29.69 |
| 5409 | 29.69 |
| 5410 | 29.69 |
| 5411 | 29.68 |
| 5412 | 29.68 |
| 5413 | 29.68 |
| 5414 | 29.67 |
| 5415 | 29.67 |
| 5416 | 29.65 |
| 5417 | 29.64 |
| 5418 | 29.64 |
| 5419 | 29.64 |
| 5420 | 29.63 |
| 5421 | 29.63 |
| 5422 | 29.63 |
| 5423 | 29.63 |
| 5424 | 29.63 |
| 5425 | 29.61 |
| 5426 | 29.61 |
| 5427 | 29.61 |
| 5428 | 29.61 |
| 5429 | 29.6 |
| 5430 | 29.6 |
| 5431 | 29.59 |
| 5432 | 29.58 |
| 5433 | 29.58 |
| 5434 | 29.57 |
| 5435 | 29.57 |
| 5436 | 29.57 |
| 5437 | 29.57 |
| 5438 | 29.57 |
| 5439 | 29.56 |
| 5440 | 29.56 |
| 5441 | 29.55 |
| 5442 | 29.55 |
| 5443 | 29.55 |
| 5444 | 29.55 |
| 5445 | 29.55 |
| 5446 | 29.55 |
| 5447 | 29.54 |
| 5448 | 29.53 |
| 5449 | 29.53 |
| 5450 | 29.53 |
| 5451 | 29.53 |
| 5452 | 29.53 |
| 5453 | 29.52 |
| 5454 | 29.51 |
| 5455 | 29.51 |
| 5456 | 29.5 |
| 5457 | 29.5 |
| 5458 | 29.5 |
| 5459 | 29.5 |
| 5460 | 29.5 |
| 5461 | 29.5 |
| 5462 | 29.49 |
| 5463 | 29.49 |
| 5464 | 29.49 |
| 5465 | 29.48 |
| 5466 | 29.48 |
| 5467 | 29.47 |
| 5468 | 29.47 |
| 5469 | 29.46 |
| 5470 | 29.46 |
| 5471 | 29.45 |
| 5472 | 29.44 |
| 5473 | 29.44 |
| 5474 | 29.44 |
| 5475 | 29.44 |
| 5476 | 29.42 |
| 5477 | 29.42 |
| 5478 | 29.42 |
| 5479 | 29.41 |
| 5480 | 29.41 |
| 5481 | 29.4 |
| 5482 | 29.4 |
| 5483 | 29.4 |
| 5484 | 29.4 |
| 5485 | 29.39 |
| 5486 | 29.39 |
| 5487 | 29.39 |
| 5488 | 29.38 |
| 5489 | 29.38 |
| 5490 | 29.36 |
| 5491 | 29.36 |
| 5492 | 29.36 |
| 5493 | 29.35 |
| 5494 | 29.34 |
| 5495 | 29.34 |
| 5496 | 29.34 |
| 5497 | 29.34 |
| 5498 | 29.33 |
| 5499 | 29.33 |
| 5500 | 29.32 |
| 5501 | 29.32 |
| 5502 | 29.31 |
| 5503 | 29.31 |
| 5504 | 29.31 |
| 5505 | 29.3 |
| 5506 | 29.3 |
| 5507 | 29.29 |
| 5508 | 29.29 |
| 5509 | 29.28 |
| 5510 | 29.28 |
| 5511 | 29.28 |
| 5512 | 29.28 |
| 5513 | 29.27 |
| 5514 | 29.26 |
| 5515 | 29.26 |
| 5516 | 29.25 |
| 5517 | 29.25 |
| 5518 | 29.24 |
| 5519 | 29.24 |
| 5520 | 29.24 |
| 5521 | 29.24 |
| 5522 | 29.24 |
| 5523 | 29.23 |
| 5524 | 29.23 |
| 5525 | 29.22 |
| 5526 | 29.22 |
| 5527 | 29.22 |
| 5528 | 29.22 |
| 5529 | 29.22 |
| 5530 | 29.21 |
| 5531 | 29.21 |
| 5532 | 29.21 |
| 5533 | 29.2 |
| 5534 | 29.2 |
| 5535 | 29.2 |
| 5536 | 29.2 |
| 5537 | 29.19 |
| 5538 | 29.18 |
| 5539 | 29.18 |
| 5540 | 29.17 |
| 5541 | 29.16 |
| 5542 | 29.16 |
| 5543 | 29.15 |
| 5544 | 29.15 |
| 5545 | 29.14 |
| 5546 | 29.14 |
| 5547 | 29.14 |
| 5548 | 29.13 |
| 5549 | 29.13 |
| 5550 | 29.13 |
| 5551 | 29.12 |
| 5552 | 29.1 |
| 5553 | 29.1 |
| 5554 | 29.1 |
| 5555 | 29.09 |
| 5556 | 29.09 |
| 5557 | 29.09 |
| 5558 | 29.08 |
| 5559 | 29.08 |
| 5560 | 29.08 |
| 5561 | 29.08 |
| 5562 | 29.08 |
| 5563 | 29.07 |
| 5564 | 29.06 |
| 5565 | 29.06 |
| 5566 | 29.05 |
| 5567 | 29.04 |
| 5568 | 29.04 |
| 5569 | 29.04 |
| 5570 | 29.03 |
| 5571 | 29.03 |
| 5572 | 29.02 |
| 5573 | 29.01 |
| 5574 | 29 |
| 5575 | 29 |
| 5576 | 29 |
| 5577 | 29 |
| 5578 | 29 |
| 5579 | 29 |
| 5580 | 29 |
| 5581 | 29 |
| 5582 | 29 |
| 5583 | 29 |
| 5584 | 29 |
| 5585 | 29 |
| 5586 | 29 |
| 5587 | 29 |
| 5588 | 29 |
| 5589 | 29 |
| 5590 | 29 |
| 5591 | 29 |
| 5592 | 29 |
| 5593 | 29 |
| 5594 | 29 |
| 5595 | 28.99 |
| 5596 | 28.96 |
| 5597 | 28.96 |
| 5598 | 28.96 |
| 5599 | 28.96 |
| 5600 | 28.96 |
| 5601 | 28.95 |
| 5602 | 28.94 |
| 5603 | 28.94 |
| 5604 | 28.94 |
| 5605 | 28.93 |
| 5606 | 28.92 |
| 5607 | 28.92 |
| 5608 | 28.92 |
| 5609 | 28.91 |
| 5610 | 28.91 |
| 5611 | 28.91 |
| 5612 | 28.9 |
| 5613 | 28.9 |
| 5614 | 28.89 |
| 5615 | 28.89 |
| 5616 | 28.88 |
| 5617 | 28.88 |
| 5618 | 28.86 |
| 5619 | 28.86 |
| 5620 | 28.86 |
| 5621 | 28.86 |
| 5622 | 28.85 |
| 5623 | 28.85 |
| 5624 | 28.84 |
| 5625 | 28.84 |
| 5626 | 28.84 |
| 5627 | 28.84 |
| 5628 | 28.83 |
| 5629 | 28.83 |
| 5630 | 28.82 |
| 5631 | 28.82 |
| 5632 | 28.81 |
| 5633 | 28.8 |
| 5634 | 28.8 |
| 5635 | 28.8 |
| 5636 | 28.8 |
| 5637 | 28.79 |
| 5638 | 28.79 |
| 5639 | 28.78 |
| 5640 | 28.78 |
| 5641 | 28.78 |
| 5642 | 28.78 |
| 5643 | 28.78 |
| 5644 | 28.77 |
| 5645 | 28.74 |
| 5646 | 28.73 |
| 5647 | 28.72 |
| 5648 | 28.72 |
| 5649 | 28.71 |
| 5650 | 28.7 |
| 5651 | 28.7 |
| 5652 | 28.7 |
| 5653 | 28.69 |
| 5654 | 28.69 |
| 5655 | 28.67 |
| 5656 | 28.66 |
| 5657 | 28.65 |
| 5658 | 28.64 |
| 5659 | 28.64 |
| 5660 | 28.64 |
| 5661 | 28.63 |
| 5662 | 28.62 |
| 5663 | 28.62 |
| 5664 | 28.61 |
| 5665 | 28.61 |
| 5666 | 28.6 |
| 5667 | 28.6 |
| 5668 | 28.6 |
| 5669 | 28.59 |
| 5670 | 28.58 |
| 5671 | 28.58 |
| 5672 | 28.57 |
| 5673 | 28.56 |
| 5674 | 28.56 |
| 5675 | 28.56 |
| 5676 | 28.56 |
| 5677 | 28.56 |
| 5678 | 28.55 |
| 5679 | 28.55 |
| 5680 | 28.55 |
| 5681 | 28.55 |
| 5682 | 28.54 |
| 5683 | 28.54 |
| 5684 | 28.54 |
| 5685 | 28.54 |
| 5686 | 28.53 |
| 5687 | 28.53 |
| 5688 | 28.53 |
| 5689 | 28.52 |
| 5690 | 28.52 |
| 5691 | 28.52 |
| 5692 | 28.52 |
| 5693 | 28.52 |
| 5694 | 28.51 |
| 5695 | 28.51 |
| 5696 | 28.51 |
| 5697 | 28.5 |
| 5698 | 28.5 |
| 5699 | 28.5 |
| 5700 | 28.5 |
| 5701 | 28.5 |
| 5702 | 28.49 |
| 5703 | 28.49 |
| 5704 | 28.49 |
| 5705 | 28.48 |
| 5706 | 28.48 |
| 5707 | 28.48 |
| 5708 | 28.48 |
| 5709 | 28.47 |
| 5710 | 28.46 |
| 5711 | 28.46 |
| 5712 | 28.46 |
| 5713 | 28.46 |
| 5714 | 28.46 |
| 5715 | 28.46 |
| 5716 | 28.46 |
| 5717 | 28.45 |
| 5718 | 28.45 |
| 5719 | 28.45 |
| 5720 | 28.45 |
| 5721 | 28.45 |
| 5722 | 28.45 |
| 5723 | 28.45 |
| 5724 | 28.45 |
| 5725 | 28.45 |
| 5726 | 28.44 |
| 5727 | 28.44 |
| 5728 | 28.44 |
| 5729 | 28.43 |
| 5730 | 28.43 |
| 5731 | 28.43 |
| 5732 | 28.43 |
| 5733 | 28.41 |
| 5734 | 28.41 |
| 5735 | 28.4 |
| 5736 | 28.39 |
| 5737 | 28.38 |
| 5738 | 28.37 |
| 5739 | 28.36 |
| 5740 | 28.36 |
| 5741 | 28.36 |
| 5742 | 28.35 |
| 5743 | 28.34 |
| 5744 | 28.34 |
| 5745 | 28.33 |
| 5746 | 28.33 |
| 5747 | 28.33 |
| 5748 | 28.32 |
| 5749 | 28.32 |
| 5750 | 28.32 |
| 5751 | 28.3 |
| 5752 | 28.29 |
| 5753 | 28.29 |
| 5754 | 28.29 |
| 5755 | 28.29 |
| 5756 | 28.28 |
| 5757 | 28.28 |
| 5758 | 28.27 |
| 5759 | 28.26 |
| 5760 | 28.26 |
| 5761 | 28.26 |
| 5762 | 28.26 |
| 5763 | 28.25 |
| 5764 | 28.25 |
| 5765 | 28.25 |
| 5766 | 28.25 |
| 5767 | 28.25 |
| 5768 | 28.24 |
| 5769 | 28.24 |
| 5770 | 28.24 |
| 5771 | 28.24 |
| 5772 | 28.23 |
| 5773 | 28.23 |
| 5774 | 28.23 |
| 5775 | 28.22 |
| 5776 | 28.22 |
| 5777 | 28.21 |
| 5778 | 28.21 |
| 5779 | 28.2 |
| 5780 | 28.2 |
| 5781 | 28.19 |
| 5782 | 28.18 |
| 5783 | 28.17 |
| 5784 | 28.17 |
| 5785 | 28.15 |
| 5786 | 28.14 |
| 5787 | 28.14 |
| 5788 | 28.14 |
| 5789 | 28.12 |
| 5790 | 28.11 |
| 5791 | 28.1 |
| 5792 | 28.09 |
| 5793 | 28.07 |
| 5794 | 28.07 |
| 5795 | 28.07 |
| 5796 | 28.07 |
| 5797 | 28.06 |
| 5798 | 28.06 |
| 5799 | 28.06 |
| 5800 | 28.05 |
| 5801 | 28.05 |
| 5802 | 28.04 |
| 5803 | 28.03 |
| 5804 | 28.03 |
| 5805 | 28.03 |
| 5806 | 28.03 |
| 5807 | 28.03 |
| 5808 | 28.02 |
| 5809 | 28.01 |
| 5810 | 28.01 |
| 5811 | 28.01 |
| 5812 | 28 |
| 5813 | 28 |
| 5814 | 28 |
| 5815 | 28 |
| 5816 | 27.99 |
| 5817 | 27.99 |
| 5818 | 27.99 |
| 5819 | 27.98 |
| 5820 | 27.98 |
| 5821 | 27.97 |
| 5822 | 27.97 |
| 5823 | 27.97 |
| 5824 | 27.97 |
| 5825 | 27.95 |
| 5826 | 27.95 |
| 5827 | 27.94 |
| 5828 | 27.94 |
| 5829 | 27.94 |
| 5830 | 27.93 |
| 5831 | 27.93 |
| 5832 | 27.93 |
| 5833 | 27.93 |
| 5834 | 27.93 |
| 5835 | 27.93 |
| 5836 | 27.92 |
| 5837 | 27.92 |
| 5838 | 27.91 |
| 5839 | 27.91 |
| 5840 | 27.9 |
| 5841 | 27.9 |
| 5842 | 27.89 |
| 5843 | 27.89 |
| 5844 | 27.89 |
| 5845 | 27.89 |
| 5846 | 27.88 |
| 5847 | 27.88 |
| 5848 | 27.86 |
| 5849 | 27.84 |
| 5850 | 27.84 |
| 5851 | 27.84 |
| 5852 | 27.83 |
| 5853 | 27.82 |
| 5854 | 27.82 |
| 5855 | 27.82 |
| 5856 | 27.82 |
| 5857 | 27.81 |
| 5858 | 27.8 |
| 5859 | 27.8 |
| 5860 | 27.8 |
| 5861 | 27.8 |
| 5862 | 27.8 |
| 5863 | 27.79 |
| 5864 | 27.79 |
| 5865 | 27.79 |
| 5866 | 27.78 |
| 5867 | 27.78 |
| 5868 | 27.77 |
| 5869 | 27.76 |
| 5870 | 27.76 |
| 5871 | 27.76 |
| 5872 | 27.75 |
| 5873 | 27.74 |
| 5874 | 27.74 |
| 5875 | 27.74 |
| 5876 | 27.74 |
| 5877 | 27.74 |
| 5878 | 27.74 |
| 5879 | 27.73 |
| 5880 | 27.72 |
| 5881 | 27.71 |
| 5882 | 27.71 |
| 5883 | 27.71 |
| 5884 | 27.71 |
| 5885 | 27.71 |
| 5886 | 27.7 |
| 5887 | 27.69 |
| 5888 | 27.68 |
| 5889 | 27.68 |
| 5890 | 27.67 |
| 5891 | 27.67 |
| 5892 | 27.67 |
| 5893 | 27.67 |
| 5894 | 27.66 |
| 5895 | 27.65 |
| 5896 | 27.65 |
| 5897 | 27.65 |
| 5898 | 27.65 |
| 5899 | 27.64 |
| 5900 | 27.62 |
| 5901 | 27.61 |
| 5902 | 27.61 |
| 5903 | 27.6 |
| 5904 | 27.6 |
| 5905 | 27.58 |
| 5906 | 27.57 |
| 5907 | 27.57 |
| 5908 | 27.56 |
| 5909 | 27.56 |
| 5910 | 27.55 |
| 5911 | 27.53 |
| 5912 | 27.53 |
| 5913 | 27.52 |
| 5914 | 27.52 |
| 5915 | 27.52 |
| 5916 | 27.51 |
| 5917 | 27.51 |
| 5918 | 27.51 |
| 5919 | 27.5 |
| 5920 | 27.5 |
| 5921 | 27.5 |
| 5922 | 27.49 |
| 5923 | 27.49 |
| 5924 | 27.48 |
| 5925 | 27.48 |
| 5926 | 27.48 |
| 5927 | 27.48 |
| 5928 | 27.47 |
| 5929 | 27.47 |
| 5930 | 27.47 |
| 5931 | 27.47 |
| 5932 | 27.46 |
| 5933 | 27.45 |
| 5934 | 27.45 |
| 5935 | 27.45 |
| 5936 | 27.45 |
| 5937 | 27.44 |
| 5938 | 27.44 |
| 5939 | 27.44 |
| 5940 | 27.44 |
| 5941 | 27.43 |
| 5942 | 27.43 |
| 5943 | 27.42 |
| 5944 | 27.42 |
| 5945 | 27.42 |
| 5946 | 27.41 |
| 5947 | 27.41 |
| 5948 | 27.41 |
| 5949 | 27.41 |
| 5950 | 27.4 |
| 5951 | 27.39 |
| 5952 | 27.39 |
| 5953 | 27.38 |
| 5954 | 27.38 |
| 5955 | 27.37 |
| 5956 | 27.37 |
| 5957 | 27.37 |
| 5958 | 27.37 |
| 5959 | 27.37 |
| 5960 | 27.37 |
| 5961 | 27.37 |
| 5962 | 27.36 |
| 5963 | 27.36 |
| 5964 | 27.36 |
| 5965 | 27.35 |
| 5966 | 27.33 |
| 5967 | 27.33 |
| 5968 | 27.33 |
| 5969 | 27.33 |
| 5970 | 27.32 |
| 5971 | 27.32 |
| 5972 | 27.3 |
| 5973 | 27.29 |
| 5974 | 27.29 |
| 5975 | 27.28 |
| 5976 | 27.27 |
| 5977 | 27.26 |
| 5978 | 27.25 |
| 5979 | 27.25 |
| 5980 | 27.25 |
| 5981 | 27.25 |
| 5982 | 27.25 |
| 5983 | 27.25 |
| 5984 | 27.24 |
| 5985 | 27.24 |
| 5986 | 27.23 |
| 5987 | 27.23 |
| 5988 | 27.22 |
| 5989 | 27.2 |
| 5990 | 27.2 |
| 5991 | 27.2 |
| 5992 | 27.2 |
| 5993 | 27.2 |
| 5994 | 27.2 |
| 5995 | 27.2 |
| 5996 | 27.2 |
| 5997 | 27.19 |
| 5998 | 27.19 |
| 5999 | 27.19 |
| 6000 | 27.19 |
| 6001 | 27.19 |
| 6002 | 27.19 |
| 6003 | 27.19 |
| 6004 | 27.19 |
| 6005 | 27.18 |
| 6006 | 27.18 |
| 6007 | 27.17 |
| 6008 | 27.16 |
| 6009 | 27.12 |
| 6010 | 27.11 |
| 6011 | 27.11 |
| 6012 | 27.11 |
| 6013 | 27.11 |
| 6014 | 27.11 |
| 6015 | 27.11 |
| 6016 | 27.09 |
| 6017 | 27.08 |
| 6018 | 27.08 |
| 6019 | 27.07 |
| 6020 | 27.06 |
| 6021 | 27.06 |
| 6022 | 27.06 |
| 6023 | 27.05 |
| 6024 | 27.05 |
| 6025 | 27.05 |
| 6026 | 27.05 |
| 6027 | 27.04 |
| 6028 | 27.04 |
| 6029 | 27.04 |
| 6030 | 27.03 |
| 6031 | 27.03 |
| 6032 | 27.02 |
| 6033 | 27.02 |
| 6034 | 27.02 |
| 6035 | 27.02 |
| 6036 | 27.01 |
| 6037 | 27.01 |
| 6038 | 27 |
| 6039 | 27 |
| 6040 | 27 |
| 6041 | 27 |
| 6042 | 27 |
| 6043 | 27 |
| 6044 | 26.99 |
| 6045 | 26.99 |
| 6046 | 26.99 |
| 6047 | 26.97 |
| 6048 | 26.96 |
| 6049 | 26.95 |
| 6050 | 26.95 |
| 6051 | 26.94 |
| 6052 | 26.94 |
| 6053 | 26.93 |
| 6054 | 26.93 |
| 6055 | 26.93 |
| 6056 | 26.91 |
| 6057 | 26.9 |
| 6058 | 26.9 |
| 6059 | 26.9 |
| 6060 | 26.9 |
| 6061 | 26.9 |
| 6062 | 26.89 |
| 6063 | 26.88 |
| 6064 | 26.88 |
| 6065 | 26.85 |
| 6066 | 26.85 |
| 6067 | 26.85 |
| 6068 | 26.84 |
| 6069 | 26.83 |
| 6070 | 26.82 |
| 6071 | 26.82 |
| 6072 | 26.82 |
| 6073 | 26.82 |
| 6074 | 26.81 |
| 6075 | 26.81 |
| 6076 | 26.81 |
| 6077 | 26.78 |
| 6078 | 26.77 |
| 6079 | 26.77 |
| 6080 | 26.77 |
| 6081 | 26.77 |
| 6082 | 26.77 |
| 6083 | 26.77 |
| 6084 | 26.76 |
| 6085 | 26.76 |
| 6086 | 26.76 |
| 6087 | 26.76 |
| 6088 | 26.75 |
| 6089 | 26.75 |
| 6090 | 26.75 |
| 6091 | 26.73 |
| 6092 | 26.73 |
| 6093 | 26.72 |
| 6094 | 26.72 |
| 6095 | 26.71 |
| 6096 | 26.71 |
| 6097 | 26.71 |
| 6098 | 26.71 |
| 6099 | 26.7 |
| 6100 | 26.69 |
| 6101 | 26.69 |
| 6102 | 26.69 |
| 6103 | 26.69 |
| 6104 | 26.68 |
| 6105 | 26.68 |
| 6106 | 26.68 |
| 6107 | 26.68 |
| 6108 | 26.67 |
| 6109 | 26.66 |
| 6110 | 26.66 |
| 6111 | 26.66 |
| 6112 | 26.65 |
| 6113 | 26.65 |
| 6114 | 26.65 |
| 6115 | 26.64 |
| 6116 | 26.64 |
| 6117 | 26.64 |
| 6118 | 26.63 |
| 6119 | 26.63 |
| 6120 | 26.62 |
| 6121 | 26.62 |
| 6122 | 26.62 |
| 6123 | 26.61 |
| 6124 | 26.61 |
| 6125 | 26.6 |
| 6126 | 26.59 |
| 6127 | 26.59 |
| 6128 | 26.59 |
| 6129 | 26.58 |
| 6130 | 26.57 |
| 6131 | 26.56 |
| 6132 | 26.53 |
| 6133 | 26.52 |
| 6134 | 26.52 |
| 6135 | 26.52 |
| 6136 | 26.49 |
| 6137 | 26.49 |
| 6138 | 26.49 |
| 6139 | 26.49 |
| 6140 | 26.49 |
| 6141 | 26.48 |
| 6142 | 26.47 |
| 6143 | 26.47 |
| 6144 | 26.47 |
| 6145 | 26.46 |
| 6146 | 26.46 |
| 6147 | 26.45 |
| 6148 | 26.45 |
| 6149 | 26.44 |
| 6150 | 26.44 |
| 6151 | 26.44 |
| 6152 | 26.44 |
| 6153 | 26.43 |
| 6154 | 26.43 |
| 6155 | 26.43 |
| 6156 | 26.43 |
| 6157 | 26.42 |
| 6158 | 26.42 |
| 6159 | 26.42 |
| 6160 | 26.42 |
| 6161 | 26.41 |
| 6162 | 26.41 |
| 6163 | 26.41 |
| 6164 | 26.4 |
| 6165 | 26.38 |
| 6166 | 26.38 |
| 6167 | 26.38 |
| 6168 | 26.38 |
| 6169 | 26.38 |
| 6170 | 26.38 |
| 6171 | 26.36 |
| 6172 | 26.36 |
| 6173 | 26.36 |
| 6174 | 26.35 |
| 6175 | 26.35 |
| 6176 | 26.34 |
| 6177 | 26.34 |
| 6178 | 26.33 |
| 6179 | 26.32 |
| 6180 | 26.32 |
| 6181 | 26.32 |
| 6182 | 26.3 |
| 6183 | 26.3 |
| 6184 | 26.3 |
| 6185 | 26.29 |
| 6186 | 26.29 |
| 6187 | 26.29 |
| 6188 | 26.29 |
| 6189 | 26.28 |
| 6190 | 26.28 |
| 6191 | 26.28 |
| 6192 | 26.28 |
| 6193 | 26.27 |
| 6194 | 26.27 |
| 6195 | 26.27 |
| 6196 | 26.27 |
| 6197 | 26.27 |
| 6198 | 26.26 |
| 6199 | 26.26 |
| 6200 | 26.25 |
| 6201 | 26.25 |
| 6202 | 26.25 |
| 6203 | 26.24 |
| 6204 | 26.24 |
| 6205 | 26.24 |
| 6206 | 26.24 |
| 6207 | 26.23 |
| 6208 | 26.22 |
| 6209 | 26.21 |
| 6210 | 26.21 |
| 6211 | 26.21 |
| 6212 | 26.21 |
| 6213 | 26.21 |
| 6214 | 26.2 |
| 6215 | 26.19 |
| 6216 | 26.19 |
| 6217 | 26.19 |
| 6218 | 26.18 |
| 6219 | 26.18 |
| 6220 | 26.17 |
| 6221 | 26.17 |
| 6222 | 26.17 |
| 6223 | 26.17 |
| 6224 | 26.16 |
| 6225 | 26.16 |
| 6226 | 26.16 |
| 6227 | 26.16 |
| 6228 | 26.15 |
| 6229 | 26.15 |
| 6230 | 26.15 |
| 6231 | 26.13 |
| 6232 | 26.13 |
| 6233 | 26.13 |
| 6234 | 26.12 |
| 6235 | 26.09 |
| 6236 | 26.08 |
| 6237 | 26.07 |
| 6238 | 26.07 |
| 6239 | 26.07 |
| 6240 | 26.07 |
| 6241 | 26.05 |
| 6242 | 26.05 |
| 6243 | 26.05 |
| 6244 | 26.04 |
| 6245 | 26.04 |
| 6246 | 26.04 |
| 6247 | 26.03 |
| 6248 | 26.02 |
| 6249 | 26.02 |
| 6250 | 26.02 |
| 6251 | 26.01 |
| 6252 | 26.01 |
| 6253 | 26.01 |
| 6254 | 26.01 |
| 6255 | 26 |
| 6256 | 26 |
| 6257 | 26 |
| 6258 | 26 |
| 6259 | 26 |
| 6260 | 26 |
| 6261 | 25.99 |
| 6262 | 25.99 |
| 6263 | 25.99 |
| 6264 | 25.99 |
| 6265 | 25.98 |
| 6266 | 25.98 |
| 6267 | 25.97 |
| 6268 | 25.97 |
| 6269 | 25.97 |
| 6270 | 25.97 |
| 6271 | 25.97 |
| 6272 | 25.97 |
| 6273 | 25.96 |
| 6274 | 25.95 |
| 6275 | 25.95 |
| 6276 | 25.95 |
| 6277 | 25.95 |
| 6278 | 25.94 |
| 6279 | 25.93 |
| 6280 | 25.92 |
| 6281 | 25.92 |
| 6282 | 25.92 |
| 6283 | 25.92 |
| 6284 | 25.91 |
| 6285 | 25.91 |
| 6286 | 25.89 |
| 6287 | 25.88 |
| 6288 | 25.87 |
| 6289 | 25.87 |
| 6290 | 25.87 |
| 6291 | 25.86 |
| 6292 | 25.86 |
| 6293 | 25.86 |
| 6294 | 25.84 |
| 6295 | 25.84 |
| 6296 | 25.83 |
| 6297 | 25.83 |
| 6298 | 25.83 |
| 6299 | 25.82 |
| 6300 | 25.82 |
| 6301 | 25.82 |
| 6302 | 25.82 |
| 6303 | 25.82 |
| 6304 | 25.81 |
| 6305 | 25.81 |
| 6306 | 25.8 |
| 6307 | 25.8 |
| 6308 | 25.8 |
| 6309 | 25.8 |
| 6310 | 25.8 |
| 6311 | 25.78 |
| 6312 | 25.78 |
| 6313 | 25.78 |
| 6314 | 25.78 |
| 6315 | 25.78 |
| 6316 | 25.77 |
| 6317 | 25.77 |
| 6318 | 25.77 |
| 6319 | 25.76 |
| 6320 | 25.76 |
| 6321 | 25.76 |
| 6322 | 25.76 |
| 6323 | 25.76 |
| 6324 | 25.75 |
| 6325 | 25.75 |
| 6326 | 25.74 |
| 6327 | 25.74 |
| 6328 | 25.74 |
| 6329 | 25.74 |
| 6330 | 25.74 |
| 6331 | 25.74 |
| 6332 | 25.74 |
| 6333 | 25.73 |
| 6334 | 25.73 |
| 6335 | 25.73 |
| 6336 | 25.72 |
| 6337 | 25.72 |
| 6338 | 25.71 |
| 6339 | 25.71 |
| 6340 | 25.7 |
| 6341 | 25.7 |
| 6342 | 25.7 |
| 6343 | 25.69 |
| 6344 | 25.68 |
| 6345 | 25.68 |
| 6346 | 25.68 |
| 6347 | 25.68 |
| 6348 | 25.67 |
| 6349 | 25.66 |
| 6350 | 25.65 |
| 6351 | 25.65 |
| 6352 | 25.64 |
| 6353 | 25.64 |
| 6354 | 25.64 |
| 6355 | 25.63 |
| 6356 | 25.62 |
| 6357 | 25.62 |
| 6358 | 25.62 |
| 6359 | 25.62 |
| 6360 | 25.61 |
| 6361 | 25.6 |
| 6362 | 25.6 |
| 6363 | 25.6 |
| 6364 | 25.6 |
| 6365 | 25.6 |
| 6366 | 25.59 |
| 6367 | 25.58 |
| 6368 | 25.58 |
| 6369 | 25.58 |
| 6370 | 25.58 |
| 6371 | 25.57 |
| 6372 | 25.57 |
| 6373 | 25.57 |
| 6374 | 25.56 |
| 6375 | 25.56 |
| 6376 | 25.55 |
| 6377 | 25.55 |
| 6378 | 25.55 |
| 6379 | 25.54 |
| 6380 | 25.54 |
| 6381 | 25.53 |
| 6382 | 25.51 |
| 6383 | 25.51 |
| 6384 | 25.51 |
| 6385 | 25.51 |
| 6386 | 25.5 |
| 6387 | 25.5 |
| 6388 | 25.5 |
| 6389 | 25.49 |
| 6390 | 25.48 |
| 6391 | 25.47 |
| 6392 | 25.47 |
| 6393 | 25.46 |
| 6394 | 25.46 |
| 6395 | 25.46 |
| 6396 | 25.46 |
| 6397 | 25.46 |
| 6398 | 25.45 |
| 6399 | 25.45 |
| 6400 | 25.44 |
| 6401 | 25.42 |
| 6402 | 25.42 |
| 6403 | 25.42 |
| 6404 | 25.4 |
| 6405 | 25.39 |
| 6406 | 25.39 |
| 6407 | 25.39 |
| 6408 | 25.39 |
| 6409 | 25.39 |
| 6410 | 25.39 |
| 6411 | 25.38 |
| 6412 | 25.38 |
| 6413 | 25.36 |
| 6414 | 25.36 |
| 6415 | 25.35 |
| 6416 | 25.35 |
| 6417 | 25.34 |
| 6418 | 25.34 |
| 6419 | 25.33 |
| 6420 | 25.33 |
| 6421 | 25.33 |
| 6422 | 25.33 |
| 6423 | 25.32 |
| 6424 | 25.32 |
| 6425 | 25.31 |
| 6426 | 25.31 |
| 6427 | 25.3 |
| 6428 | 25.3 |
| 6429 | 25.29 |
| 6430 | 25.29 |
| 6431 | 25.28 |
| 6432 | 25.28 |
| 6433 | 25.28 |
| 6434 | 25.27 |
| 6435 | 25.27 |
| 6436 | 25.27 |
| 6437 | 25.26 |
| 6438 | 25.26 |
| 6439 | 25.26 |
| 6440 | 25.25 |
| 6441 | 25.25 |
| 6442 | 25.25 |
| 6443 | 25.25 |
| 6444 | 25.25 |
| 6445 | 25.24 |
| 6446 | 25.24 |
| 6447 | 25.23 |
| 6448 | 25.23 |
| 6449 | 25.23 |
| 6450 | 25.23 |
| 6451 | 25.21 |
| 6452 | 25.21 |
| 6453 | 25.21 |
| 6454 | 25.21 |
| 6455 | 25.2 |
| 6456 | 25.19 |
| 6457 | 25.19 |
| 6458 | 25.18 |
| 6459 | 25.18 |
| 6460 | 25.17 |
| 6461 | 25.16 |
| 6462 | 25.16 |
| 6463 | 25.16 |
| 6464 | 25.16 |
| 6465 | 25.15 |
| 6466 | 25.15 |
| 6467 | 25.15 |
| 6468 | 25.14 |
| 6469 | 25.13 |
| 6470 | 25.13 |
| 6471 | 25.13 |
| 6472 | 25.13 |
| 6473 | 25.13 |
| 6474 | 25.13 |
| 6475 | 25.12 |
| 6476 | 25.11 |
| 6477 | 25.09 |
| 6478 | 25.08 |
| 6479 | 25.08 |
| 6480 | 25.08 |
| 6481 | 25.07 |
| 6482 | 25.07 |
| 6483 | 25.07 |
| 6484 | 25.07 |
| 6485 | 25.06 |
| 6486 | 25.06 |
| 6487 | 25.05 |
| 6488 | 25.05 |
| 6489 | 25.05 |
| 6490 | 25.05 |
| 6491 | 25.04 |
| 6492 | 25.04 |
| 6493 | 25.04 |
| 6494 | 25.04 |
| 6495 | 25.04 |
| 6496 | 25.03 |
| 6497 | 25.02 |
| 6498 | 25.02 |
| 6499 | 25.02 |
| 6500 | 25.01 |
| 6501 | 25.01 |
| 6502 | 25.01 |
| 6503 | 25 |
| 6504 | 25 |
| 6505 | 25 |
| 6506 | 25 |
| 6507 | 25 |
| 6508 | 25 |
| 6509 | 25 |
| 6510 | 25 |
| 6511 | 25 |
| 6512 | 24.99 |
| 6513 | 24.97 |
| 6514 | 24.96 |
| 6515 | 24.96 |
| 6516 | 24.95 |
| 6517 | 24.95 |
| 6518 | 24.94 |
| 6519 | 24.94 |
| 6520 | 24.93 |
| 6521 | 24.93 |
| 6522 | 24.92 |
| 6523 | 24.91 |
| 6524 | 24.91 |
| 6525 | 24.91 |
| 6526 | 24.9 |
| 6527 | 24.9 |
| 6528 | 24.89 |
| 6529 | 24.88 |
| 6530 | 24.88 |
| 6531 | 24.88 |
| 6532 | 24.87 |
| 6533 | 24.87 |
| 6534 | 24.87 |
| 6535 | 24.86 |
| 6536 | 24.85 |
| 6537 | 24.84 |
| 6538 | 24.84 |
| 6539 | 24.84 |
| 6540 | 24.84 |
| 6541 | 24.84 |
| 6542 | 24.83 |
| 6543 | 24.82 |
| 6544 | 24.82 |
| 6545 | 24.81 |
| 6546 | 24.79 |
| 6547 | 24.79 |
| 6548 | 24.79 |
| 6549 | 24.79 |
| 6550 | 24.79 |
| 6551 | 24.78 |
| 6552 | 24.78 |
| 6553 | 24.78 |
| 6554 | 24.77 |
| 6555 | 24.77 |
| 6556 | 24.77 |
| 6557 | 24.77 |
| 6558 | 24.75 |
| 6559 | 24.75 |
| 6560 | 24.73 |
| 6561 | 24.73 |
| 6562 | 24.72 |
| 6563 | 24.7 |
| 6564 | 24.7 |
| 6565 | 24.68 |
| 6566 | 24.67 |
| 6567 | 24.67 |
| 6568 | 24.64 |
| 6569 | 24.64 |
| 6570 | 24.63 |
| 6571 | 24.63 |
| 6572 | 24.61 |
| 6573 | 24.61 |
| 6574 | 24.61 |
| 6575 | 24.61 |
| 6576 | 24.6 |
| 6577 | 24.6 |
| 6578 | 24.6 |
| 6579 | 24.6 |
| 6580 | 24.58 |
| 6581 | 24.58 |
| 6582 | 24.58 |
| 6583 | 24.58 |
| 6584 | 24.57 |
| 6585 | 24.57 |
| 6586 | 24.57 |
| 6587 | 24.55 |
| 6588 | 24.55 |
| 6589 | 24.55 |
| 6590 | 24.54 |
| 6591 | 24.54 |
| 6592 | 24.53 |
| 6593 | 24.53 |
| 6594 | 24.52 |
| 6595 | 24.52 |
| 6596 | 24.52 |
| 6597 | 24.51 |
| 6598 | 24.5 |
| 6599 | 24.5 |
| 6600 | 24.49 |
| 6601 | 24.49 |
| 6602 | 24.49 |
| 6603 | 24.48 |
| 6604 | 24.48 |
| 6605 | 24.48 |
| 6606 | 24.48 |
| 6607 | 24.47 |
| 6608 | 24.47 |
| 6609 | 24.47 |
| 6610 | 24.47 |
| 6611 | 24.46 |
| 6612 | 24.45 |
| 6613 | 24.45 |
| 6614 | 24.45 |
| 6615 | 24.44 |
| 6616 | 24.43 |
| 6617 | 24.43 |
| 6618 | 24.42 |
| 6619 | 24.42 |
| 6620 | 24.41 |
| 6621 | 24.41 |
| 6622 | 24.41 |
| 6623 | 24.4 |
| 6624 | 24.39 |
| 6625 | 24.39 |
| 6626 | 24.39 |
| 6627 | 24.39 |
| 6628 | 24.39 |
| 6629 | 24.38 |
| 6630 | 24.37 |
| 6631 | 24.36 |
| 6632 | 24.35 |
| 6633 | 24.35 |
| 6634 | 24.34 |
| 6635 | 24.34 |
| 6636 | 24.33 |
| 6637 | 24.33 |
| 6638 | 24.33 |
| 6639 | 24.32 |
| 6640 | 24.31 |
| 6641 | 24.31 |
| 6642 | 24.31 |
| 6643 | 24.31 |
| 6644 | 24.3 |
| 6645 | 24.29 |
| 6646 | 24.29 |
| 6647 | 24.28 |
| 6648 | 24.28 |
| 6649 | 24.28 |
| 6650 | 24.28 |
| 6651 | 24.27 |
| 6652 | 24.27 |
| 6653 | 24.26 |
| 6654 | 24.26 |
| 6655 | 24.26 |
| 6656 | 24.26 |
| 6657 | 24.25 |
| 6658 | 24.25 |
| 6659 | 24.25 |
| 6660 | 24.24 |
| 6661 | 24.24 |
| 6662 | 24.23 |
| 6663 | 24.22 |
| 6664 | 24.21 |
| 6665 | 24.21 |
| 6666 | 24.21 |
| 6667 | 24.2 |
| 6668 | 24.2 |
| 6669 | 24.2 |
| 6670 | 24.2 |
| 6671 | 24.2 |
| 6672 | 24.2 |
| 6673 | 24.19 |
| 6674 | 24.17 |
| 6675 | 24.17 |
| 6676 | 24.17 |
| 6677 | 24.17 |
| 6678 | 24.16 |
| 6679 | 24.16 |
| 6680 | 24.15 |
| 6681 | 24.15 |
| 6682 | 24.15 |
| 6683 | 24.14 |
| 6684 | 24.14 |
| 6685 | 24.14 |
| 6686 | 24.12 |
| 6687 | 24.12 |
| 6688 | 24.11 |
| 6689 | 24.1 |
| 6690 | 24.09 |
| 6691 | 24.09 |
| 6692 | 24.08 |
| 6693 | 24.08 |
| 6694 | 24.07 |
| 6695 | 24.07 |
| 6696 | 24.06 |
| 6697 | 24.05 |
| 6698 | 24.05 |
| 6699 | 24.04 |
| 6700 | 24.04 |
| 6701 | 24.04 |
| 6702 | 24.03 |
| 6703 | 24.02 |
| 6704 | 24.01 |
| 6705 | 24.01 |
| 6706 | 24 |
| 6707 | 24 |
| 6708 | 23.99 |
| 6709 | 23.99 |
| 6710 | 23.99 |
| 6711 | 23.98 |
| 6712 | 23.98 |
| 6713 | 23.97 |
| 6714 | 23.97 |
| 6715 | 23.97 |
| 6716 | 23.96 |
| 6717 | 23.96 |
| 6718 | 23.95 |
| 6719 | 23.94 |
| 6720 | 23.94 |
| 6721 | 23.94 |
| 6722 | 23.92 |
| 6723 | 23.91 |
| 6724 | 23.91 |
| 6725 | 23.91 |
| 6726 | 23.91 |
| 6727 | 23.91 |
| 6728 | 23.91 |
| 6729 | 23.9 |
| 6730 | 23.9 |
| 6731 | 23.9 |
| 6732 | 23.9 |
| 6733 | 23.89 |
| 6734 | 23.89 |
| 6735 | 23.88 |
| 6736 | 23.87 |
| 6737 | 23.87 |
| 6738 | 23.87 |
| 6739 | 23.87 |
| 6740 | 23.87 |
| 6741 | 23.86 |
| 6742 | 23.85 |
| 6743 | 23.85 |
| 6744 | 23.83 |
| 6745 | 23.82 |
| 6746 | 23.82 |
| 6747 | 23.81 |
| 6748 | 23.81 |
| 6749 | 23.81 |
| 6750 | 23.8 |
| 6751 | 23.79 |
| 6752 | 23.79 |
| 6753 | 23.79 |
| 6754 | 23.78 |
| 6755 | 23.78 |
| 6756 | 23.77 |
| 6757 | 23.76 |
| 6758 | 23.76 |
| 6759 | 23.74 |
| 6760 | 23.74 |
| 6761 | 23.74 |
| 6762 | 23.71 |
| 6763 | 23.71 |
| 6764 | 23.7 |
| 6765 | 23.69 |
| 6766 | 23.68 |
| 6767 | 23.68 |
| 6768 | 23.68 |
| 6769 | 23.67 |
| 6770 | 23.67 |
| 6771 | 23.66 |
| 6772 | 23.66 |
| 6773 | 23.66 |
| 6774 | 23.66 |
| 6775 | 23.66 |
| 6776 | 23.65 |
| 6777 | 23.65 |
| 6778 | 23.63 |
| 6779 | 23.63 |
| 6780 | 23.62 |
| 6781 | 23.62 |
| 6782 | 23.61 |
| 6783 | 23.61 |
| 6784 | 23.6 |
| 6785 | 23.6 |
| 6786 | 23.6 |
| 6787 | 23.59 |
| 6788 | 23.58 |
| 6789 | 23.57 |
| 6790 | 23.57 |
| 6791 | 23.56 |
| 6792 | 23.56 |
| 6793 | 23.56 |
| 6794 | 23.55 |
| 6795 | 23.55 |
| 6796 | 23.55 |
| 6797 | 23.54 |
| 6798 | 23.54 |
| 6799 | 23.54 |
| 6800 | 23.53 |
| 6801 | 23.51 |
| 6802 | 23.5 |
| 6803 | 23.5 |
| 6804 | 23.5 |
| 6805 | 23.48 |
| 6806 | 23.48 |
| 6807 | 23.48 |
| 6808 | 23.47 |
| 6809 | 23.47 |
| 6810 | 23.47 |
| 6811 | 23.46 |
| 6812 | 23.46 |
| 6813 | 23.44 |
| 6814 | 23.43 |
| 6815 | 23.41 |
| 6816 | 23.41 |
| 6817 | 23.41 |
| 6818 | 23.41 |
| 6819 | 23.41 |
| 6820 | 23.4 |
| 6821 | 23.4 |
| 6822 | 23.4 |
| 6823 | 23.39 |
| 6824 | 23.39 |
| 6825 | 23.39 |
| 6826 | 23.39 |
| 6827 | 23.39 |
| 6828 | 23.38 |
| 6829 | 23.37 |
| 6830 | 23.36 |
| 6831 | 23.36 |
| 6832 | 23.35 |
| 6833 | 23.35 |
| 6834 | 23.34 |
| 6835 | 23.34 |
| 6836 | 23.34 |
| 6837 | 23.33 |
| 6838 | 23.33 |
| 6839 | 23.33 |
| 6840 | 23.32 |
| 6841 | 23.32 |
| 6842 | 23.32 |
| 6843 | 23.32 |
| 6844 | 23.31 |
| 6845 | 23.3 |
| 6846 | 23.3 |
| 6847 | 23.3 |
| 6848 | 23.29 |
| 6849 | 23.29 |
| 6850 | 23.29 |
| 6851 | 23.28 |
| 6852 | 23.28 |
| 6853 | 23.28 |
| 6854 | 23.26 |
| 6855 | 23.25 |
| 6856 | 23.25 |
| 6857 | 23.25 |
| 6858 | 23.25 |
| 6859 | 23.25 |
| 6860 | 23.25 |
| 6861 | 23.25 |
| 6862 | 23.25 |
| 6863 | 23.25 |
| 6864 | 23.25 |
| 6865 | 23.25 |
| 6866 | 23.25 |
| 6867 | 23.25 |
| 6868 | 23.25 |
| 6869 | 23.25 |
| 6870 | 23.25 |
| 6871 | 23.25 |
| 6872 | 23.25 |
| 6873 | 23.25 |
| 6874 | 23.25 |
| 6875 | 23.25 |
| 6876 | 23.25 |
| 6877 | 23.25 |
| 6878 | 23.25 |
| 6879 | 23.25 |
| 6880 | 23.25 |
| 6881 | 23.25 |
| 6882 | 23.25 |
| 6883 | 23.25 |
| 6884 | 23.25 |
| 6885 | 23.25 |
| 6886 | 23.25 |
| 6887 | 23.25 |
| 6888 | 23.25 |
| 6889 | 23.25 |
| 6890 | 23.25 |
| 6891 | 23.25 |
| 6892 | 23.25 |
| 6893 | 23.25 |
| 6894 | 23.25 |
| 6895 | 23.25 |
| 6896 | 23.25 |
| 6897 | 23.25 |
| 6898 | 23.25 |
| 6899 | 23.25 |
| 6900 | 23.25 |
| 6901 | 23.25 |
| 6902 | 23.25 |
| 6903 | 23.25 |
| 6904 | 23.25 |
| 6905 | 23.24 |
| 6906 | 23.24 |
| 6907 | 23.23 |
| 6908 | 23.23 |
| 6909 | 23.22 |
| 6910 | 23.22 |
| 6911 | 23.22 |
| 6912 | 23.21 |
| 6913 | 23.19 |
| 6914 | 23.18 |
| 6915 | 23.17 |
| 6916 | 23.17 |
| 6917 | 23.17 |
| 6918 | 23.17 |
| 6919 | 23.15 |
| 6920 | 23.14 |
| 6921 | 23.14 |
| 6922 | 23.14 |
| 6923 | 23.14 |
| 6924 | 23.14 |
| 6925 | 23.13 |
| 6926 | 23.13 |
| 6927 | 23.12 |
| 6928 | 23.11 |
| 6929 | 23.1 |
| 6930 | 23.1 |
| 6931 | 23.09 |
| 6932 | 23.09 |
| 6933 | 23.09 |
| 6934 | 23.08 |
| 6935 | 23.08 |
| 6936 | 23.07 |
| 6937 | 23.06 |
| 6938 | 23.06 |
| 6939 | 23.06 |
| 6940 | 23.05 |
| 6941 | 23.04 |
| 6942 | 23.04 |
| 6943 | 23.04 |
| 6944 | 23.04 |
| 6945 | 23.04 |
| 6946 | 23.03 |
| 6947 | 23.01 |
| 6948 | 22.98 |
| 6949 | 22.98 |
| 6950 | 22.97 |
| 6951 | 22.97 |
| 6952 | 22.97 |
| 6953 | 22.97 |
| 6954 | 22.96 |
| 6955 | 22.95 |
| 6956 | 22.95 |
| 6957 | 22.95 |
| 6958 | 22.95 |
| 6959 | 22.91 |
| 6960 | 22.91 |
| 6961 | 22.91 |
| 6962 | 22.9 |
| 6963 | 22.89 |
| 6964 | 22.89 |
| 6965 | 22.89 |
| 6966 | 22.89 |
| 6967 | 22.89 |
| 6968 | 22.88 |
| 6969 | 22.88 |
| 6970 | 22.88 |
| 6971 | 22.88 |
| 6972 | 22.88 |
| 6973 | 22.87 |
| 6974 | 22.87 |
| 6975 | 22.86 |
| 6976 | 22.86 |
| 6977 | 22.86 |
| 6978 | 22.85 |
| 6979 | 22.84 |
| 6980 | 22.84 |
| 6981 | 22.83 |
| 6982 | 22.83 |
| 6983 | 22.81 |
| 6984 | 22.81 |
| 6985 | 22.81 |
| 6986 | 22.8 |
| 6987 | 22.79 |
| 6988 | 22.79 |
| 6989 | 22.79 |
| 6990 | 22.78 |
| 6991 | 22.78 |
| 6992 | 22.77 |
| 6993 | 22.77 |
| 6994 | 22.76 |
| 6995 | 22.76 |
| 6996 | 22.76 |
| 6997 | 22.75 |
| 6998 | 22.75 |
| 6999 | 22.75 |
| 7000 | 22.74 |
| 7001 | 22.74 |
| 7002 | 22.74 |
| 7003 | 22.73 |
| 7004 | 22.73 |
| 7005 | 22.73 |
| 7006 | 22.72 |
| 7007 | 22.71 |
| 7008 | 22.71 |
| 7009 | 22.7 |
| 7010 | 22.7 |
| 7011 | 22.7 |
| 7012 | 22.7 |
| 7013 | 22.7 |
| 7014 | 22.7 |
| 7015 | 22.69 |
| 7016 | 22.69 |
| 7017 | 22.69 |
| 7018 | 22.69 |
| 7019 | 22.68 |
| 7020 | 22.68 |
| 7021 | 22.68 |
| 7022 | 22.67 |
| 7023 | 22.67 |
| 7024 | 22.67 |
| 7025 | 22.67 |
| 7026 | 22.67 |
| 7027 | 22.67 |
| 7028 | 22.66 |
| 7029 | 22.65 |
| 7030 | 22.65 |
| 7031 | 22.64 |
| 7032 | 22.64 |
| 7033 | 22.64 |
| 7034 | 22.64 |
| 7035 | 22.64 |
| 7036 | 22.63 |
| 7037 | 22.63 |
| 7038 | 22.62 |
| 7039 | 22.62 |
| 7040 | 22.62 |
| 7041 | 22.61 |
| 7042 | 22.61 |
| 7043 | 22.61 |
| 7044 | 22.61 |
| 7045 | 22.61 |
| 7046 | 22.6 |
| 7047 | 22.6 |
| 7048 | 22.6 |
| 7049 | 22.6 |
| 7050 | 22.6 |
| 7051 | 22.6 |
| 7052 | 22.6 |
| 7053 | 22.59 |
| 7054 | 22.59 |
| 7055 | 22.59 |
| 7056 | 22.59 |
| 7057 | 22.59 |
| 7058 | 22.59 |
| 7059 | 22.58 |
| 7060 | 22.58 |
| 7061 | 22.58 |
| 7062 | 22.58 |
| 7063 | 22.58 |
| 7064 | 22.57 |
| 7065 | 22.57 |
| 7066 | 22.57 |
| 7067 | 22.57 |
| 7068 | 22.56 |
| 7069 | 22.56 |
| 7070 | 22.56 |
| 7071 | 22.56 |
| 7072 | 22.55 |
| 7073 | 22.54 |
| 7074 | 22.54 |
| 7075 | 22.54 |
| 7076 | 22.54 |
| 7077 | 22.53 |
| 7078 | 22.53 |
| 7079 | 22.53 |
| 7080 | 22.52 |
| 7081 | 22.52 |
| 7082 | 22.52 |
| 7083 | 22.52 |
| 7084 | 22.52 |
| 7085 | 22.5 |
| 7086 | 22.5 |
| 7087 | 22.5 |
| 7088 | 22.5 |
| 7089 | 22.49 |
| 7090 | 22.49 |
| 7091 | 22.49 |
| 7092 | 22.49 |
| 7093 | 22.48 |
| 7094 | 22.48 |
| 7095 | 22.48 |
| 7096 | 22.48 |
| 7097 | 22.47 |
| 7098 | 22.47 |
| 7099 | 22.46 |
| 7100 | 22.46 |
| 7101 | 22.45 |
| 7102 | 22.45 |
| 7103 | 22.45 |
| 7104 | 22.45 |
| 7105 | 22.44 |
| 7106 | 22.44 |
| 7107 | 22.44 |
| 7108 | 22.44 |
| 7109 | 22.44 |
| 7110 | 22.44 |
| 7111 | 22.44 |
| 7112 | 22.44 |
| 7113 | 22.43 |
| 7114 | 22.42 |
| 7115 | 22.42 |
| 7116 | 22.42 |
| 7117 | 22.42 |
| 7118 | 22.42 |
| 7119 | 22.41 |
| 7120 | 22.41 |
| 7121 | 22.41 |
| 7122 | 22.41 |
| 7123 | 22.4 |
| 7124 | 22.4 |
| 7125 | 22.4 |
| 7126 | 22.39 |
| 7127 | 22.39 |
| 7128 | 22.38 |
| 7129 | 22.38 |
| 7130 | 22.38 |
| 7131 | 22.38 |
| 7132 | 22.37 |
| 7133 | 22.37 |
| 7134 | 22.37 |
| 7135 | 22.37 |
| 7136 | 22.36 |
| 7137 | 22.36 |
| 7138 | 22.35 |
| 7139 | 22.35 |
| 7140 | 22.35 |
| 7141 | 22.35 |
| 7142 | 22.35 |
| 7143 | 22.35 |
| 7144 | 22.35 |
| 7145 | 22.34 |
| 7146 | 22.34 |
| 7147 | 22.34 |
| 7148 | 22.33 |
| 7149 | 22.33 |
| 7150 | 22.33 |
| 7151 | 22.33 |
| 7152 | 22.32 |
| 7153 | 22.3 |
| 7154 | 22.3 |
| 7155 | 22.3 |
| 7156 | 22.3 |
| 7157 | 22.29 |
| 7158 | 22.29 |
| 7159 | 22.27 |
| 7160 | 22.26 |
| 7161 | 22.26 |
| 7162 | 22.25 |
| 7163 | 22.25 |
| 7164 | 22.25 |
| 7165 | 22.25 |
| 7166 | 22.25 |
| 7167 | 22.25 |
| 7168 | 22.25 |
| 7169 | 22.25 |
| 7170 | 22.25 |
| 7171 | 22.25 |
| 7172 | 22.25 |
| 7173 | 22.25 |
| 7174 | 22.25 |
| 7175 | 22.25 |
| 7176 | 22.25 |
| 7177 | 22.24 |
| 7178 | 22.24 |
| 7179 | 22.24 |
| 7180 | 22.24 |
| 7181 | 22.24 |
| 7182 | 22.24 |
| 7183 | 22.24 |
| 7184 | 22.23 |
| 7185 | 22.23 |
| 7186 | 22.23 |
| 7187 | 22.23 |
| 7188 | 22.23 |
| 7189 | 22.22 |
| 7190 | 22.22 |
| 7191 | 22.22 |
| 7192 | 22.22 |
| 7193 | 22.22 |
| 7194 | 22.22 |
| 7195 | 22.21 |
| 7196 | 22.21 |
| 7197 | 22.21 |
| 7198 | 22.21 |
| 7199 | 22.2 |
| 7200 | 22.2 |
| 7201 | 22.2 |
| 7202 | 22.2 |
| 7203 | 22.19 |
| 7204 | 22.19 |
| 7205 | 22.19 |
| 7206 | 22.18 |
| 7207 | 22.18 |
| 7208 | 22.17 |
| 7209 | 22.17 |
| 7210 | 22.17 |
| 7211 | 22.17 |
| 7212 | 22.16 |
| 7213 | 22.16 |
| 7214 | 22.16 |
| 7215 | 22.16 |
| 7216 | 22.16 |
| 7217 | 22.15 |
| 7218 | 22.15 |
| 7219 | 22.14 |
| 7220 | 22.14 |
| 7221 | 22.14 |
| 7222 | 22.14 |
| 7223 | 22.14 |
| 7224 | 22.14 |
| 7225 | 22.13 |
| 7226 | 22.13 |
| 7227 | 22.12 |
| 7228 | 22.12 |
| 7229 | 22.11 |
| 7230 | 22.11 |
| 7231 | 22.11 |
| 7232 | 22.11 |
| 7233 | 22.09 |
| 7234 | 22.09 |
| 7235 | 22.09 |
| 7236 | 22.08 |
| 7237 | 22.08 |
| 7238 | 22.08 |
| 7239 | 22.07 |
| 7240 | 22.07 |
| 7241 | 22.07 |
| 7242 | 22.07 |
| 7243 | 22.06 |
| 7244 | 22.05 |
| 7245 | 22.05 |
| 7246 | 22.05 |
| 7247 | 22.05 |
| 7248 | 22.05 |
| 7249 | 22.04 |
| 7250 | 22.03 |
| 7251 | 22.03 |
| 7252 | 22.03 |
| 7253 | 22.03 |
| 7254 | 22.02 |
| 7255 | 22.02 |
| 7256 | 22.01 |
| 7257 | 22.01 |
| 7258 | 22 |
| 7259 | 22 |
| 7260 | 22 |
| 7261 | 22 |
| 7262 | 22 |
| 7263 | 22 |
| 7264 | 21.99 |
| 7265 | 21.99 |
| 7266 | 21.99 |
| 7267 | 21.99 |
| 7268 | 21.99 |
| 7269 | 21.98 |
| 7270 | 21.98 |
| 7271 | 21.98 |
| 7272 | 21.98 |
| 7273 | 21.98 |
| 7274 | 21.98 |
| 7275 | 21.98 |
| 7276 | 21.97 |
| 7277 | 21.97 |
| 7278 | 21.97 |
| 7279 | 21.97 |
| 7280 | 21.96 |
| 7281 | 21.96 |
| 7282 | 21.96 |
| 7283 | 21.95 |
| 7284 | 21.95 |
| 7285 | 21.94 |
| 7286 | 21.93 |
| 7287 | 21.93 |
| 7288 | 21.93 |
| 7289 | 21.93 |
| 7290 | 21.92 |
| 7291 | 21.91 |
| 7292 | 21.91 |
| 7293 | 21.91 |
| 7294 | 21.9 |
| 7295 | 21.9 |
| 7296 | 21.9 |
| 7297 | 21.9 |
| 7298 | 21.89 |
| 7299 | 21.88 |
| 7300 | 21.88 |
| 7301 | 21.88 |
| 7302 | 21.88 |
| 7303 | 21.88 |
| 7304 | 21.87 |
| 7305 | 21.86 |
| 7306 | 21.86 |
| 7307 | 21.85 |
| 7308 | 21.85 |
| 7309 | 21.85 |
| 7310 | 21.84 |
| 7311 | 21.84 |
| 7312 | 21.83 |
| 7313 | 21.83 |
| 7314 | 21.82 |
| 7315 | 21.82 |
| 7316 | 21.82 |
| 7317 | 21.82 |
| 7318 | 21.81 |
| 7319 | 21.81 |
| 7320 | 21.81 |
| 7321 | 21.81 |
| 7322 | 21.8 |
| 7323 | 21.8 |
| 7324 | 21.78 |
| 7325 | 21.78 |
| 7326 | 21.78 |
| 7327 | 21.77 |
| 7328 | 21.77 |
| 7329 | 21.76 |
| 7330 | 21.76 |
| 7331 | 21.76 |
| 7332 | 21.75 |
| 7333 | 21.74 |
| 7334 | 21.74 |
| 7335 | 21.73 |
| 7336 | 21.73 |
| 7337 | 21.72 |
| 7338 | 21.72 |
| 7339 | 21.71 |
| 7340 | 21.71 |
| 7341 | 21.71 |
| 7342 | 21.71 |
| 7343 | 21.71 |
| 7344 | 21.71 |
| 7345 | 21.7 |
| 7346 | 21.7 |
| 7347 | 21.7 |
| 7348 | 21.69 |
| 7349 | 21.69 |
| 7350 | 21.69 |
| 7351 | 21.68 |
| 7352 | 21.68 |
| 7353 | 21.67 |
| 7354 | 21.65 |
| 7355 | 21.65 |
| 7356 | 21.65 |
| 7357 | 21.64 |
| 7358 | 21.64 |
| 7359 | 21.64 |
| 7360 | 21.64 |
| 7361 | 21.64 |
| 7362 | 21.61 |
| 7363 | 21.61 |
| 7364 | 21.6 |
| 7365 | 21.6 |
| 7366 | 21.6 |
| 7367 | 21.59 |
| 7368 | 21.59 |
| 7369 | 21.58 |
| 7370 | 21.58 |
| 7371 | 21.57 |
| 7372 | 21.57 |
| 7373 | 21.57 |
| 7374 | 21.56 |
| 7375 | 21.56 |
| 7376 | 21.55 |
| 7377 | 21.55 |
| 7378 | 21.55 |
| 7379 | 21.54 |
| 7380 | 21.52 |
| 7381 | 21.52 |
| 7382 | 21.5 |
| 7383 | 21.5 |
| 7384 | 21.49 |
| 7385 | 21.47 |
| 7386 | 21.47 |
| 7387 | 21.46 |
| 7388 | 21.46 |
| 7389 | 21.45 |
| 7390 | 21.44 |
| 7391 | 21.41 |
| 7392 | 21.4 |
| 7393 | 21.4 |
| 7394 | 21.4 |
| 7395 | 21.39 |
| 7396 | 21.39 |
| 7397 | 21.39 |
| 7398 | 21.39 |
| 7399 | 21.38 |
| 7400 | 21.38 |
| 7401 | 21.36 |
| 7402 | 21.35 |
| 7403 | 21.34 |
| 7404 | 21.33 |
| 7405 | 21.33 |
| 7406 | 21.33 |
| 7407 | 21.33 |
| 7408 | 21.33 |
| 7409 | 21.32 |
| 7410 | 21.28 |
| 7411 | 21.27 |
| 7412 | 21.27 |
| 7413 | 21.27 |
| 7414 | 21.27 |
| 7415 | 21.25 |
| 7416 | 21.24 |
| 7417 | 21.22 |
| 7418 | 21.22 |
| 7419 | 21.22 |
| 7420 | 21.21 |
| 7421 | 21.21 |
| 7422 | 21.2 |
| 7423 | 21.2 |
| 7424 | 21.19 |
| 7425 | 21.19 |
| 7426 | 21.18 |
| 7427 | 21.17 |
| 7428 | 21.17 |
| 7429 | 21.16 |
| 7430 | 21.16 |
| 7431 | 21.15 |
| 7432 | 21.15 |
| 7433 | 21.15 |
| 7434 | 21.14 |
| 7435 | 21.13 |
| 7436 | 21.13 |
| 7437 | 21.13 |
| 7438 | 21.13 |
| 7439 | 21.13 |
| 7440 | 21.12 |
| 7441 | 21.12 |
| 7442 | 21.11 |
| 7443 | 21.11 |
| 7444 | 21.1 |
| 7445 | 21.1 |
| 7446 | 21.1 |
| 7447 | 21.09 |
| 7448 | 21.09 |
| 7449 | 21.08 |
| 7450 | 21.08 |
| 7451 | 21.07 |
| 7452 | 21.05 |
| 7453 | 21.05 |
| 7454 | 21.01 |
| 7455 | 21.01 |
| 7456 | 21.01 |
| 7457 | 21.01 |
| 7458 | 21 |
| 7459 | 21 |
| 7460 | 21 |
| 7461 | 21 |
| 7462 | 20.98 |
| 7463 | 20.97 |
| 7464 | 20.97 |
| 7465 | 20.96 |
| 7466 | 20.95 |
| 7467 | 20.95 |
| 7468 | 20.95 |
| 7469 | 20.95 |
| 7470 | 20.93 |
| 7471 | 20.91 |
| 7472 | 20.9 |
| 7473 | 20.9 |
| 7474 | 20.9 |
| 7475 | 20.89 |
| 7476 | 20.89 |
| 7477 | 20.89 |
| 7478 | 20.89 |
| 7479 | 20.88 |
| 7480 | 20.86 |
| 7481 | 20.85 |
| 7482 | 20.84 |
| 7483 | 20.84 |
| 7484 | 20.83 |
| 7485 | 20.83 |
| 7486 | 20.82 |
| 7487 | 20.81 |
| 7488 | 20.81 |
| 7489 | 20.8 |
| 7490 | 20.79 |
| 7491 | 20.79 |
| 7492 | 20.79 |
| 7493 | 20.79 |
| 7494 | 20.79 |
| 7495 | 20.79 |
| 7496 | 20.78 |
| 7497 | 20.78 |
| 7498 | 20.76 |
| 7499 | 20.76 |
| 7500 | 20.76 |
| 7501 | 20.75 |
| 7502 | 20.75 |
| 7503 | 20.74 |
| 7504 | 20.73 |
| 7505 | 20.71 |
| 7506 | 20.7 |
| 7507 | 20.69 |
| 7508 | 20.69 |
| 7509 | 20.68 |
| 7510 | 20.67 |
| 7511 | 20.67 |
| 7512 | 20.66 |
| 7513 | 20.65 |
| 7514 | 20.64 |
| 7515 | 20.63 |
| 7516 | 20.62 |
| 7517 | 20.61 |
| 7518 | 20.61 |
| 7519 | 20.6 |
| 7520 | 20.6 |
| 7521 | 20.59 |
| 7522 | 20.59 |
| 7523 | 20.58 |
| 7524 | 20.57 |
| 7525 | 20.57 |
| 7526 | 20.57 |
| 7527 | 20.56 |
| 7528 | 20.56 |
| 7529 | 20.55 |
| 7530 | 20.55 |
| 7531 | 20.55 |
| 7532 | 20.55 |
| 7533 | 20.54 |
| 7534 | 20.54 |
| 7535 | 20.54 |
| 7536 | 20.54 |
| 7537 | 20.53 |
| 7538 | 20.53 |
| 7539 | 20.52 |
| 7540 | 20.52 |
| 7541 | 20.51 |
| 7542 | 20.51 |
| 7543 | 20.51 |
| 7544 | 20.5 |
| 7545 | 20.49 |
| 7546 | 20.48 |
| 7547 | 20.48 |
| 7548 | 20.47 |
| 7549 | 20.47 |
| 7550 | 20.46 |
| 7551 | 20.46 |
| 7552 | 20.46 |
| 7553 | 20.45 |
| 7554 | 20.45 |
| 7555 | 20.44 |
| 7556 | 20.44 |
| 7557 | 20.42 |
| 7558 | 20.42 |
| 7559 | 20.41 |
| 7560 | 20.41 |
| 7561 | 20.4 |
| 7562 | 20.4 |
| 7563 | 20.39 |
| 7564 | 20.39 |
| 7565 | 20.37 |
| 7566 | 20.37 |
| 7567 | 20.36 |
| 7568 | 20.36 |
| 7569 | 20.36 |
| 7570 | 20.35 |
| 7571 | 20.34 |
| 7572 | 20.34 |
| 7573 | 20.33 |
| 7574 | 20.33 |
| 7575 | 20.33 |
| 7576 | 20.33 |
| 7577 | 20.32 |
| 7578 | 20.32 |
| 7579 | 20.3 |
| 7580 | 20.29 |
| 7581 | 20.29 |
| 7582 | 20.29 |
| 7583 | 20.28 |
| 7584 | 20.28 |
| 7585 | 20.28 |
| 7586 | 20.28 |
| 7587 | 20.28 |
| 7588 | 20.28 |
| 7589 | 20.27 |
| 7590 | 20.27 |
| 7591 | 20.27 |
| 7592 | 20.27 |
| 7593 | 20.27 |
| 7594 | 20.27 |
| 7595 | 20.27 |
| 7596 | 20.27 |
| 7597 | 20.27 |
| 7598 | 20.27 |
| 7599 | 20.27 |
| 7600 | 20.27 |
| 7601 | 20.27 |
| 7602 | 20.27 |
| 7603 | 20.27 |
| 7604 | 20.27 |
| 7605 | 20.27 |
| 7606 | 20.26 |
| 7607 | 20.26 |
| 7608 | 20.26 |
| 7609 | 20.26 |
| 7610 | 20.26 |
| 7611 | 20.26 |
| 7612 | 20.26 |
| 7613 | 20.26 |
| 7614 | 20.26 |
| 7615 | 20.26 |
| 7616 | 20.26 |
| 7617 | 20.26 |
| 7618 | 20.26 |
| 7619 | 20.26 |
| 7620 | 20.26 |
| 7621 | 20.26 |
| 7622 | 20.26 |
| 7623 | 20.26 |
| 7624 | 20.26 |
| 7625 | 20.26 |
| 7626 | 20.25 |
| 7627 | 20.25 |
| 7628 | 20.25 |
| 7629 | 20.25 |
| 7630 | 20.25 |
| 7631 | 20.25 |
| 7632 | 20.25 |
| 7633 | 20.25 |
| 7634 | 20.25 |
| 7635 | 20.25 |
| 7636 | 20.25 |
| 7637 | 20.25 |
| 7638 | 20.25 |
| 7639 | 20.25 |
| 7640 | 20.25 |
| 7641 | 20.25 |
| 7642 | 20.25 |
| 7643 | 20.25 |
| 7644 | 20.25 |
| 7645 | 20.25 |
| 7646 | 20.25 |
| 7647 | 20.25 |
| 7648 | 20.25 |
| 7649 | 20.25 |
| 7650 | 20.25 |
| 7651 | 20.25 |
| 7652 | 20.25 |
| 7653 | 20.25 |
| 7654 | 20.25 |
| 7655 | 20.25 |
| 7656 | 20.25 |
| 7657 | 20.25 |
| 7658 | 20.25 |
| 7659 | 20.25 |
| 7660 | 20.25 |
| 7661 | 20.25 |
| 7662 | 20.25 |
| 7663 | 20.25 |
| 7664 | 20.25 |
| 7665 | 20.25 |
| 7666 | 20.25 |
| 7667 | 20.25 |
| 7668 | 20.25 |
| 7669 | 20.25 |
| 7670 | 20.25 |
| 7671 | 20.25 |
| 7672 | 20.25 |
| 7673 | 20.25 |
| 7674 | 20.25 |
| 7675 | 20.25 |
| 7676 | 20.25 |
| 7677 | 20.25 |
| 7678 | 20.25 |
| 7679 | 20.25 |
| 7680 | 20.25 |
| 7681 | 20.25 |
| 7682 | 20.25 |
| 7683 | 20.25 |
| 7684 | 20.25 |
| 7685 | 20.25 |
| 7686 | 20.25 |
| 7687 | 20.25 |
| 7688 | 20.25 |
| 7689 | 20.25 |
| 7690 | 20.25 |
| 7691 | 20.25 |
| 7692 | 20.25 |
| 7693 | 20.25 |
| 7694 | 20.25 |
| 7695 | 20.25 |
| 7696 | 20.25 |
| 7697 | 20.25 |
| 7698 | 20.25 |
| 7699 | 20.25 |
| 7700 | 20.25 |
| 7701 | 20.25 |
| 7702 | 20.25 |
| 7703 | 20.25 |
| 7704 | 20.25 |
| 7705 | 20.25 |
| 7706 | 20.25 |
| 7707 | 20.25 |
| 7708 | 20.25 |
| 7709 | 20.25 |
| 7710 | 20.25 |
| 7711 | 20.25 |
| 7712 | 20.25 |
| 7713 | 20.25 |
| 7714 | 20.25 |
| 7715 | 20.25 |
| 7716 | 20.25 |
| 7717 | 20.25 |
| 7718 | 20.25 |
| 7719 | 20.25 |
| 7720 | 20.25 |
| 7721 | 20.25 |
| 7722 | 20.25 |
| 7723 | 20.25 |
| 7724 | 20.25 |
| 7725 | 20.25 |
| 7726 | 20.25 |
| 7727 | 20.25 |
| 7728 | 20.25 |
| 7729 | 20.25 |
| 7730 | 20.25 |
| 7731 | 20.25 |
| 7732 | 20.25 |
| 7733 | 20.25 |
| 7734 | 20.25 |
| 7735 | 20.25 |
| 7736 | 20.25 |
| 7737 | 20.25 |
| 7738 | 20.25 |
| 7739 | 20.25 |
| 7740 | 20.25 |
| 7741 | 20.25 |
| 7742 | 20.25 |
| 7743 | 20.25 |
| 7744 | 20.25 |
| 7745 | 20.25 |
| 7746 | 20.24 |
| 7747 | 20.24 |
| 7748 | 20.24 |
| 7749 | 20.24 |
| 7750 | 20.24 |
| 7751 | 20.24 |
| 7752 | 20.24 |
| 7753 | 20.24 |
| 7754 | 20.24 |
| 7755 | 20.24 |
| 7756 | 20.23 |
| 7757 | 20.23 |
| 7758 | 20.23 |
| 7759 | 20.23 |
| 7760 | 20.23 |
| 7761 | 20.23 |
| 7762 | 20.22 |
| 7763 | 20.22 |
| 7764 | 20.21 |
| 7765 | 20.21 |
| 7766 | 20.21 |
| 7767 | 20.21 |
| 7768 | 20.21 |
| 7769 | 20.21 |
| 7770 | 20.21 |
| 7771 | 20.21 |
| 7772 | 20.21 |
| 7773 | 20.21 |
| 7774 | 20.2 |
| 7775 | 20.2 |
| 7776 | 20.2 |
| 7777 | 20.2 |
| 7778 | 20.2 |
| 7779 | 20.2 |
| 7780 | 20.19 |
| 7781 | 20.19 |
| 7782 | 20.19 |
| 7783 | 20.18 |
| 7784 | 20.18 |
| 7785 | 20.18 |
| 7786 | 20.18 |
| 7787 | 20.18 |
| 7788 | 20.18 |
| 7789 | 20.18 |
| 7790 | 20.18 |
| 7791 | 20.17 |
| 7792 | 20.17 |
| 7793 | 20.17 |
| 7794 | 20.16 |
| 7795 | 20.16 |
| 7796 | 20.16 |
| 7797 | 20.16 |
| 7798 | 20.16 |
| 7799 | 20.16 |
| 7800 | 20.16 |
| 7801 | 20.16 |
| 7802 | 20.16 |
| 7803 | 20.15 |
| 7804 | 20.15 |
| 7805 | 20.15 |
| 7806 | 20.15 |
| 7807 | 20.15 |
| 7808 | 20.14 |
| 7809 | 20.14 |
| 7810 | 20.13 |
| 7811 | 20.13 |
| 7812 | 20.13 |
| 7813 | 20.13 |
| 7814 | 20.13 |
| 7815 | 20.13 |
| 7816 | 20.12 |
| 7817 | 20.12 |
| 7818 | 20.1 |
| 7819 | 20.1 |
| 7820 | 20.1 |
| 7821 | 20.1 |
| 7822 | 20.1 |
| 7823 | 20.1 |
| 7824 | 20.1 |
| 7825 | 20.1 |
| 7826 | 20.1 |
| 7827 | 20.1 |
| 7828 | 20.1 |
| 7829 | 20.09 |
| 7830 | 20.09 |
| 7831 | 20.08 |
| 7832 | 20.08 |
| 7833 | 20.07 |
| 7834 | 20.07 |
| 7835 | 20.06 |
| 7836 | 20.06 |
| 7837 | 20.05 |
| 7838 | 20.04 |
| 7839 | 20.03 |
| 7840 | 20.03 |
| 7841 | 20.03 |
| 7842 | 20.03 |
| 7843 | 20.02 |
| 7844 | 20.02 |
| 7845 | 20.02 |
| 7846 | 20.02 |
| 7847 | 20.01 |
| 7848 | 20.01 |
| 7849 | 20 |
| 7850 | 20 |
| 7851 | 19.99 |
| 7852 | 19.99 |
| 7853 | 19.98 |
| 7854 | 19.98 |
| 7855 | 19.98 |
| 7856 | 19.98 |
| 7857 | 19.98 |
| 7858 | 19.96 |
| 7859 | 19.95 |
| 7860 | 19.95 |
| 7861 | 19.95 |
| 7862 | 19.94 |
| 7863 | 19.92 |
| 7864 | 19.9 |
| 7865 | 19.9 |
| 7866 | 19.9 |
| 7867 | 19.89 |
| 7868 | 19.89 |
| 7869 | 19.89 |
| 7870 | 19.87 |
| 7871 | 19.86 |
| 7872 | 19.86 |
| 7873 | 19.86 |
| 7874 | 19.86 |
| 7875 | 19.85 |
| 7876 | 19.85 |
| 7877 | 19.85 |
| 7878 | 19.84 |
| 7879 | 19.83 |
| 7880 | 19.83 |
| 7881 | 19.82 |
| 7882 | 19.82 |
| 7883 | 19.81 |
| 7884 | 19.81 |
| 7885 | 19.8 |
| 7886 | 19.79 |
| 7887 | 19.79 |
| 7888 | 19.78 |
| 7889 | 19.78 |
| 7890 | 19.78 |
| 7891 | 19.78 |
| 7892 | 19.76 |
| 7893 | 19.75 |
| 7894 | 19.75 |
| 7895 | 19.75 |
| 7896 | 19.74 |
| 7897 | 19.74 |
| 7898 | 19.74 |
| 7899 | 19.74 |
| 7900 | 19.73 |
| 7901 | 19.72 |
| 7902 | 19.71 |
| 7903 | 19.71 |
| 7904 | 19.71 |
| 7905 | 19.71 |
| 7906 | 19.7 |
| 7907 | 19.7 |
| 7908 | 19.7 |
| 7909 | 19.69 |
| 7910 | 19.69 |
| 7911 | 19.68 |
| 7912 | 19.67 |
| 7913 | 19.66 |
| 7914 | 19.66 |
| 7915 | 19.66 |
| 7916 | 19.66 |
| 7917 | 19.65 |
| 7918 | 19.65 |
| 7919 | 19.65 |
| 7920 | 19.65 |
| 7921 | 19.65 |
| 7922 | 19.64 |
| 7923 | 19.64 |
| 7924 | 19.64 |
| 7925 | 19.64 |
| 7926 | 19.64 |
| 7927 | 19.64 |
| 7928 | 19.64 |
| 7929 | 19.63 |
| 7930 | 19.63 |
| 7931 | 19.62 |
| 7932 | 19.61 |
| 7933 | 19.61 |
| 7934 | 19.61 |
| 7935 | 19.59 |
| 7936 | 19.58 |
| 7937 | 19.57 |
| 7938 | 19.56 |
| 7939 | 19.53 |
| 7940 | 19.53 |
| 7941 | 19.53 |
| 7942 | 19.53 |
| 7943 | 19.52 |
| 7944 | 19.52 |
| 7945 | 19.52 |
| 7946 | 19.51 |
| 7947 | 19.49 |
| 7948 | 19.48 |
| 7949 | 19.44 |
| 7950 | 19.44 |
| 7951 | 19.44 |
| 7952 | 19.43 |
| 7953 | 19.43 |
| 7954 | 19.43 |
| 7955 | 19.42 |
| 7956 | 19.42 |
| 7957 | 19.42 |
| 7958 | 19.42 |
| 7959 | 19.41 |
| 7960 | 19.4 |
| 7961 | 19.39 |
| 7962 | 19.39 |
| 7963 | 19.39 |
| 7964 | 19.38 |
| 7965 | 19.37 |
| 7966 | 19.37 |
| 7967 | 19.36 |
| 7968 | 19.36 |
| 7969 | 19.35 |
| 7970 | 19.35 |
| 7971 | 19.35 |
| 7972 | 19.34 |
| 7973 | 19.34 |
| 7974 | 19.34 |
| 7975 | 19.33 |
| 7976 | 19.33 |
| 7977 | 19.33 |
| 7978 | 19.33 |
| 7979 | 19.33 |
| 7980 | 19.32 |
| 7981 | 19.29 |
| 7982 | 19.28 |
| 7983 | 19.27 |
| 7984 | 19.25 |
| 7985 | 19.25 |
| 7986 | 19.25 |
| 7987 | 19.24 |
| 7988 | 19.23 |
| 7989 | 19.22 |
| 7990 | 19.22 |
| 7991 | 19.22 |
| 7992 | 19.21 |
| 7993 | 19.2 |
| 7994 | 19.19 |
| 7995 | 19.19 |
| 7996 | 19.19 |
| 7997 | 19.17 |
| 7998 | 19.17 |
| 7999 | 19.16 |
| 8000 | 19.16 |
| 8001 | 19.16 |
| 8002 | 19.16 |
| 8003 | 19.15 |
| 8004 | 19.15 |
| 8005 | 19.15 |
| 8006 | 19.15 |
| 8007 | 19.14 |
| 8008 | 19.14 |
| 8009 | 19.13 |
| 8010 | 19.13 |
| 8011 | 19.13 |
| 8012 | 19.12 |
| 8013 | 19.11 |
| 8014 | 19.1 |
| 8015 | 19.1 |
| 8016 | 19.08 |
| 8017 | 19.08 |
| 8018 | 19.06 |
| 8019 | 19.05 |
| 8020 | 19.04 |
| 8021 | 19.03 |
| 8022 | 19.03 |
| 8023 | 19.03 |
| 8024 | 19.02 |
| 8025 | 19.02 |
| 8026 | 19.02 |
| 8027 | 19.02 |
| 8028 | 19.01 |
| 8029 | 19.01 |
| 8030 | 19.01 |
| 8031 | 19.01 |
| 8032 | 19.01 |
| 8033 | 19.01 |
| 8034 | 19.01 |
| 8035 | 19 |
| 8036 | 19 |
| 8037 | 18.99 |
| 8038 | 18.98 |
| 8039 | 18.97 |
| 8040 | 18.97 |
| 8041 | 18.97 |
| 8042 | 18.97 |
| 8043 | 18.97 |
| 8044 | 18.96 |
| 8045 | 18.96 |
| 8046 | 18.94 |
| 8047 | 18.93 |
| 8048 | 18.92 |
| 8049 | 18.91 |
| 8050 | 18.91 |
| 8051 | 18.9 |
| 8052 | 18.9 |
| 8053 | 18.89 |
| 8054 | 18.89 |
| 8055 | 18.89 |
| 8056 | 18.87 |
| 8057 | 18.87 |
| 8058 | 18.87 |
| 8059 | 18.87 |
| 8060 | 18.86 |
| 8061 | 18.86 |
| 8062 | 18.85 |
| 8063 | 18.85 |
| 8064 | 18.84 |
| 8065 | 18.84 |
| 8066 | 18.84 |
| 8067 | 18.83 |
| 8068 | 18.82 |
| 8069 | 18.81 |
| 8070 | 18.75 |
| 8071 | 18.73 |
| 8072 | 18.72 |
| 8073 | 18.71 |
| 8074 | 18.71 |
| 8075 | 18.71 |
| 8076 | 18.7 |
| 8077 | 18.7 |
| 8078 | 18.7 |
| 8079 | 18.7 |
| 8080 | 18.7 |
| 8081 | 18.68 |
| 8082 | 18.67 |
| 8083 | 18.66 |
| 8084 | 18.65 |
| 8085 | 18.65 |
| 8086 | 18.64 |
| 8087 | 18.64 |
| 8088 | 18.64 |
| 8089 | 18.64 |
| 8090 | 18.63 |
| 8091 | 18.63 |
| 8092 | 18.63 |
| 8093 | 18.62 |
| 8094 | 18.61 |
| 8095 | 18.61 |
| 8096 | 18.61 |
| 8097 | 18.61 |
| 8098 | 18.61 |
| 8099 | 18.6 |
| 8100 | 18.58 |
| 8101 | 18.53 |
| 8102 | 18.53 |
| 8103 | 18.52 |
| 8104 | 18.52 |
| 8105 | 18.5 |
| 8106 | 18.5 |
| 8107 | 18.49 |
| 8108 | 18.48 |
| 8109 | 18.47 |
| 8110 | 18.47 |
| 8111 | 18.47 |
| 8112 | 18.47 |
| 8113 | 18.46 |
| 8114 | 18.45 |
| 8115 | 18.44 |
| 8116 | 18.4 |
| 8117 | 18.37 |
| 8118 | 18.35 |
| 8119 | 18.35 |
| 8120 | 18.33 |
| 8121 | 18.29 |
| 8122 | 18.28 |
| 8123 | 18.26 |
| 8124 | 18.25 |
| 8125 | 18.25 |
| 8126 | 18.23 |
| 8127 | 18.22 |
| 8128 | 18.22 |
| 8129 | 18.19 |
| 8130 | 18.18 |
| 8131 | 18.17 |
| 8132 | 18.17 |
| 8133 | 18.16 |
| 8134 | 18.16 |
| 8135 | 18.16 |
| 8136 | 18.16 |
| 8137 | 18.16 |
| 8138 | 18.16 |
| 8139 | 18.16 |
| 8140 | 18.16 |
| 8141 | 18.16 |
| 8142 | 18.13 |
| 8143 | 18.13 |
| 8144 | 18.12 |
| 8145 | 18.11 |
| 8146 | 18.1 |
| 8147 | 18.1 |
| 8148 | 18.08 |
| 8149 | 18.08 |
| 8150 | 18.06 |
| 8151 | 18.05 |
| 8152 | 18.02 |
| 8153 | 18.01 |
| 8154 | 18 |
| 8155 | 17.99 |
| 8156 | 17.97 |
| 8157 | 17.96 |
| 8158 | 17.96 |
| 8159 | 17.96 |
| 8160 | 17.94 |
| 8161 | 17.94 |
| 8162 | 17.94 |
| 8163 | 17.93 |
| 8164 | 17.92 |
| 8165 | 17.91 |
| 8166 | 17.9 |
| 8167 | 17.9 |
| 8168 | 17.9 |
| 8169 | 17.89 |
| 8170 | 17.87 |
| 8171 | 17.87 |
| 8172 | 17.87 |
| 8173 | 17.86 |
| 8174 | 17.84 |
| 8175 | 17.83 |
| 8176 | 17.83 |
| 8177 | 17.83 |
| 8178 | 17.82 |
| 8179 | 17.82 |
| 8180 | 17.78 |
| 8181 | 17.78 |
| 8182 | 17.78 |
| 8183 | 17.77 |
| 8184 | 17.76 |
| 8185 | 17.75 |
| 8186 | 17.74 |
| 8187 | 17.73 |
| 8188 | 17.73 |
| 8189 | 17.73 |
| 8190 | 17.7 |
| 8191 | 17.69 |
| 8192 | 17.69 |
| 8193 | 17.69 |
| 8194 | 17.66 |
| 8195 | 17.66 |
| 8196 | 17.65 |
| 8197 | 17.63 |
| 8198 | 17.63 |
| 8199 | 17.63 |
| 8200 | 17.63 |
| 8201 | 17.62 |
| 8202 | 17.62 |
| 8203 | 17.6 |
| 8204 | 17.6 |
| 8205 | 17.6 |
| 8206 | 17.58 |
| 8207 | 17.58 |
| 8208 | 17.56 |
| 8209 | 17.56 |
| 8210 | 17.55 |
| 8211 | 17.54 |
| 8212 | 17.52 |
| 8213 | 17.51 |
| 8214 | 17.5 |
| 8215 | 17.49 |
| 8216 | 17.49 |
| 8217 | 17.46 |
| 8218 | 17.46 |
| 8219 | 17.45 |
| 8220 | 17.45 |
| 8221 | 17.43 |
| 8222 | 17.42 |
| 8223 | 17.4 |
| 8224 | 17.39 |
| 8225 | 17.38 |
| 8226 | 17.38 |
| 8227 | 17.36 |
| 8228 | 17.36 |
| 8229 | 17.35 |
| 8230 | 17.34 |
| 8231 | 17.33 |
| 8232 | 17.31 |
| 8233 | 17.31 |
| 8234 | 17.27 |
| 8235 | 17.26 |
| 8236 | 17.25 |
| 8237 | 17.22 |
| 8238 | 17.22 |
| 8239 | 17.21 |
| 8240 | 17.21 |
| 8241 | 17.2 |
| 8242 | 17.2 |
| 8243 | 17.2 |
| 8244 | 17.19 |
| 8245 | 17.17 |
| 8246 | 17.17 |
| 8247 | 17.17 |
| 8248 | 17.16 |
| 8249 | 17.16 |
| 8250 | 17.16 |
| 8251 | 17.16 |
| 8252 | 17.16 |
| 8253 | 17.16 |
| 8254 | 17.16 |
| 8255 | 17.13 |
| 8256 | 17.11 |
| 8257 | 17.1 |
| 8258 | 17.1 |
| 8259 | 17.09 |
| 8260 | 17.09 |
| 8261 | 17.08 |
| 8262 | 17.07 |
| 8263 | 17.07 |
| 8264 | 17.07 |
| 8265 | 17.07 |
| 8266 | 17.04 |
| 8267 | 17.03 |
| 8268 | 17.01 |
| 8269 | 17 |
| 8270 | 16.97 |
| 8271 | 16.97 |
| 8272 | 16.96 |
| 8273 | 16.95 |
| 8274 | 16.94 |
| 8275 | 16.93 |
| 8276 | 16.92 |
| 8277 | 16.9 |
| 8278 | 16.9 |
| 8279 | 16.9 |
| 8280 | 16.89 |
| 8281 | 16.89 |
| 8282 | 16.89 |
| 8283 | 16.88 |
| 8284 | 16.87 |
| 8285 | 16.85 |
| 8286 | 16.84 |
| 8287 | 16.84 |
| 8288 | 16.84 |
| 8289 | 16.83 |
| 8290 | 16.81 |
| 8291 | 16.81 |
| 8292 | 16.79 |
| 8293 | 16.78 |
| 8294 | 16.78 |
| 8295 | 16.78 |
| 8296 | 16.74 |
| 8297 | 16.73 |
| 8298 | 16.7 |
| 8299 | 16.68 |
| 8300 | 16.67 |
| 8301 | 16.66 |
| 8302 | 16.64 |
| 8303 | 16.64 |
| 8304 | 16.63 |
| 8305 | 16.61 |
| 8306 | 16.58 |
| 8307 | 16.57 |
| 8308 | 16.57 |
| 8309 | 16.56 |
| 8310 | 16.54 |
| 8311 | 16.53 |
| 8312 | 16.52 |
| 8313 | 16.48 |
| 8314 | 16.48 |
| 8315 | 16.47 |
| 8316 | 16.47 |
| 8317 | 16.46 |
| 8318 | 16.46 |
| 8319 | 16.45 |
| 8320 | 16.45 |
| 8321 | 16.44 |
| 8322 | 16.44 |
| 8323 | 16.43 |
| 8324 | 16.43 |
| 8325 | 16.41 |
| 8326 | 16.4 |
| 8327 | 16.38 |
| 8328 | 16.36 |
| 8329 | 16.34 |
| 8330 | 16.33 |
| 8331 | 16.32 |
| 8332 | 16.32 |
| 8333 | 16.31 |
| 8334 | 16.31 |
| 8335 | 16.31 |
| 8336 | 16.3 |
| 8337 | 16.3 |
| 8338 | 16.28 |
| 8339 | 16.27 |
| 8340 | 16.27 |
| 8341 | 16.27 |
| 8342 | 16.27 |
| 8343 | 16.27 |
| 8344 | 16.26 |
| 8345 | 16.26 |
| 8346 | 16.25 |
| 8347 | 16.25 |
| 8348 | 16.24 |
| 8349 | 16.24 |
| 8350 | 16.23 |
| 8351 | 16.22 |
| 8352 | 16.22 |
| 8353 | 16.22 |
| 8354 | 16.22 |
| 8355 | 16.21 |
| 8356 | 16.2 |
| 8357 | 16.19 |
| 8358 | 16.19 |
| 8359 | 16.18 |
| 8360 | 16.17 |
| 8361 | 16.16 |
| 8362 | 16.16 |
| 8363 | 16.12 |
| 8364 | 16.11 |
| 8365 | 16.09 |
| 8366 | 16.09 |
| 8367 | 16.05 |
| 8368 | 16.04 |
| 8369 | 16.02 |
| 8370 | 16.01 |
| 8371 | 16 |
| 8372 | 16 |
| 8373 | 16 |
| 8374 | 16 |
| 8375 | 16 |
| 8376 | 15.99 |
| 8377 | 15.98 |
| 8378 | 15.97 |
| 8379 | 15.95 |
| 8380 | 15.95 |
| 8381 | 15.93 |
| 8382 | 15.93 |
| 8383 | 15.92 |
| 8384 | 15.91 |
| 8385 | 15.91 |
| 8386 | 15.88 |
| 8387 | 15.87 |
| 8388 | 15.86 |
| 8389 | 15.85 |
| 8390 | 15.83 |
| 8391 | 15.83 |
| 8392 | 15.81 |
| 8393 | 15.79 |
| 8394 | 15.79 |
| 8395 | 15.78 |
| 8396 | 15.77 |
| 8397 | 15.75 |
| 8398 | 15.73 |
| 8399 | 15.71 |
| 8400 | 15.7 |
| 8401 | 15.68 |
| 8402 | 15.68 |
| 8403 | 15.68 |
| 8404 | 15.68 |
| 8405 | 15.67 |
| 8406 | 15.66 |
| 8407 | 15.65 |
| 8408 | 15.65 |
| 8409 | 15.63 |
| 8410 | 15.62 |
| 8411 | 15.62 |
| 8412 | 15.59 |
| 8413 | 15.58 |
| 8414 | 15.57 |
| 8415 | 15.55 |
| 8416 | 15.55 |
| 8417 | 15.55 |
| 8418 | 15.54 |
| 8419 | 15.54 |
| 8420 | 15.53 |
| 8421 | 15.51 |
| 8422 | 15.5 |
| 8423 | 15.5 |
| 8424 | 15.5 |
| 8425 | 15.49 |
| 8426 | 15.46 |
| 8427 | 15.46 |
| 8428 | 15.46 |
| 8429 | 15.44 |
| 8430 | 15.4 |
| 8431 | 15.38 |
| 8432 | 15.37 |
| 8433 | 15.37 |
| 8434 | 15.36 |
| 8435 | 15.32 |
| 8436 | 15.32 |
| 8437 | 15.32 |
| 8438 | 15.31 |
| 8439 | 15.31 |
| 8440 | 15.28 |
| 8441 | 15.27 |
| 8442 | 15.27 |
| 8443 | 15.26 |
| 8444 | 15.26 |
| 8445 | 15.26 |
| 8446 | 15.25 |
| 8447 | 15.25 |
| 8448 | 15.23 |
| 8449 | 15.22 |
| 8450 | 15.22 |
| 8451 | 15.2 |
| 8452 | 15.2 |
| 8453 | 15.19 |
| 8454 | 15.18 |
| 8455 | 15.18 |
| 8456 | 15.16 |
| 8457 | 15.16 |
| 8458 | 15.13 |
| 8459 | 15.12 |
| 8460 | 15.12 |
| 8461 | 15.12 |
| 8462 | 15.1 |
| 8463 | 15.09 |
| 8464 | 15.09 |
| 8465 | 15.08 |
| 8466 | 15.08 |
| 8467 | 15.07 |
| 8468 | 15.07 |
| 8469 | 15.07 |
| 8470 | 15.06 |
| 8471 | 15.06 |
| 8472 | 15.03 |
| 8473 | 15.03 |
| 8474 | 15 |
| 8475 | 15 |
| 8476 | 15 |
| 8477 | 15 |
| 8478 | 15 |
| 8479 | 15 |
| 8480 | 15 |
| 8481 | 15 |
| 8482 | 14.98 |
| 8483 | 14.97 |
| 8484 | 14.97 |
| 8485 | 14.96 |
| 8486 | 14.96 |
| 8487 | 14.91 |
| 8488 | 14.89 |
| 8489 | 14.89 |
| 8490 | 14.89 |
| 8491 | 14.89 |
| 8492 | 14.88 |
| 8493 | 14.88 |
| 8494 | 14.87 |
| 8495 | 14.86 |
| 8496 | 14.85 |
| 8497 | 14.85 |
| 8498 | 14.81 |
| 8499 | 14.8 |
| 8500 | 14.79 |
| 8501 | 14.78 |
| 8502 | 14.76 |
| 8503 | 14.74 |
| 8504 | 14.74 |
| 8505 | 14.74 |
| 8506 | 14.73 |
| 8507 | 14.73 |
| 8508 | 14.73 |
| 8509 | 14.73 |
| 8510 | 14.71 |
| 8511 | 14.7 |
| 8512 | 14.7 |
| 8513 | 14.7 |
| 8514 | 14.69 |
| 8515 | 14.69 |
| 8516 | 14.68 |
| 8517 | 14.67 |
| 8518 | 14.67 |
| 8519 | 14.66 |
| 8520 | 14.66 |
| 8521 | 14.65 |
| 8522 | 14.65 |
| 8523 | 14.64 |
| 8524 | 14.63 |
| 8525 | 14.63 |
| 8526 | 14.59 |
| 8527 | 14.59 |
| 8528 | 14.58 |
| 8529 | 14.57 |
| 8530 | 14.56 |
| 8531 | 14.56 |
| 8532 | 14.52 |
| 8533 | 14.52 |
| 8534 | 14.49 |
| 8535 | 14.48 |
| 8536 | 14.47 |
| 8537 | 14.46 |
| 8538 | 14.46 |
| 8539 | 14.46 |
| 8540 | 14.46 |
| 8541 | 14.44 |
| 8542 | 14.44 |
| 8543 | 14.4 |
| 8544 | 14.38 |
| 8545 | 14.35 |
| 8546 | 14.34 |
| 8547 | 14.32 |
| 8548 | 14.32 |
| 8549 | 14.3 |
| 8550 | 14.29 |
| 8551 | 14.24 |
| 8552 | 14.24 |
| 8553 | 14.23 |
| 8554 | 14.23 |
| 8555 | 14.22 |
| 8556 | 14.21 |
| 8557 | 14.2 |
| 8558 | 14.2 |
| 8559 | 14.2 |
| 8560 | 14.19 |
| 8561 | 14.17 |
| 8562 | 14.16 |
| 8563 | 14.16 |
| 8564 | 14.16 |
| 8565 | 14.16 |
| 8566 | 14.16 |
| 8567 | 14.16 |
| 8568 | 14.16 |
| 8569 | 14.16 |
| 8570 | 14.16 |
| 8571 | 14.16 |
| 8572 | 14.16 |
| 8573 | 14.15 |
| 8574 | 14.15 |
| 8575 | 14.13 |
| 8576 | 14.13 |
| 8577 | 14.11 |
| 8578 | 14.09 |
| 8579 | 14.04 |
| 8580 | 14.03 |
| 8581 | 14.01 |
| 8582 | 14 |
| 8583 | 13.99 |
| 8584 | 13.98 |
| 8585 | 13.91 |
| 8586 | 13.86 |
| 8587 | 13.86 |
| 8588 | 13.86 |
| 8589 | 13.86 |
| 8590 | 13.84 |
| 8591 | 13.84 |
| 8592 | 13.81 |
| 8593 | 13.79 |
| 8594 | 13.74 |
| 8595 | 13.74 |
| 8596 | 13.72 |
| 8597 | 13.67 |
| 8598 | 13.58 |
| 8599 | 13.57 |
| 8600 | 13.54 |
| 8601 | 13.48 |
| 8602 | 13.45 |
| 8603 | 13.41 |
| 8604 | 13.41 |
| 8605 | 13.38 |
| 8606 | 13.35 |
| 8607 | 13.35 |
| 8608 | 13.31 |
| 8609 | 13.31 |
| 8610 | 13.25 |
| 8611 | 13.25 |
| 8612 | 13.22 |
| 8613 | 13.21 |
| 8614 | 13.16 |
| 8615 | 13.16 |
| 8616 | 13.16 |
| 8617 | 13.16 |
| 8618 | 13.16 |
| 8619 | 13.16 |
| 8620 | 13.16 |
| 8621 | 13.16 |
| 8622 | 13.16 |
| 8623 | 13.16 |
| 8624 | 13.15 |
| 8625 | 13.15 |
| 8626 | 13.13 |
| 8627 | 13.13 |
| 8628 | 13.13 |
| 8629 | 13.11 |
| 8630 | 13.1 |
| 8631 | 13.08 |
| 8632 | 13.08 |
| 8633 | 13.07 |
| 8634 | 13.02 |
| 8635 | 13 |
| 8636 | 13 |
| 8637 | 13 |
| 8638 | 13 |
| 8639 | 12.96 |
| 8640 | 12.95 |
| 8641 | 12.94 |
| 8642 | 12.93 |
| 8643 | 12.93 |
| 8644 | 12.89 |
| 8645 | 12.88 |
| 8646 | 12.87 |
| 8647 | 12.87 |
| 8648 | 12.86 |
| 8649 | 12.85 |
| 8650 | 12.85 |
| 8651 | 12.85 |
| 8652 | 12.84 |
| 8653 | 12.84 |
| 8654 | 12.83 |
| 8655 | 12.79 |
| 8656 | 12.79 |
| 8657 | 12.75 |
| 8658 | 12.73 |
| 8659 | 12.67 |
| 8660 | 12.67 |
| 8661 | 12.66 |
| 8662 | 12.64 |
| 8663 | 12.62 |
| 8664 | 12.6 |
| 8665 | 12.56 |
| 8666 | 12.56 |
| 8667 | 12.53 |
| 8668 | 12.46 |
| 8669 | 12.46 |
| 8670 | 12.44 |
| 8671 | 12.43 |
| 8672 | 12.42 |
| 8673 | 12.42 |
| 8674 | 12.41 |
| 8675 | 12.4 |
| 8676 | 12.38 |
| 8677 | 12.34 |
| 8678 | 12.34 |
| 8679 | 12.3 |
| 8680 | 12.29 |
| 8681 | 12.27 |
| 8682 | 12.25 |
| 8683 | 12.24 |
| 8684 | 12.12 |
| 8685 | 12.12 |
| 8686 | 12.07 |
| 8687 | 12.05 |
| 8688 | 12.04 |
| 8689 | 12.03 |
| 8690 | 12 |
| 8691 | 11.97 |
| 8692 | 11.95 |
| 8693 | 11.92 |
| 8694 | 11.91 |
| 8695 | 11.9 |
| 8696 | 11.87 |
| 8697 | 11.83 |
| 8698 | 11.83 |
| 8699 | 11.75 |
| 8700 | 11.72 |
| 8701 | 11.67 |
| 8702 | 11.67 |
| 8703 | 11.62 |
| 8704 | 11.59 |
| 8705 | 11.55 |
| 8706 | 11.53 |
| 8707 | 11.52 |
| 8708 | 11.5 |
| 8709 | 11.45 |
| 8710 | 11.42 |
| 8711 | 11.37 |
| 8712 | 11.35 |
| 8713 | 11.34 |
| 8714 | 11.17 |
| 8715 | 11.11 |
| 8716 | 11.1 |
| 8717 | 11 |
| 8718 | 11 |
| 8719 | 11 |
| 8720 | 11 |
| 8721 | 11 |
| 8722 | 10.95 |
| 8723 | 10.93 |
| 8724 | 10.75 |
| 8725 | 10.7 |
| 8726 | 10.68 |
| 8727 | 10.68 |
| 8728 | 10.67 |
| 8729 | 10.65 |
| 8730 | 10.52 |
| 8731 | 10.52 |
| 8732 | 10.41 |
| 8733 | 10.35 |
| 8734 | 10.2 |
| 8735 | 10.14 |
| 8736 | 9.9 |
| 8737 | 9.7 |
| 8738 | 9.68 |
| 8739 | 9.66 |
| 8740 | 9.64 |
| 8741 | 9.62 |
| 8742 | 9.61 |
| 8743 | 9.57 |
| 8744 | 9.54 |
| 8745 | 9.53 |
| 8746 | 9.38 |
| 8747 | 9.36 |
| 8748 | 9.35 |
| 8749 | 9.23 |
| 8750 | 8.9 |
| 8751 | 8.5 |
| 8752 | 8.09 |
| 8753 | 7.71 |
| 8754 | 7.49 |
| 8755 | 7.29 |
| 8756 | 7.28 |
| 8757 | 7.24 |
| 8758 | 7.16 |
| 8759 | 6.98 |